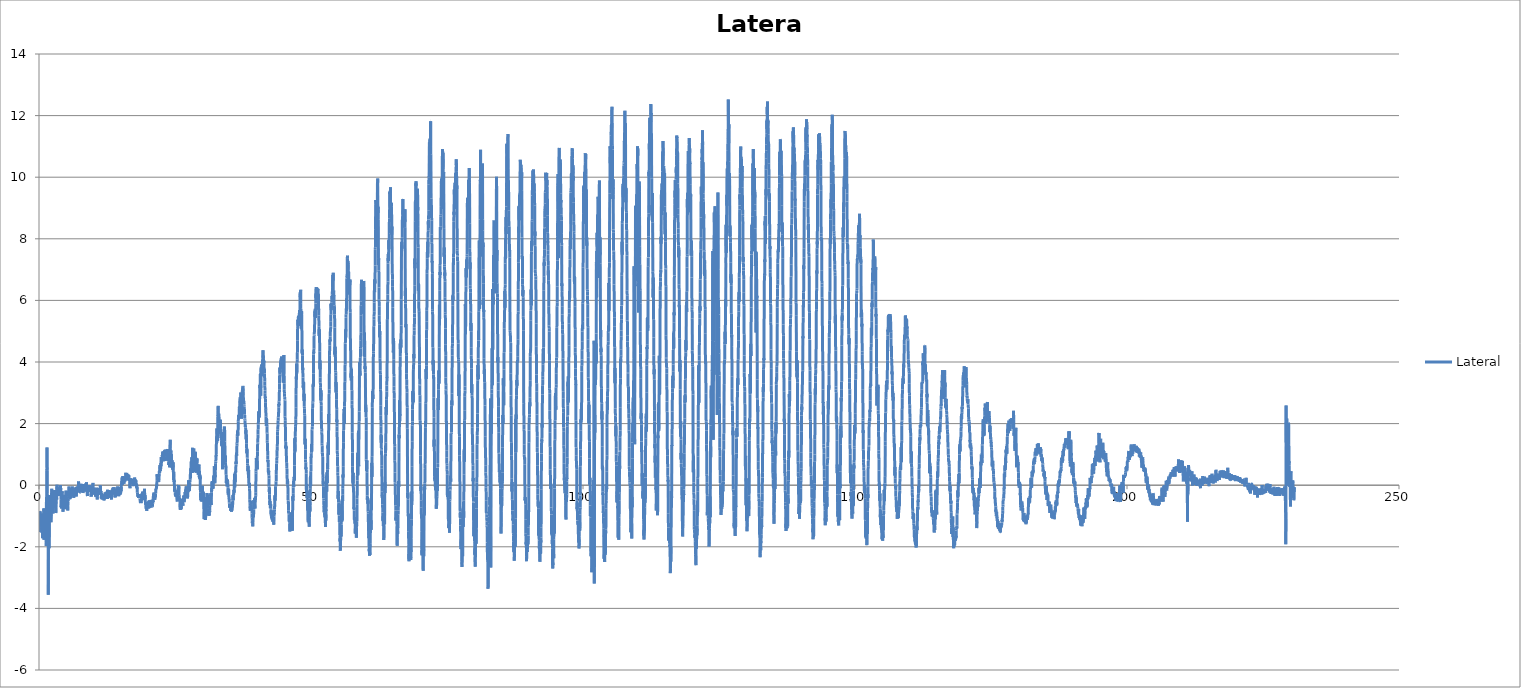
| Category | Lateral |
|---|---|
| 0.014945 | -1.185 |
| 0.035636 | -1.504 |
| 0.055821 | -1.523 |
| 0.076044 | -1.369 |
| 0.098121 | -1.33 |
| 0.115069 | -1.127 |
| 0.135773 | -1.061 |
| 0.155165 | -0.896 |
| 0.176035 | -0.906 |
| 0.197 | -0.848 |
| 0.215319 | -0.848 |
| 0.235327 | -1.128 |
| 0.25648 | -0.983 |
| 0.276005 | -1.012 |
| 0.296604 | -0.954 |
| 0.315138 | -1.194 |
| 0.335667 | -1.32 |
| 0.355463 | -1.069 |
| 0.376 | -1.05 |
| 0.399738 | -1.224 |
| 0.41528 | -0.933 |
| 0.436085 | -0.943 |
| 0.455854 | -1.186 |
| 0.476437 | -1.205 |
| 0.498872 | -1.166 |
| 0.514997 | -1.234 |
| 0.535722 | -1.545 |
| 0.556269 | -1.15 |
| 0.57613 | -0.917 |
| 0.597996 | -1.325 |
| 0.615611 | -1.113 |
| 0.635685 | -1.565 |
| 0.655853 | -1.719 |
| 0.676009 | -1.371 |
| 0.69694 | -1.197 |
| 0.7153 | -1.052 |
| 0.735665 | -1.312 |
| 0.756108 | -1.206 |
| 0.776408 | -1.506 |
| 0.797321 | -1.131 |
| 0.815092 | -1.27 |
| 0.835961 | -1.513 |
| 0.856207 | -0.77 |
| 0.876014 | -0.752 |
| 0.896821 | -0.856 |
| 0.91549 | -1.194 |
| 0.935716 | -1.774 |
| 0.956297 | -1.165 |
| 0.976011 | -1.309 |
| 0.998525 | -1.483 |
| 1.01508 | -1.522 |
| 1.035636 | -1.281 |
| 1.055848 | -1.185 |
| 1.07625 | -1.176 |
| 1.097618 | -1.523 |
| 1.115062 | -1.464 |
| 1.135414 | -1.338 |
| 1.156078 | -1.127 |
| 1.176083 | -1.319 |
| 1.196773 | -0.897 |
| 1.214975 | -0.935 |
| 1.235658 | -1.079 |
| 1.255839 | -1.359 |
| 1.27602 | -1.108 |
| 1.298763 | -1.139 |
| 1.315003 | -1.855 |
| 1.335448 | -1.974 |
| 1.355851 | -0.544 |
| 1.376145 | -0.613 |
| 1.396741 | -0.594 |
| 1.414998 | 0.07 |
| 1.435743 | 0.483 |
| 1.455804 | 0.549 |
| 1.476003 | 1.226 |
| 1.496659 | 0.474 |
| 1.514989 | -0.268 |
| 1.535668 | -0.567 |
| 1.555949 | -0.568 |
| 1.576136 | -1.332 |
| 1.597998 | -1.207 |
| 1.615086 | -1.671 |
| 1.635797 | -1.398 |
| 1.655927 | -1.669 |
| 1.676022 | -1.738 |
| 1.696716 | -2.645 |
| 1.715102 | -3.56 |
| 1.735607 | -1.97 |
| 1.755897 | -1.228 |
| 1.776004 | -0.537 |
| 1.79715 | -0.399 |
| 1.814993 | -1.694 |
| 1.835722 | -0.657 |
| 1.855864 | -2.044 |
| 1.875749 | -0.467 |
| 1.898039 | -0.321 |
| 1.914965 | -0.485 |
| 1.935554 | -0.601 |
| 1.975689 | -0.796 |
| 1.999181 | -0.854 |
| 2.015033 | -0.593 |
| 2.03618 | -0.457 |
| 2.055874 | -0.476 |
| 2.076005 | -0.477 |
| 2.096361 | -0.544 |
| 2.115169 | -0.611 |
| 2.135686 | -1.056 |
| 2.15586 | -1.083 |
| 2.17647 | -0.852 |
| 2.198228 | -0.939 |
| 2.215241 | -1.2 |
| 2.235702 | -0.93 |
| 2.255789 | -0.746 |
| 2.275571 | -0.678 |
| 2.296472 | -0.65 |
| 2.315078 | -0.244 |
| 2.33564 | -0.331 |
| 2.3558 | -0.118 |
| 2.376016 | -0.301 |
| 2.396627 | -0.514 |
| 2.415024 | -0.292 |
| 2.436973 | -0.649 |
| 2.455842 | -0.477 |
| 2.475185 | -0.486 |
| 2.499318 | -0.814 |
| 2.515209 | -0.349 |
| 2.535992 | -0.254 |
| 2.555846 | -0.533 |
| 2.576002 | -0.92 |
| 2.597476 | -0.658 |
| 2.615094 | -0.591 |
| 2.635766 | -0.398 |
| 2.655857 | -0.195 |
| 2.675682 | -0.253 |
| 2.696545 | -0.166 |
| 2.715037 | -0.301 |
| 2.735756 | -0.407 |
| 2.755554 | -0.485 |
| 2.776007 | -0.389 |
| 2.79752 | -0.601 |
| 2.814985 | -0.456 |
| 2.835516 | -0.321 |
| 2.855839 | -0.456 |
| 2.876013 | -0.514 |
| 2.898767 | -0.746 |
| 2.91499 | -0.456 |
| 2.935938 | -0.321 |
| 2.956455 | -0.166 |
| 2.976001 | -0.388 |
| 2.996873 | -0.571 |
| 3.01503 | -0.658 |
| 3.035669 | -0.581 |
| 3.056022 | -0.533 |
| 3.075319 | -0.755 |
| 3.097545 | -0.9 |
| 3.115012 | -0.891 |
| 3.135582 | -0.726 |
| 3.155428 | -0.543 |
| 3.176012 | -0.321 |
| 3.196802 | -0.167 |
| 3.215046 | -0.321 |
| 3.235552 | -0.408 |
| 3.256064 | -0.466 |
| 3.276004 | -0.148 |
| 3.296298 | 0.016 |
| 3.316156 | -0.128 |
| 3.335606 | -0.263 |
| 3.355859 | -0.224 |
| 3.376001 | -0.234 |
| 3.398241 | -0.215 |
| 3.41499 | -0.292 |
| 3.435645 | -0.321 |
| 3.455905 | -0.35 |
| 3.475113 | -0.244 |
| 3.496417 | -0.069 |
| 3.514999 | -0.205 |
| 3.535717 | -0.214 |
| 3.555184 | -0.321 |
| 3.575557 | -0.34 |
| 3.596701 | -0.138 |
| 3.615173 | -0.089 |
| 3.635507 | -0.321 |
| 3.6559 | -0.205 |
| 3.676003 | -0.119 |
| 3.698724 | -0.099 |
| 3.717467 | -0.176 |
| 3.737209 | -0.234 |
| 3.75593 | -0.331 |
| 3.775328 | -0.34 |
| 3.795986 | -0.205 |
| 3.814991 | -0.157 |
| 3.835682 | -0.215 |
| 3.855834 | -0.128 |
| 3.875673 | -0.04 |
| 3.8965 | -0.012 |
| 3.915178 | -0.118 |
| 3.935427 | -0.195 |
| 3.955047 | 0.008 |
| 3.976005 | -0.137 |
| 3.99692 | -0.089 |
| 4.014988 | -0.205 |
| 4.035417 | -0.466 |
| 4.055816 | -0.717 |
| 4.075997 | -0.678 |
| 4.097205 | -0.688 |
| 4.116096 | -0.621 |
| 4.136451 | -0.756 |
| 4.15586 | -0.707 |
| 4.176001 | -0.418 |
| 4.197642 | -0.418 |
| 4.21514 | -0.389 |
| 4.235757 | -0.418 |
| 4.256561 | -0.196 |
| 4.276519 | -0.264 |
| 4.296896 | -0.457 |
| 4.315353 | -0.389 |
| 4.335888 | -0.495 |
| 4.356982 | -0.36 |
| 4.37601 | -0.457 |
| 4.397084 | -0.649 |
| 4.415363 | -0.862 |
| 4.438569 | -0.775 |
| 4.45611 | -0.649 |
| 4.476093 | -0.349 |
| 4.49714 | -0.378 |
| 4.518319 | -0.465 |
| 4.536562 | -0.369 |
| 4.555971 | -0.504 |
| 4.576031 | -0.582 |
| 4.600024 | -0.688 |
| 4.615184 | -0.697 |
| 4.635675 | -0.504 |
| 4.656048 | -0.63 |
| 4.678576 | -0.582 |
| 4.695278 | -0.485 |
| 4.715118 | -0.321 |
| 4.735944 | -0.504 |
| 4.760573 | -0.775 |
| 4.776 | -0.775 |
| 4.795495 | -0.64 |
| 4.815935 | -0.737 |
| 4.838143 | -0.572 |
| 4.85592 | -0.582 |
| 4.875996 | -0.563 |
| 4.894999 | -0.486 |
| 4.920213 | -0.263 |
| 4.935964 | -0.263 |
| 4.956526 | -0.176 |
| 4.97599 | -0.214 |
| 5.027029 | -0.301 |
| 5.036021 | -0.408 |
| 5.05586 | -0.553 |
| 5.07701 | -0.717 |
| 5.095189 | -0.736 |
| 5.115047 | -0.659 |
| 5.13594 | -0.785 |
| 5.157704 | -0.649 |
| 5.176059 | -0.524 |
| 5.195515 | -0.64 |
| 5.21504 | -0.534 |
| 5.235927 | -0.631 |
| 5.256481 | -0.678 |
| 5.275999 | -0.688 |
| 5.295607 | -0.823 |
| 5.315884 | -0.563 |
| 5.335866 | -0.524 |
| 5.355843 | -0.514 |
| 5.375996 | -0.437 |
| 5.400783 | -0.369 |
| 5.415457 | -0.196 |
| 5.435506 | -0.215 |
| 5.455857 | -0.34 |
| 5.481898 | -0.36 |
| 5.49514 | -0.157 |
| 5.515122 | -0.041 |
| 5.535547 | -0.283 |
| 5.56198 | -0.35 |
| 5.576006 | -0.35 |
| 5.595016 | -0.398 |
| 5.615554 | -0.311 |
| 5.638791 | -0.34 |
| 5.655841 | -0.418 |
| 5.675991 | -0.456 |
| 5.695313 | -0.36 |
| 5.721277 | -0.418 |
| 5.735953 | -0.427 |
| 5.755838 | -0.34 |
| 5.776208 | -0.302 |
| 5.803278 | -0.408 |
| 5.814978 | -0.408 |
| 5.835628 | -0.282 |
| 5.855869 | -0.311 |
| 5.883488 | -0.167 |
| 5.89525 | -0.196 |
| 5.914989 | -0.186 |
| 5.935853 | -0.253 |
| 5.96412 | -0.301 |
| 5.975991 | -0.282 |
| 5.996781 | -0.099 |
| 6.015106 | -0.166 |
| 6.042456 | -0.321 |
| 6.055881 | -0.311 |
| 6.075984 | -0.224 |
| 6.096869 | -0.041 |
| 6.143107 | -0.157 |
| 6.155649 | -0.186 |
| 6.176119 | -0.282 |
| 6.197401 | -0.341 |
| 6.215084 | -0.283 |
| 6.23568 | -0.282 |
| 6.276015 | -0.292 |
| 6.300455 | -0.321 |
| 6.314932 | -0.321 |
| 6.335613 | -0.166 |
| 6.35597 | -0.215 |
| 6.381831 | -0.359 |
| 6.395 | -0.408 |
| 6.415118 | -0.32 |
| 6.435851 | -0.311 |
| 6.458169 | -0.35 |
| 6.475996 | -0.36 |
| 6.495289 | -0.36 |
| 6.514994 | -0.273 |
| 6.536813 | -0.157 |
| 6.556187 | -0.128 |
| 6.575841 | -0.089 |
| 6.595039 | -0.254 |
| 6.61962 | -0.321 |
| 6.635961 | -0.302 |
| 6.655824 | -0.263 |
| 6.675995 | -0.147 |
| 6.700858 | -0.321 |
| 6.71522 | -0.34 |
| 6.735588 | -0.311 |
| 6.755835 | -0.263 |
| 6.780711 | -0.166 |
| 6.795036 | -0.118 |
| 6.815107 | -0.06 |
| 6.835809 | -0.176 |
| 6.861759 | -0.369 |
| 6.876216 | -0.311 |
| 6.895435 | -0.234 |
| 6.915559 | -0.215 |
| 6.938976 | -0.254 |
| 6.956005 | -0.157 |
| 6.975985 | -0.166 |
| 6.994994 | -0.079 |
| 7.02156 | -0.041 |
| 7.036023 | -0.205 |
| 7.05542 | -0.234 |
| 7.075228 | -0.099 |
| 7.103108 | -0.205 |
| 7.114925 | -0.215 |
| 7.136072 | -0.089 |
| 7.155737 | -0.06 |
| 7.205596 | -0.07 |
| 7.215168 | -0.06 |
| 7.235767 | -0.051 |
| 7.255853 | 0.036 |
| 7.275831 | 0.123 |
| 7.296729 | 0.056 |
| 7.315149 | 0.026 |
| 7.336681 | -0.08 |
| 7.355998 | -0.07 |
| 7.375992 | -0.089 |
| 7.39737 | -0.109 |
| 7.417131 | -0.012 |
| 7.435812 | 0.017 |
| 7.455825 | -0.05 |
| 7.476106 | -0.147 |
| 7.498347 | -0.224 |
| 7.514932 | -0.185 |
| 7.535712 | -0.176 |
| 7.556595 | -0.176 |
| 7.576059 | -0.205 |
| 7.596739 | -0.186 |
| 7.615045 | -0.195 |
| 7.63561 | -0.234 |
| 7.658169 | -0.234 |
| 7.676005 | -0.157 |
| 7.696774 | -0.09 |
| 7.715228 | -0.119 |
| 7.736889 | -0.176 |
| 7.755975 | -0.089 |
| 7.776079 | -0.069 |
| 7.797991 | 0.008 |
| 7.819197 | 0.037 |
| 7.835346 | 0.046 |
| 7.855923 | -0.118 |
| 7.875992 | -0.108 |
| 7.900284 | 0.037 |
| 7.915139 | -0.012 |
| 7.935832 | -0.138 |
| 7.955858 | -0.186 |
| 7.980392 | -0.186 |
| 7.995262 | -0.195 |
| 8.015492 | -0.07 |
| 8.03594 | -0.157 |
| 8.063771 | -0.08 |
| 8.076046 | -0.147 |
| 8.095533 | -0.253 |
| 8.11498 | -0.234 |
| 8.138236 | -0.06 |
| 8.156006 | -0.031 |
| 8.176057 | -0.041 |
| 8.195081 | -0.079 |
| 8.221293 | -0.098 |
| 8.235969 | -0.089 |
| 8.25585 | 0.008 |
| 8.275983 | 0.037 |
| 8.321285 | -0.176 |
| 8.336107 | -0.157 |
| 8.355831 | -0.128 |
| 8.376379 | -0.041 |
| 8.395788 | -0.166 |
| 8.415083 | -0.196 |
| 8.43604 | -0.205 |
| 8.456459 | -0.119 |
| 8.475994 | -0.109 |
| 8.495517 | -0.176 |
| 8.515155 | -0.099 |
| 8.535468 | -0.118 |
| 8.555935 | -0.137 |
| 8.575408 | -0.079 |
| 8.594962 | -0.011 |
| 8.615193 | 0.056 |
| 8.635921 | -0.002 |
| 8.655837 | -0.118 |
| 8.676087 | -0.04 |
| 8.698775 | 0.008 |
| 8.715132 | 0.095 |
| 8.735904 | 0.007 |
| 8.755831 | -0.138 |
| 8.779523 | -0.166 |
| 8.796395 | -0.166 |
| 8.815002 | -0.205 |
| 8.83582 | -0.225 |
| 8.857956 | -0.186 |
| 8.875452 | -0.34 |
| 8.896539 | -0.35 |
| 8.914971 | -0.263 |
| 8.936963 | -0.195 |
| 8.955942 | -0.224 |
| 8.976062 | -0.186 |
| 8.998762 | -0.166 |
| 9.019269 | -0.195 |
| 9.0367 | -0.157 |
| 9.05587 | -0.089 |
| 9.075535 | -0.002 |
| 9.100358 | -0.06 |
| 9.116081 | -0.05 |
| 9.135895 | -0.05 |
| 9.155972 | -0.175 |
| 9.180509 | -0.195 |
| 9.194984 | -0.069 |
| 9.215408 | -0.147 |
| 9.235829 | -0.117 |
| 9.262106 | -0.031 |
| 9.275991 | -0.002 |
| 9.295539 | -0.176 |
| 9.315187 | -0.214 |
| 9.356111 | -0.185 |
| 9.375972 | -0.089 |
| 9.395723 | -0.079 |
| 9.439475 | -0.089 |
| 9.456304 | -0.156 |
| 9.47594 | -0.118 |
| 9.497963 | -0.021 |
| 9.516114 | -0.05 |
| 9.535679 | -0.127 |
| 9.555835 | -0.321 |
| 9.576794 | -0.369 |
| 9.596761 | -0.311 |
| 9.615391 | -0.282 |
| 9.636083 | -0.359 |
| 9.655542 | -0.292 |
| 9.675997 | -0.282 |
| 9.697193 | -0.166 |
| 9.714924 | -0.108 |
| 9.736665 | -0.205 |
| 9.756093 | -0.04 |
| 9.775958 | -0.137 |
| 9.796814 | -0.05 |
| 9.818585 | -0.119 |
| 9.835982 | -0.07 |
| 9.855888 | -0.176 |
| 9.876186 | -0.127 |
| 9.900393 | 0.056 |
| 9.915664 | 0.075 |
| 9.9357 | -0.002 |
| 9.955933 | -0.147 |
| 9.97888 | -0.244 |
| 9.995255 | -0.166 |
| 10.014971 | -0.176 |
| 10.035883 | -0.166 |
| 10.060653 | -0.224 |
| 10.076022 | -0.224 |
| 10.095228 | -0.291 |
| 10.114956 | -0.185 |
| 10.138725 | -0.127 |
| 10.15604 | -0.117 |
| 10.176581 | -0.137 |
| 10.195048 | -0.127 |
| 10.220328 | -0.137 |
| 10.2359 | -0.253 |
| 10.255952 | -0.311 |
| 10.275977 | -0.244 |
| 10.30287 | -0.176 |
| 10.315221 | -0.205 |
| 10.335643 | -0.282 |
| 10.355837 | -0.176 |
| 10.383272 | -0.311 |
| 10.395069 | -0.369 |
| 10.415078 | -0.282 |
| 10.435916 | -0.311 |
| 10.463281 | -0.282 |
| 10.476035 | -0.292 |
| 10.496413 | -0.369 |
| 10.515154 | -0.378 |
| 10.55943 | -0.224 |
| 10.576216 | -0.253 |
| 10.595309 | -0.195 |
| 10.615072 | -0.079 |
| 10.635942 | -0.253 |
| 10.655861 | -0.311 |
| 10.675984 | -0.32 |
| 10.698027 | -0.369 |
| 10.715144 | -0.466 |
| 10.735486 | -0.369 |
| 10.755821 | -0.205 |
| 10.777175 | -0.137 |
| 10.795355 | -0.224 |
| 10.814969 | -0.263 |
| 10.835847 | -0.234 |
| 10.859119 | -0.157 |
| 10.875995 | -0.224 |
| 10.895635 | -0.312 |
| 10.914967 | -0.214 |
| 10.93785 | -0.089 |
| 10.955923 | -0.186 |
| 10.975994 | -0.224 |
| 10.995388 | -0.176 |
| 11.018885 | -0.176 |
| 11.035913 | -0.205 |
| 11.055899 | -0.147 |
| 11.076127 | -0.176 |
| 11.101242 | -0.156 |
| 11.115202 | -0.176 |
| 11.135731 | -0.224 |
| 11.155382 | -0.234 |
| 11.182446 | -0.157 |
| 11.194986 | -0.176 |
| 11.215012 | -0.233 |
| 11.235829 | -0.243 |
| 11.261896 | -0.157 |
| 11.275999 | -0.002 |
| 11.295564 | -0.089 |
| 11.315595 | -0.253 |
| 11.339503 | -0.253 |
| 11.355946 | -0.302 |
| 11.376231 | -0.234 |
| 11.396577 | -0.186 |
| 11.421722 | -0.321 |
| 11.436072 | -0.389 |
| 11.455839 | -0.427 |
| 11.47532 | -0.369 |
| 11.502925 | -0.263 |
| 11.515203 | -0.311 |
| 11.53564 | -0.417 |
| 11.555833 | -0.446 |
| 11.601091 | -0.359 |
| 11.614926 | -0.379 |
| 11.636183 | -0.465 |
| 11.654936 | -0.407 |
| 11.675498 | -0.311 |
| 11.696875 | -0.35 |
| 11.715009 | -0.301 |
| 11.735351 | -0.331 |
| 11.755905 | -0.34 |
| 11.775982 | -0.418 |
| 11.796771 | -0.437 |
| 11.817321 | -0.37 |
| 11.836011 | -0.389 |
| 11.855827 | -0.34 |
| 11.875983 | -0.35 |
| 11.899984 | -0.35 |
| 11.914899 | -0.369 |
| 11.935666 | -0.427 |
| 11.955774 | -0.495 |
| 11.979581 | -0.456 |
| 11.995889 | -0.465 |
| 12.014968 | -0.369 |
| 12.03583 | -0.446 |
| 12.060139 | -0.388 |
| 12.076116 | -0.35 |
| 12.095061 | -0.369 |
| 12.136009 | -0.311 |
| 12.160277 | -0.234 |
| 12.176042 | -0.341 |
| 12.195902 | -0.35 |
| 12.214935 | -0.379 |
| 12.237173 | -0.35 |
| 12.255724 | -0.312 |
| 12.275976 | -0.331 |
| 12.295366 | -0.292 |
| 12.319652 | -0.379 |
| 12.336257 | -0.292 |
| 12.355872 | -0.292 |
| 12.376228 | -0.215 |
| 12.401898 | -0.282 |
| 12.415457 | -0.302 |
| 12.436177 | -0.302 |
| 12.455943 | -0.292 |
| 12.480653 | -0.282 |
| 12.495681 | -0.215 |
| 12.515052 | -0.225 |
| 12.535818 | -0.447 |
| 12.56289 | -0.331 |
| 12.575986 | -0.148 |
| 12.596968 | -0.292 |
| 12.615122 | -0.312 |
| 12.648064 | -0.427 |
| 12.675926 | -0.321 |
| 12.697096 | -0.224 |
| 12.73904 | -0.311 |
| 12.756112 | -0.33 |
| 12.776265 | -0.35 |
| 12.798212 | -0.176 |
| 12.815968 | -0.157 |
| 12.835554 | -0.225 |
| 12.855886 | -0.331 |
| 12.877781 | -0.253 |
| 12.897252 | -0.225 |
| 12.915095 | -0.234 |
| 12.936606 | -0.322 |
| 12.95532 | -0.36 |
| 12.976028 | -0.331 |
| 12.996974 | -0.176 |
| 13.015046 | -0.215 |
| 13.036022 | -0.195 |
| 13.056156 | -0.263 |
| 13.076008 | -0.408 |
| 13.096863 | -0.273 |
| 13.117249 | -0.244 |
| 13.136122 | -0.225 |
| 13.155682 | -0.244 |
| 13.17581 | -0.283 |
| 13.19887 | -0.36 |
| 13.215988 | -0.312 |
| 13.235991 | -0.196 |
| 13.255816 | -0.244 |
| 13.278184 | -0.341 |
| 13.295426 | -0.341 |
| 13.315001 | -0.447 |
| 13.335864 | -0.466 |
| 13.360099 | -0.263 |
| 13.376225 | -0.321 |
| 13.395691 | -0.35 |
| 13.414966 | -0.389 |
| 13.43891 | -0.176 |
| 13.456547 | -0.147 |
| 13.475473 | -0.196 |
| 13.495712 | -0.302 |
| 13.520494 | -0.206 |
| 13.536208 | -0.254 |
| 13.555953 | -0.148 |
| 13.575972 | -0.1 |
| 13.602575 | -0.177 |
| 13.615326 | -0.177 |
| 13.636399 | -0.158 |
| 13.655891 | -0.07 |
| 13.681889 | -0.109 |
| 13.695027 | -0.1 |
| 13.714978 | -0.119 |
| 13.735967 | -0.138 |
| 13.764713 | -0.177 |
| 13.775983 | -0.177 |
| 13.796421 | -0.128 |
| 13.815096 | -0.07 |
| 13.860967 | -0.215 |
| 13.87619 | -0.186 |
| 13.895249 | -0.148 |
| 13.914989 | -0.129 |
| 13.935689 | -0.206 |
| 13.955825 | -0.283 |
| 13.975982 | -0.341 |
| 13.997118 | -0.331 |
| 14.01518 | -0.37 |
| 14.035524 | -0.399 |
| 14.055885 | -0.293 |
| 14.077676 | -0.302 |
| 14.096543 | -0.341 |
| 14.114962 | -0.322 |
| 14.135637 | -0.273 |
| 14.156582 | -0.225 |
| 14.175995 | -0.293 |
| 14.19663 | -0.322 |
| 14.214958 | -0.351 |
| 14.234944 | -0.196 |
| 14.255854 | -0.128 |
| 14.276064 | -0.177 |
| 14.29889 | -0.128 |
| 14.31813 | -0.215 |
| 14.336083 | -0.196 |
| 14.355867 | -0.128 |
| 14.376056 | -0.09 |
| 14.400449 | -0.08 |
| 14.414892 | -0.128 |
| 14.435687 | -0.177 |
| 14.455823 | -0.157 |
| 14.476939 | -0.07 |
| 14.495522 | -0.041 |
| 14.515005 | -0.099 |
| 14.535855 | -0.292 |
| 14.559199 | -0.186 |
| 14.575986 | -0.06 |
| 14.59557 | -0.061 |
| 14.615047 | -0.206 |
| 14.63669 | -0.273 |
| 14.655895 | -0.283 |
| 14.676023 | -0.36 |
| 14.695536 | -0.273 |
| 14.720365 | -0.234 |
| 14.735602 | -0.147 |
| 14.755837 | -0.292 |
| 14.776116 | -0.215 |
| 14.801762 | -0.109 |
| 14.815475 | -0.157 |
| 14.835602 | -0.089 |
| 14.855947 | -0.205 |
| 14.900441 | -0.312 |
| 14.914888 | -0.292 |
| 14.935837 | -0.263 |
| 14.954971 | -0.206 |
| 14.97603 | -0.157 |
| 14.996653 | -0.273 |
| 15.014926 | -0.253 |
| 15.035691 | -0.128 |
| 15.056056 | -0.109 |
| 15.075979 | -0.06 |
| 15.098067 | -0.196 |
| 15.11628 | -0.147 |
| 15.135854 | 0.007 |
| 15.155967 | 0.037 |
| 15.175968 | -0.002 |
| 15.196812 | 0.084 |
| 15.21513 | 0.045 |
| 15.235768 | 0.133 |
| 15.255118 | 0.094 |
| 15.276448 | 0.248 |
| 15.297479 | 0.2 |
| 15.314963 | 0.142 |
| 15.335685 | 0.017 |
| 15.358126 | 0.249 |
| 15.375904 | 0.287 |
| 15.397488 | 0.239 |
| 15.415059 | 0.181 |
| 15.437751 | 0.152 |
| 15.455732 | 0.258 |
| 15.476166 | 0.23 |
| 15.499091 | 0.297 |
| 15.519741 | 0.229 |
| 15.535858 | 0.22 |
| 15.556007 | 0.21 |
| 15.57607 | 0.22 |
| 15.600395 | 0.142 |
| 15.614995 | 0.065 |
| 15.635597 | 0.045 |
| 15.655732 | 0.191 |
| 15.677303 | 0.171 |
| 15.696018 | 0.123 |
| 15.715203 | 0.123 |
| 15.735746 | 0.161 |
| 15.762442 | 0.21 |
| 15.77598 | 0.152 |
| 15.795291 | 0.152 |
| 15.815395 | 0.123 |
| 15.839537 | 0.239 |
| 15.855953 | 0.23 |
| 15.875988 | 0.201 |
| 15.895276 | 0.181 |
| 15.918373 | 0.22 |
| 15.93652 | 0.278 |
| 15.955912 | 0.403 |
| 15.976086 | 0.287 |
| 16.021826 | 0.258 |
| 16.035875 | 0.23 |
| 16.05587 | 0.258 |
| 16.075422 | 0.239 |
| 16.095746 | 0.316 |
| 16.115098 | 0.394 |
| 16.135849 | 0.374 |
| 16.157434 | 0.22 |
| 16.175792 | 0.162 |
| 16.195765 | 0.249 |
| 16.215029 | 0.355 |
| 16.234915 | 0.326 |
| 16.256034 | 0.259 |
| 16.276045 | 0.23 |
| 16.296418 | 0.21 |
| 16.318155 | 0.277 |
| 16.335876 | 0.258 |
| 16.35591 | 0.162 |
| 16.375384 | 0.22 |
| 16.39811 | 0.307 |
| 16.415325 | 0.346 |
| 16.435893 | 0.259 |
| 16.455843 | 0.278 |
| 16.478918 | 0.307 |
| 16.496545 | 0.288 |
| 16.514918 | 0.317 |
| 16.535482 | 0.24 |
| 16.557025 | 0.211 |
| 16.576276 | 0.221 |
| 16.596206 | 0.182 |
| 16.614958 | 0.133 |
| 16.63743 | 0.133 |
| 16.655831 | 0.172 |
| 16.675886 | 0.114 |
| 16.695985 | -0.011 |
| 16.716536 | -0.098 |
| 16.735816 | -0.021 |
| 16.755918 | 0.066 |
| 16.775984 | 0.124 |
| 16.800631 | 0.085 |
| 16.816096 | 0.22 |
| 16.835726 | 0.201 |
| 16.855384 | 0.153 |
| 16.880297 | 0.211 |
| 16.894916 | 0.192 |
| 16.914955 | 0.192 |
| 16.935832 | 0.192 |
| 16.963323 | 0.134 |
| 16.975894 | 0.124 |
| 16.996524 | 0.143 |
| 17.014898 | 0.173 |
| 17.040025 | 0.154 |
| 17.056123 | 0.115 |
| 17.075034 | 0.104 |
| 17.096642 | 0.095 |
| 17.140175 | 0.086 |
| 17.155523 | 0.105 |
| 17.175981 | 0.201 |
| 17.196772 | 0.211 |
| 17.215495 | 0.182 |
| 17.235624 | 0.027 |
| 17.255758 | 0.056 |
| 17.275554 | 0.115 |
| 17.296628 | -0.011 |
| 17.315335 | -0.031 |
| 17.335299 | 0.046 |
| 17.355115 | 0.182 |
| 17.375997 | 0.144 |
| 17.396522 | 0.056 |
| 17.415493 | 0.144 |
| 17.437874 | 0.066 |
| 17.45583 | 0.008 |
| 17.476551 | 0.037 |
| 17.496418 | 0.124 |
| 17.515621 | 0.153 |
| 17.535788 | 0.105 |
| 17.55597 | 0.163 |
| 17.575407 | 0.25 |
| 17.597461 | 0.212 |
| 17.614944 | 0.153 |
| 17.635866 | 0.105 |
| 17.656039 | 0.202 |
| 17.676122 | 0.115 |
| 17.696952 | 0.066 |
| 17.715224 | 0.018 |
| 17.735689 | -0.011 |
| 17.757916 | 0.086 |
| 17.776244 | 0.144 |
| 17.797245 | 0.163 |
| 17.815895 | 0.163 |
| 17.838821 | 0.018 |
| 17.856142 | 0.008 |
| 17.876029 | 0.057 |
| 17.897229 | 0.047 |
| 17.920527 | -0.079 |
| 17.937356 | -0.079 |
| 17.955823 | 0.008 |
| 17.975967 | 0.018 |
| 18.001573 | -0.068 |
| 18.015176 | -0.107 |
| 18.035491 | -0.069 |
| 18.055832 | -0.088 |
| 18.082209 | -0.243 |
| 18.096252 | -0.242 |
| 18.114988 | -0.291 |
| 18.135834 | -0.32 |
| 18.163029 | -0.358 |
| 18.175222 | -0.368 |
| 18.196246 | -0.3 |
| 18.215078 | -0.34 |
| 18.263605 | -0.359 |
| 18.276571 | -0.417 |
| 18.296269 | -0.368 |
| 18.316051 | -0.301 |
| 18.336622 | -0.31 |
| 18.355839 | -0.359 |
| 18.375966 | -0.349 |
| 18.39767 | -0.378 |
| 18.415174 | -0.301 |
| 18.435848 | -0.291 |
| 18.455877 | -0.349 |
| 18.477702 | -0.407 |
| 18.496444 | -0.358 |
| 18.514953 | -0.32 |
| 18.535329 | -0.407 |
| 18.555943 | -0.426 |
| 18.575915 | -0.455 |
| 18.596796 | -0.474 |
| 18.614891 | -0.465 |
| 18.636249 | -0.562 |
| 18.65605 | -0.581 |
| 18.675979 | -0.513 |
| 18.696618 | -0.456 |
| 18.716516 | -0.552 |
| 18.735891 | -0.485 |
| 18.755825 | -0.552 |
| 18.77493 | -0.581 |
| 18.79739 | -0.532 |
| 18.814878 | -0.513 |
| 18.835045 | -0.445 |
| 18.855835 | -0.407 |
| 18.879441 | -0.426 |
| 18.895065 | -0.436 |
| 18.915172 | -0.33 |
| 18.935844 | -0.271 |
| 18.961504 | -0.368 |
| 18.976009 | -0.388 |
| 18.995646 | -0.32 |
| 19.015033 | -0.214 |
| 19.03718 | -0.311 |
| 19.055814 | -0.263 |
| 19.076014 | -0.214 |
| 19.095428 | -0.214 |
| 19.12166 | -0.282 |
| 19.136137 | -0.272 |
| 19.155825 | -0.262 |
| 19.175736 | -0.253 |
| 19.202938 | -0.263 |
| 19.215219 | -0.243 |
| 19.235566 | -0.3 |
| 19.255918 | -0.281 |
| 19.304056 | -0.243 |
| 19.315819 | -0.271 |
| 19.335572 | -0.311 |
| 19.355434 | -0.484 |
| 19.376042 | -0.339 |
| 19.396769 | -0.118 |
| 19.414896 | -0.234 |
| 19.435957 | -0.379 |
| 19.455827 | -0.418 |
| 19.475965 | -0.447 |
| 19.497999 | -0.369 |
| 19.51705 | -0.331 |
| 19.535399 | -0.36 |
| 19.555842 | -0.543 |
| 19.576078 | -0.63 |
| 19.601576 | -0.552 |
| 19.61491 | -0.562 |
| 19.63563 | -0.543 |
| 19.656193 | -0.707 |
| 19.678453 | -0.716 |
| 19.696924 | -0.765 |
| 19.714985 | -0.717 |
| 19.735649 | -0.65 |
| 19.756793 | -0.63 |
| 19.775397 | -0.727 |
| 19.796418 | -0.833 |
| 19.814916 | -0.746 |
| 19.837753 | -0.63 |
| 19.855825 | -0.601 |
| 19.876084 | -0.659 |
| 19.896333 | -0.669 |
| 19.919422 | -0.63 |
| 19.936138 | -0.689 |
| 19.956066 | -0.679 |
| 19.976017 | -0.611 |
| 19.99911 | -0.553 |
| 20.015913 | -0.582 |
| 20.0358 | -0.737 |
| 20.055988 | -0.746 |
| 20.080968 | -0.746 |
| 20.094964 | -0.746 |
| 20.115305 | -0.524 |
| 20.135778 | -0.534 |
| 20.16286 | -0.737 |
| 20.176157 | -0.756 |
| 20.19756 | -0.708 |
| 20.21503 | -0.708 |
| 20.241722 | -0.67 |
| 20.255905 | -0.669 |
| 20.27614 | -0.486 |
| 20.298886 | -0.612 |
| 20.321834 | -0.737 |
| 20.336751 | -0.669 |
| 20.355821 | -0.64 |
| 20.37597 | -0.573 |
| 20.421054 | -0.709 |
| 20.435355 | -0.728 |
| 20.456555 | -0.66 |
| 20.475186 | -0.602 |
| 20.495665 | -0.718 |
| 20.515348 | -0.564 |
| 20.535823 | -0.515 |
| 20.556378 | -0.574 |
| 20.576069 | -0.699 |
| 20.595843 | -0.641 |
| 20.615489 | -0.477 |
| 20.634968 | -0.525 |
| 20.655783 | -0.525 |
| 20.675963 | -0.574 |
| 20.69551 | -0.535 |
| 20.716187 | -0.515 |
| 20.7359 | -0.516 |
| 20.755094 | -0.516 |
| 20.77597 | -0.526 |
| 20.798455 | -0.67 |
| 20.815333 | -0.651 |
| 20.835682 | -0.68 |
| 20.855872 | -0.68 |
| 20.876993 | -0.641 |
| 20.895122 | -0.593 |
| 20.914982 | -0.593 |
| 20.935974 | -0.545 |
| 20.958983 | -0.516 |
| 20.975988 | -0.536 |
| 20.995921 | -0.545 |
| 21.014958 | -0.429 |
| 21.037536 | -0.274 |
| 21.056813 | -0.342 |
| 21.075966 | -0.333 |
| 21.095285 | -0.41 |
| 21.118436 | -0.448 |
| 21.135985 | -0.303 |
| 21.156033 | -0.236 |
| 21.175972 | -0.323 |
| 21.201298 | -0.381 |
| 21.214967 | -0.4 |
| 21.235942 | -0.362 |
| 21.255825 | -0.333 |
| 21.281938 | -0.477 |
| 21.295581 | -0.477 |
| 21.315876 | -0.342 |
| 21.33569 | -0.362 |
| 21.360637 | -0.342 |
| 21.375416 | -0.391 |
| 21.394974 | -0.362 |
| 21.415048 | -0.275 |
| 21.439562 | -0.265 |
| 21.45593 | -0.159 |
| 21.475968 | -0.12 |
| 21.495296 | -0.13 |
| 21.537277 | -0.11 |
| 21.555815 | -0.101 |
| 21.575967 | -0.101 |
| 21.596021 | -0.091 |
| 21.615169 | -0.053 |
| 21.635656 | 0.015 |
| 21.655879 | -0.024 |
| 21.675402 | 0.141 |
| 21.696665 | 0.305 |
| 21.715007 | 0.353 |
| 21.735555 | 0.286 |
| 21.754939 | 0.353 |
| 21.776079 | 0.343 |
| 21.796698 | 0.286 |
| 21.815423 | 0.286 |
| 21.83581 | 0.276 |
| 21.856038 | 0.237 |
| 21.87604 | 0.237 |
| 21.89715 | 0.189 |
| 21.915041 | 0.102 |
| 21.935677 | 0.141 |
| 21.955875 | 0.208 |
| 21.975961 | 0.179 |
| 21.997475 | 0.111 |
| 22.015663 | 0.111 |
| 22.035605 | 0.17 |
| 22.056018 | 0.16 |
| 22.075558 | 0.237 |
| 22.095375 | 0.392 |
| 22.115044 | 0.44 |
| 22.136001 | 0.469 |
| 22.156349 | 0.45 |
| 22.175962 | 0.402 |
| 22.196939 | 0.527 |
| 22.214941 | 0.595 |
| 22.236594 | 0.653 |
| 22.255859 | 0.518 |
| 22.276267 | 0.488 |
| 22.296871 | 0.46 |
| 22.316665 | 0.498 |
| 22.335776 | 0.479 |
| 22.355806 | 0.508 |
| 22.376253 | 0.672 |
| 22.399438 | 0.711 |
| 22.414973 | 0.614 |
| 22.435855 | 0.614 |
| 22.455796 | 0.817 |
| 22.476538 | 0.914 |
| 22.497309 | 0.74 |
| 22.515538 | 0.711 |
| 22.535755 | 0.798 |
| 22.556619 | 0.866 |
| 22.575542 | 0.875 |
| 22.597422 | 0.779 |
| 22.614984 | 0.779 |
| 22.654892 | 0.923 |
| 22.676089 | 0.981 |
| 22.695578 | 0.807 |
| 22.715029 | 0.972 |
| 22.73595 | 1.068 |
| 22.755797 | 0.943 |
| 22.775988 | 1.04 |
| 22.795369 | 1.098 |
| 22.814945 | 0.895 |
| 22.835857 | 0.866 |
| 22.856025 | 0.895 |
| 22.875039 | 0.982 |
| 22.8952 | 1.011 |
| 22.915006 | 0.857 |
| 22.935831 | 0.78 |
| 22.955237 | 0.934 |
| 22.976018 | 0.934 |
| 22.994974 | 1.049 |
| 23.01494 | 1.04 |
| 23.035143 | 1.049 |
| 23.056258 | 1.108 |
| 23.075949 | 1.079 |
| 23.095258 | 1.118 |
| 23.114964 | 1.06 |
| 23.135976 | 1.137 |
| 23.156178 | 1.147 |
| 23.175984 | 1.118 |
| 23.196151 | 1.118 |
| 23.214942 | 1.147 |
| 23.235687 | 1.108 |
| 23.255807 | 1.109 |
| 23.276911 | 1.147 |
| 23.296885 | 1.022 |
| 23.315218 | 1.147 |
| 23.335443 | 1.138 |
| 23.355275 | 1.128 |
| 23.376075 | 0.934 |
| 23.396439 | 0.79 |
| 23.415121 | 0.8 |
| 23.436228 | 0.925 |
| 23.455765 | 1.08 |
| 23.475972 | 1.002 |
| 23.497144 | 1.07 |
| 23.516136 | 0.963 |
| 23.535998 | 0.934 |
| 23.555792 | 1.041 |
| 23.575597 | 1.128 |
| 23.5978 | 1.08 |
| 23.614895 | 1.119 |
| 23.635575 | 1.176 |
| 23.655785 | 1.071 |
| 23.676333 | 0.945 |
| 23.697231 | 0.916 |
| 23.715212 | 0.954 |
| 23.735626 | 0.925 |
| 23.77783 | 0.781 |
| 23.798174 | 0.771 |
| 23.815243 | 0.762 |
| 23.835349 | 0.723 |
| 23.855968 | 0.714 |
| 23.876067 | 0.655 |
| 23.89762 | 0.714 |
| 23.915055 | 0.655 |
| 23.935875 | 0.723 |
| 23.955823 | 0.723 |
| 23.976277 | 0.762 |
| 23.996506 | 0.752 |
| 24.015108 | 0.579 |
| 24.03558 | 0.647 |
| 24.055798 | 0.82 |
| 24.075136 | 1.09 |
| 24.096623 | 1.177 |
| 24.11527 | 1.477 |
| 24.13569 | 1.187 |
| 24.155112 | 1.158 |
| 24.175839 | 1.129 |
| 24.198019 | 0.907 |
| 24.214941 | 0.994 |
| 24.235007 | 1.072 |
| 24.255821 | 1.129 |
| 24.276068 | 1.004 |
| 24.296959 | 0.762 |
| 24.315251 | 0.647 |
| 24.335786 | 0.839 |
| 24.355931 | 1.004 |
| 24.375959 | 0.801 |
| 24.39853 | 0.579 |
| 24.414896 | 0.627 |
| 24.435625 | 0.753 |
| 24.455953 | 0.811 |
| 24.476642 | 0.782 |
| 24.498002 | 0.695 |
| 24.515156 | 0.675 |
| 24.535452 | 0.618 |
| 24.555747 | 0.521 |
| 24.576168 | 0.502 |
| 24.596891 | 0.647 |
| 24.615293 | 0.579 |
| 24.635056 | 0.589 |
| 24.655976 | 0.723 |
| 24.675538 | 0.743 |
| 24.695805 | 0.424 |
| 24.715886 | 0.405 |
| 24.735712 | 0.173 |
| 24.755796 | 0.434 |
| 24.775955 | 0.434 |
| 24.817119 | 0.241 |
| 24.836034 | 0.105 |
| 24.855816 | 0.163 |
| 24.87543 | 0.154 |
| 24.895471 | -0.116 |
| 24.915459 | -0.194 |
| 24.935838 | -0.136 |
| 24.955226 | -0.097 |
| 24.975292 | -0.116 |
| 24.995655 | -0.223 |
| 25.015472 | -0.184 |
| 25.035203 | -0.165 |
| 25.055827 | -0.242 |
| 25.075956 | -0.368 |
| 25.0965 | -0.29 |
| 25.114935 | -0.329 |
| 25.13586 | -0.281 |
| 25.155827 | -0.271 |
| 25.176003 | -0.31 |
| 25.195291 | -0.271 |
| 25.214934 | -0.339 |
| 25.23583 | -0.281 |
| 25.255698 | -0.232 |
| 25.275207 | -0.387 |
| 25.295304 | -0.387 |
| 25.31497 | -0.378 |
| 25.335806 | -0.329 |
| 25.355828 | -0.32 |
| 25.375995 | -0.378 |
| 25.39539 | -0.484 |
| 25.414871 | -0.532 |
| 25.435169 | -0.397 |
| 25.456101 | -0.397 |
| 25.475432 | -0.32 |
| 25.496422 | -0.271 |
| 25.514876 | -0.165 |
| 25.535867 | -0.262 |
| 25.555829 | -0.272 |
| 25.575955 | -0.223 |
| 25.595523 | -0.001 |
| 25.615127 | 0.008 |
| 25.635801 | -0.069 |
| 25.656625 | -0.098 |
| 25.675144 | -0.117 |
| 25.695924 | -0.021 |
| 25.715124 | -0.06 |
| 25.735939 | -0.127 |
| 25.756083 | -0.321 |
| 25.776074 | -0.34 |
| 25.794982 | -0.331 |
| 25.815128 | -0.505 |
| 25.835049 | -0.437 |
| 25.855798 | -0.476 |
| 25.87603 | -0.486 |
| 25.895009 | -0.447 |
| 25.937128 | -0.678 |
| 25.955715 | -0.794 |
| 25.975991 | -0.678 |
| 25.998369 | -0.543 |
| 26.015386 | -0.494 |
| 26.035596 | -0.6 |
| 26.05583 | -0.794 |
| 26.075305 | -0.717 |
| 26.096708 | -0.504 |
| 26.115151 | -0.63 |
| 26.13563 | -0.766 |
| 26.155183 | -0.486 |
| 26.175955 | -0.573 |
| 26.197183 | -0.621 |
| 26.215317 | -0.505 |
| 26.235272 | -0.438 |
| 26.255794 | -0.496 |
| 26.276066 | -0.64 |
| 26.297415 | -0.602 |
| 26.315075 | -0.621 |
| 26.335645 | -0.573 |
| 26.355832 | -0.631 |
| 26.375951 | -0.631 |
| 26.397005 | -0.602 |
| 26.415005 | -0.631 |
| 26.435835 | -0.631 |
| 26.455995 | -0.67 |
| 26.475126 | -0.525 |
| 26.49716 | -0.486 |
| 26.515185 | -0.477 |
| 26.535467 | -0.438 |
| 26.555129 | -0.505 |
| 26.575955 | -0.409 |
| 26.59719 | -0.371 |
| 26.61494 | -0.351 |
| 26.635175 | -0.4 |
| 26.656342 | -0.332 |
| 26.676079 | -0.371 |
| 26.695805 | -0.544 |
| 26.715065 | -0.535 |
| 26.736094 | -0.38 |
| 26.755804 | -0.4 |
| 26.775955 | -0.409 |
| 26.797296 | -0.332 |
| 26.81513 | -0.351 |
| 26.835588 | -0.226 |
| 26.855787 | -0.245 |
| 26.896353 | -0.274 |
| 26.914948 | -0.371 |
| 26.93563 | -0.274 |
| 26.955662 | -0.197 |
| 26.975572 | -0.139 |
| 26.996378 | -0.361 |
| 27.014929 | -0.294 |
| 27.052654 | -0.033 |
| 27.07606 | -0.091 |
| 27.094986 | -0.265 |
| 27.115045 | -0.371 |
| 27.135594 | -0.352 |
| 27.15584 | -0.265 |
| 27.175974 | -0.226 |
| 27.195247 | -0.284 |
| 27.214885 | -0.39 |
| 27.235794 | -0.352 |
| 27.255605 | -0.284 |
| 27.275201 | -0.197 |
| 27.294974 | -0.293 |
| 27.315054 | -0.429 |
| 27.335799 | -0.293 |
| 27.354914 | -0.091 |
| 27.375957 | -0.149 |
| 27.39586 | -0.129 |
| 27.415616 | -0.226 |
| 27.435265 | -0.207 |
| 27.455365 | -0.091 |
| 27.475985 | 0.102 |
| 27.49569 | 0.16 |
| 27.514878 | -0.043 |
| 27.535848 | -0.197 |
| 27.555083 | -0.043 |
| 27.576041 | -0.12 |
| 27.595181 | -0.091 |
| 27.61493 | -0.178 |
| 27.635815 | -0.1 |
| 27.656033 | -0.177 |
| 27.675245 | -0.119 |
| 27.695596 | -0.042 |
| 27.715147 | 0.006 |
| 27.735814 | 0.093 |
| 27.75622 | 0.103 |
| 27.775963 | 0.18 |
| 27.795575 | 0.18 |
| 27.815087 | 0.354 |
| 27.83508 | 0.344 |
| 27.85592 | 0.238 |
| 27.876108 | 0.45 |
| 27.896282 | 0.547 |
| 27.916579 | 0.47 |
| 27.936738 | 0.422 |
| 27.955909 | 0.595 |
| 27.975946 | 0.711 |
| 27.998168 | 0.769 |
| 28.014995 | 0.625 |
| 28.035497 | 0.49 |
| 28.055017 | 0.779 |
| 28.077884 | 0.905 |
| 28.097617 | 0.635 |
| 28.114929 | 0.49 |
| 28.135316 | 0.423 |
| 28.177733 | 0.394 |
| 28.19861 | 0.848 |
| 28.214949 | 1.166 |
| 28.235335 | 1.214 |
| 28.255832 | 0.818 |
| 28.275955 | 0.664 |
| 28.2998 | 0.51 |
| 28.31519 | 0.568 |
| 28.336094 | 0.789 |
| 28.355816 | 0.992 |
| 28.376124 | 1.089 |
| 28.396829 | 0.857 |
| 28.414937 | 0.79 |
| 28.435914 | 1.195 |
| 28.455872 | 0.857 |
| 28.475546 | 0.558 |
| 28.496487 | 0.423 |
| 28.514925 | 0.471 |
| 28.535638 | 0.77 |
| 28.555135 | 0.954 |
| 28.575953 | 1.05 |
| 28.597242 | 1.022 |
| 28.614878 | 0.993 |
| 28.635185 | 0.925 |
| 28.655818 | 1.089 |
| 28.675831 | 0.964 |
| 28.696445 | 0.8 |
| 28.715019 | 0.849 |
| 28.735609 | 0.859 |
| 28.755789 | 0.945 |
| 28.775952 | 1.07 |
| 28.797291 | 0.858 |
| 28.814879 | 0.598 |
| 28.835847 | 0.569 |
| 28.855791 | 0.733 |
| 28.875173 | 0.878 |
| 28.897158 | 0.82 |
| 28.91512 | 0.425 |
| 28.935541 | 0.406 |
| 28.955925 | 0.753 |
| 28.976088 | 0.859 |
| 28.99684 | 0.723 |
| 29.015007 | 0.723 |
| 29.035919 | 0.868 |
| 29.056013 | 0.674 |
| 29.075947 | 0.52 |
| 29.098761 | 0.491 |
| 29.119867 | 0.674 |
| 29.135549 | 0.607 |
| 29.15584 | 0.617 |
| 29.176022 | 0.453 |
| 29.218593 | 0.512 |
| 29.235672 | 0.58 |
| 29.25582 | 0.541 |
| 29.275447 | 0.338 |
| 29.294909 | 0.473 |
| 29.315471 | 0.609 |
| 29.335822 | 0.637 |
| 29.354967 | 0.521 |
| 29.375957 | 0.492 |
| 29.395529 | 0.675 |
| 29.414968 | 0.666 |
| 29.435433 | 0.491 |
| 29.455918 | 0.259 |
| 29.47595 | 0.26 |
| 29.496995 | 0.462 |
| 29.515163 | 0.308 |
| 29.535789 | 0.241 |
| 29.555794 | 0.22 |
| 29.575949 | 0.337 |
| 29.595863 | 0.192 |
| 29.614923 | 0.288 |
| 29.635808 | 0.28 |
| 29.655728 | -0.146 |
| 29.675128 | -0.097 |
| 29.695096 | -0.232 |
| 29.714926 | -0.435 |
| 29.735818 | -0.474 |
| 29.756875 | -0.445 |
| 29.776023 | -0.291 |
| 29.795615 | -0.436 |
| 29.814953 | -0.523 |
| 29.836184 | -0.3 |
| 29.855983 | -0.349 |
| 29.876024 | -0.368 |
| 29.895085 | -0.319 |
| 29.916779 | -0.339 |
| 29.936092 | -0.474 |
| 29.955805 | -0.532 |
| 29.975311 | -0.212 |
| 29.99762 | -0.136 |
| 30.015155 | -0.155 |
| 30.035573 | -0.069 |
| 30.055755 | -0.02 |
| 30.079677 | -0.31 |
| 30.098179 | -0.359 |
| 30.11493 | -0.349 |
| 30.135336 | -0.204 |
| 30.157243 | -0.291 |
| 30.175886 | -0.484 |
| 30.196992 | -0.349 |
| 30.21504 | -0.233 |
| 30.23649 | -0.339 |
| 30.255761 | -0.456 |
| 30.276035 | -0.542 |
| 30.299309 | -0.677 |
| 30.338788 | -1.093 |
| 30.355745 | -1.102 |
| 30.376076 | -0.957 |
| 30.396767 | -0.861 |
| 30.4155 | -0.842 |
| 30.436323 | -0.996 |
| 30.45584 | -0.967 |
| 30.47678 | -0.639 |
| 30.496748 | -0.823 |
| 30.515322 | -0.823 |
| 30.535861 | -1.007 |
| 30.555001 | -0.813 |
| 30.57593 | -0.91 |
| 30.597008 | -1.036 |
| 30.615581 | -1.132 |
| 30.635258 | -1.016 |
| 30.65601 | -0.862 |
| 30.675939 | -0.988 |
| 30.696386 | -0.959 |
| 30.715018 | -0.959 |
| 30.735768 | -0.901 |
| 30.756026 | -0.389 |
| 30.776009 | -0.515 |
| 30.798302 | -0.447 |
| 30.814923 | -0.553 |
| 30.835599 | -0.525 |
| 30.855357 | -0.418 |
| 30.877325 | -0.254 |
| 30.896469 | -0.38 |
| 30.915284 | -0.379 |
| 30.935592 | -0.457 |
| 30.956685 | -0.409 |
| 30.976432 | -0.323 |
| 30.997592 | -0.303 |
| 31.014852 | -0.612 |
| 31.036449 | -0.747 |
| 31.056321 | -0.709 |
| 31.075966 | -0.651 |
| 31.098942 | -0.748 |
| 31.11884 | -0.902 |
| 31.136339 | -0.883 |
| 31.155813 | -0.98 |
| 31.176026 | -0.902 |
| 31.199776 | -0.961 |
| 31.215028 | -0.864 |
| 31.235619 | -0.864 |
| 31.255785 | -0.912 |
| 31.280172 | -0.961 |
| 31.294967 | -0.99 |
| 31.315024 | -0.903 |
| 31.335782 | -0.826 |
| 31.359687 | -0.835 |
| 31.375948 | -0.874 |
| 31.395181 | -0.826 |
| 31.415555 | -0.671 |
| 31.455944 | -0.526 |
| 31.475975 | -0.468 |
| 31.495519 | -0.555 |
| 31.514883 | -0.574 |
| 31.535931 | -0.565 |
| 31.555845 | -0.304 |
| 31.575946 | -0.362 |
| 31.595818 | -0.256 |
| 31.614951 | -0.42 |
| 31.635804 | -0.546 |
| 31.656148 | -0.643 |
| 31.675179 | -0.469 |
| 31.695471 | -0.247 |
| 31.714923 | -0.102 |
| 31.735911 | -0.179 |
| 31.755699 | -0.141 |
| 31.775744 | -0.092 |
| 31.795101 | 0.12 |
| 31.814972 | -0.006 |
| 31.835238 | -0.064 |
| 31.855894 | 0.023 |
| 31.876197 | 0.081 |
| 31.895275 | 0.129 |
| 31.915722 | 0.033 |
| 31.935937 | -0.122 |
| 31.955924 | -0.064 |
| 31.975497 | -0.083 |
| 31.997374 | -0.102 |
| 32.014964 | -0.073 |
| 32.035599 | -0.005 |
| 32.055784 | 0.072 |
| 32.077779 | 0.091 |
| 32.09752 | 0.226 |
| 32.115331 | 0.313 |
| 32.135471 | 0.207 |
| 32.156841 | 0.082 |
| 32.175906 | 0.13 |
| 32.196441 | 0.295 |
| 32.215156 | 0.526 |
| 32.236109 | 0.613 |
| 32.255796 | 0.478 |
| 32.276307 | 0.526 |
| 32.298905 | 0.333 |
| 32.319119 | 0.063 |
| 32.336587 | 0.092 |
| 32.355797 | 0.333 |
| 32.375939 | 0.256 |
| 32.400201 | 0.43 |
| 32.414947 | 0.449 |
| 32.435612 | 0.468 |
| 32.455841 | 0.71 |
| 32.499728 | 0.768 |
| 32.514876 | 0.817 |
| 32.53558 | 0.962 |
| 32.555368 | 0.943 |
| 32.576052 | 1.01 |
| 32.596857 | 1.271 |
| 32.615039 | 1.377 |
| 32.635444 | 1.542 |
| 32.655571 | 1.581 |
| 32.675337 | 1.378 |
| 32.695668 | 1.841 |
| 32.715114 | 1.696 |
| 32.735577 | 1.686 |
| 32.755836 | 1.628 |
| 32.776171 | 1.502 |
| 32.796819 | 1.619 |
| 32.81494 | 1.522 |
| 32.835571 | 1.434 |
| 32.855936 | 1.801 |
| 32.876454 | 2.218 |
| 32.896774 | 2.422 |
| 32.914977 | 2.547 |
| 32.935654 | 2.576 |
| 32.955868 | 2.411 |
| 32.975945 | 2.246 |
| 32.997347 | 2.159 |
| 33.015005 | 2.12 |
| 33.035291 | 2.082 |
| 33.055508 | 2.324 |
| 33.076212 | 2.101 |
| 33.099052 | 2.111 |
| 33.118939 | 2.034 |
| 33.136662 | 2.063 |
| 33.155846 | 1.86 |
| 33.17594 | 1.667 |
| 33.198442 | 1.764 |
| 33.21549 | 1.987 |
| 33.235975 | 2.016 |
| 33.255797 | 2.036 |
| 33.276925 | 1.784 |
| 33.295134 | 1.862 |
| 33.314963 | 2.113 |
| 33.335734 | 2.132 |
| 33.358031 | 2.074 |
| 33.376158 | 2.007 |
| 33.395702 | 1.833 |
| 33.4156 | 1.601 |
| 33.435637 | 1.591 |
| 33.455897 | 1.533 |
| 33.475934 | 1.544 |
| 33.496231 | 1.727 |
| 33.517237 | 1.65 |
| 33.535982 | 1.65 |
| 33.555801 | 1.447 |
| 33.575942 | 1.264 |
| 33.617754 | 1.321 |
| 33.635751 | 1.409 |
| 33.656362 | 1.371 |
| 33.675323 | 1.554 |
| 33.695724 | 1.69 |
| 33.714972 | 1.323 |
| 33.735801 | 0.85 |
| 33.755019 | 0.521 |
| 33.775946 | 0.685 |
| 33.795018 | 1.061 |
| 33.81519 | 1.458 |
| 33.835167 | 1.246 |
| 33.855788 | 1.092 |
| 33.876038 | 1.159 |
| 33.896394 | 1.381 |
| 33.91555 | 1.391 |
| 33.936053 | 1.41 |
| 33.955848 | 1.556 |
| 33.976037 | 1.652 |
| 33.996592 | 1.594 |
| 34.015025 | 1.72 |
| 34.035507 | 1.671 |
| 34.055762 | 1.816 |
| 34.076525 | 1.672 |
| 34.096464 | 1.826 |
| 34.114919 | 1.903 |
| 34.136098 | 1.594 |
| 34.155886 | 1.42 |
| 34.175878 | 1.208 |
| 34.197249 | 1.044 |
| 34.215084 | 0.918 |
| 34.236933 | 0.744 |
| 34.255757 | 0.967 |
| 34.275939 | 0.889 |
| 34.298799 | 0.725 |
| 34.316613 | 0.58 |
| 34.335644 | 0.609 |
| 34.355909 | 0.609 |
| 34.375935 | 0.397 |
| 34.398132 | 0.339 |
| 34.415088 | 0.194 |
| 34.435524 | 0.078 |
| 34.455784 | 0.165 |
| 34.476117 | 0.223 |
| 34.497768 | 0.135 |
| 34.515101 | 0.058 |
| 34.53558 | 0.087 |
| 34.556335 | -0.039 |
| 34.576066 | -0.02 |
| 34.597182 | 0.096 |
| 34.615124 | 0.126 |
| 34.636176 | 0.184 |
| 34.655747 | 0.184 |
| 34.675926 | 0.126 |
| 34.697393 | 0.097 |
| 34.735793 | -0.067 |
| 34.755955 | -0.184 |
| 34.775937 | -0.31 |
| 34.798223 | -0.213 |
| 34.81523 | -0.117 |
| 34.835582 | -0.242 |
| 34.855779 | -0.126 |
| 34.875318 | -0.184 |
| 34.896888 | -0.319 |
| 34.915183 | -0.454 |
| 34.935799 | -0.445 |
| 34.955104 | -0.445 |
| 34.976141 | -0.571 |
| 34.996797 | -0.59 |
| 35.015314 | -0.639 |
| 35.035174 | -0.687 |
| 35.056081 | -0.736 |
| 35.075935 | -0.629 |
| 35.099109 | -0.629 |
| 35.115509 | -0.62 |
| 35.1361 | -0.697 |
| 35.155941 | -0.63 |
| 35.175149 | -0.649 |
| 35.195692 | -0.756 |
| 35.21486 | -0.814 |
| 35.235827 | -0.765 |
| 35.255814 | -0.823 |
| 35.27543 | -0.775 |
| 35.295369 | -0.823 |
| 35.314986 | -0.766 |
| 35.335208 | -0.727 |
| 35.355479 | -0.65 |
| 35.375936 | -0.659 |
| 35.397052 | -0.862 |
| 35.415076 | -0.785 |
| 35.4361 | -0.737 |
| 35.455756 | -0.815 |
| 35.475935 | -0.824 |
| 35.49684 | -0.776 |
| 35.515613 | -0.573 |
| 35.535629 | -0.545 |
| 35.555807 | -0.719 |
| 35.57605 | -0.68 |
| 35.597042 | -0.622 |
| 35.615316 | -0.497 |
| 35.6356 | -0.438 |
| 35.655947 | -0.323 |
| 35.675448 | -0.361 |
| 35.697185 | -0.487 |
| 35.714911 | -0.39 |
| 35.735579 | -0.294 |
| 35.755089 | -0.275 |
| 35.775946 | -0.314 |
| 35.796957 | -0.217 |
| 35.815096 | -0.15 |
| 35.854142 | -0.227 |
| 35.87612 | -0.247 |
| 35.895397 | 0.005 |
| 35.915072 | 0.169 |
| 35.935822 | 0.372 |
| 35.955778 | 0.208 |
| 35.975933 | -0.034 |
| 35.995471 | -0.072 |
| 36.015527 | 0.188 |
| 36.035942 | 0.352 |
| 36.055972 | 0.111 |
| 36.075115 | 0.429 |
| 36.11491 | 0.429 |
| 36.135816 | 0.448 |
| 36.155082 | 0.42 |
| 36.175936 | 0.41 |
| 36.19548 | 0.671 |
| 36.215046 | 0.767 |
| 36.235367 | 0.69 |
| 36.255056 | 0.816 |
| 36.275938 | 0.941 |
| 36.294945 | 1.057 |
| 36.315111 | 1.056 |
| 36.335842 | 0.96 |
| 36.355823 | 1.018 |
| 36.375926 | 1.279 |
| 36.396164 | 1.356 |
| 36.415286 | 1.356 |
| 36.435589 | 1.502 |
| 36.455815 | 1.569 |
| 36.478308 | 1.743 |
| 36.496363 | 1.772 |
| 36.515119 | 1.694 |
| 36.535542 | 1.675 |
| 36.554909 | 1.608 |
| 36.575998 | 1.607 |
| 36.596657 | 1.743 |
| 36.615158 | 1.888 |
| 36.635246 | 2.061 |
| 36.656168 | 2.148 |
| 36.675936 | 2.187 |
| 36.696078 | 2.275 |
| 36.71503 | 2.284 |
| 36.735956 | 2.158 |
| 36.755769 | 2.206 |
| 36.775933 | 2.235 |
| 36.797323 | 2.255 |
| 36.81521 | 2.477 |
| 36.835531 | 2.554 |
| 36.855809 | 2.554 |
| 36.876991 | 2.429 |
| 36.895626 | 2.506 |
| 36.915134 | 2.661 |
| 36.935782 | 2.806 |
| 36.978971 | 2.845 |
| 36.996141 | 2.71 |
| 37.01578 | 2.632 |
| 37.037481 | 2.622 |
| 37.055914 | 2.777 |
| 37.075932 | 2.932 |
| 37.098314 | 3.01 |
| 37.115183 | 2.904 |
| 37.135403 | 2.807 |
| 37.155766 | 2.614 |
| 37.176033 | 2.788 |
| 37.195369 | 2.778 |
| 37.214843 | 2.469 |
| 37.235971 | 2.16 |
| 37.256099 | 2.2 |
| 37.275168 | 2.48 |
| 37.296508 | 2.837 |
| 37.31504 | 2.789 |
| 37.335231 | 2.847 |
| 37.355078 | 2.895 |
| 37.375936 | 3.05 |
| 37.396876 | 3.098 |
| 37.415097 | 3.137 |
| 37.435084 | 2.934 |
| 37.455618 | 2.993 |
| 37.476019 | 3.195 |
| 37.496801 | 3.224 |
| 37.515069 | 3.205 |
| 37.535866 | 3.05 |
| 37.55588 | 2.934 |
| 37.575938 | 2.809 |
| 37.595659 | 2.674 |
| 37.614949 | 2.645 |
| 37.63558 | 2.741 |
| 37.655972 | 2.694 |
| 37.674936 | 2.617 |
| 37.696713 | 2.578 |
| 37.715121 | 2.568 |
| 37.735564 | 2.55 |
| 37.755341 | 2.443 |
| 37.776089 | 2.462 |
| 37.79691 | 2.298 |
| 37.815207 | 2.163 |
| 37.835577 | 2.125 |
| 37.855881 | 2.115 |
| 37.876016 | 2.096 |
| 37.89685 | 1.99 |
| 37.916046 | 1.893 |
| 37.935826 | 1.903 |
| 37.955794 | 1.932 |
| 37.975926 | 1.874 |
| 38.018036 | 1.672 |
| 38.035858 | 1.787 |
| 38.055771 | 1.604 |
| 38.075469 | 1.488 |
| 38.095635 | 1.604 |
| 38.115138 | 1.652 |
| 38.135852 | 1.546 |
| 38.155041 | 1.343 |
| 38.175934 | 1.111 |
| 38.195816 | 1.044 |
| 38.215077 | 1.034 |
| 38.235484 | 1.169 |
| 38.255879 | 1.063 |
| 38.27604 | 0.889 |
| 38.295931 | 0.889 |
| 38.315156 | 0.87 |
| 38.335761 | 0.705 |
| 38.355886 | 0.647 |
| 38.375936 | 0.57 |
| 38.395002 | 0.455 |
| 38.414959 | 0.512 |
| 38.435787 | 0.628 |
| 38.4558 | 0.532 |
| 38.475073 | 0.445 |
| 38.495007 | 0.3 |
| 38.514903 | 0.232 |
| 38.535881 | 0.483 |
| 38.554963 | 0.376 |
| 38.575928 | 0.106 |
| 38.595453 | -0.029 |
| 38.614843 | 0.038 |
| 38.63508 | 0.029 |
| 38.655438 | 0.038 |
| 38.676052 | 0.077 |
| 38.694853 | 0.028 |
| 38.714938 | -0.117 |
| 38.736149 | -0.475 |
| 38.755853 | -0.571 |
| 38.775929 | -0.6 |
| 38.797298 | -0.649 |
| 38.815087 | -0.775 |
| 38.835559 | -0.823 |
| 38.855743 | -0.697 |
| 38.876226 | -0.717 |
| 38.897047 | -0.803 |
| 38.915284 | -0.832 |
| 38.935555 | -0.756 |
| 38.954926 | -0.727 |
| 38.976123 | -0.62 |
| 38.996528 | -0.505 |
| 39.014888 | -0.621 |
| 39.035211 | -0.718 |
| 39.055867 | -0.718 |
| 39.075925 | -0.776 |
| 39.09872 | -0.737 |
| 39.136455 | -0.747 |
| 39.155813 | -0.921 |
| 39.175258 | -1.057 |
| 39.197893 | -1.143 |
| 39.215002 | -1.23 |
| 39.235545 | -1.182 |
| 39.255772 | -1.163 |
| 39.275017 | -1.241 |
| 39.296496 | -1.337 |
| 39.314981 | -1.212 |
| 39.335482 | -1.077 |
| 39.35521 | -1.077 |
| 39.37593 | -1.077 |
| 39.396595 | -1.02 |
| 39.415259 | -0.914 |
| 39.435253 | -1.03 |
| 39.455663 | -0.933 |
| 39.475934 | -0.789 |
| 39.497104 | -0.566 |
| 39.515078 | -0.576 |
| 39.535297 | -0.48 |
| 39.555784 | -0.576 |
| 39.575934 | -0.479 |
| 39.595643 | -0.508 |
| 39.614907 | -0.411 |
| 39.635658 | -0.528 |
| 39.655754 | -0.46 |
| 39.675092 | -0.605 |
| 39.696647 | -0.759 |
| 39.714956 | -0.586 |
| 39.73557 | -0.548 |
| 39.75515 | -0.5 |
| 39.775952 | -0.5 |
| 39.797755 | -0.5 |
| 39.814928 | -0.384 |
| 39.835323 | -0.326 |
| 39.856058 | -0.229 |
| 39.875994 | 0.37 |
| 39.89689 | 0.447 |
| 39.915509 | 0.544 |
| 39.935797 | 0.805 |
| 39.955774 | 0.882 |
| 39.975926 | 0.795 |
| 39.996991 | 0.823 |
| 40.015768 | 0.736 |
| 40.035523 | 0.639 |
| 40.055759 | 0.523 |
| 40.076014 | 0.794 |
| 40.097016 | 0.582 |
| 40.114906 | 0.514 |
| 40.135285 | 0.852 |
| 40.155576 | 1.084 |
| 40.175927 | 1.239 |
| 40.196719 | 1.365 |
| 40.214935 | 1.393 |
| 40.255278 | 1.644 |
| 40.276026 | 1.799 |
| 40.294964 | 1.857 |
| 40.315049 | 1.972 |
| 40.335812 | 2.098 |
| 40.355884 | 2.195 |
| 40.375913 | 2.33 |
| 40.39532 | 2.398 |
| 40.414946 | 2.281 |
| 40.435782 | 2.368 |
| 40.455523 | 2.379 |
| 40.475068 | 2.273 |
| 40.495079 | 2.196 |
| 40.514905 | 2.322 |
| 40.535778 | 2.505 |
| 40.554885 | 2.766 |
| 40.575924 | 3.152 |
| 40.595294 | 3.259 |
| 40.614867 | 3.153 |
| 40.635378 | 3.182 |
| 40.655523 | 3.25 |
| 40.67601 | 3.297 |
| 40.695792 | 3.626 |
| 40.714934 | 3.538 |
| 40.73618 | 3.268 |
| 40.75596 | 3.143 |
| 40.775915 | 2.902 |
| 40.796753 | 3.404 |
| 40.815108 | 3.598 |
| 40.835977 | 3.82 |
| 40.855761 | 3.657 |
| 40.876672 | 3.859 |
| 40.89534 | 3.917 |
| 40.9153 | 3.86 |
| 40.935764 | 3.898 |
| 40.956576 | 3.879 |
| 40.975929 | 3.878 |
| 40.995715 | 3.86 |
| 41.014897 | 3.541 |
| 41.035373 | 3.802 |
| 41.055938 | 3.831 |
| 41.075957 | 3.879 |
| 41.095546 | 4.082 |
| 41.117274 | 3.88 |
| 41.135794 | 3.86 |
| 41.155759 | 4.073 |
| 41.175912 | 4.382 |
| 41.19871 | 4.112 |
| 41.214988 | 4.16 |
| 41.235774 | 4.209 |
| 41.255821 | 4.113 |
| 41.276778 | 3.842 |
| 41.295036 | 4.045 |
| 41.315286 | 3.987 |
| 41.335871 | 4.045 |
| 41.377962 | 3.843 |
| 41.397643 | 3.737 |
| 41.415339 | 3.766 |
| 41.435179 | 3.737 |
| 41.455734 | 3.622 |
| 41.475918 | 3.487 |
| 41.496886 | 3.371 |
| 41.514896 | 3.226 |
| 41.535476 | 3.072 |
| 41.555877 | 2.966 |
| 41.575959 | 2.841 |
| 41.596151 | 2.87 |
| 41.615031 | 2.802 |
| 41.635554 | 2.677 |
| 41.655778 | 2.551 |
| 41.67506 | 2.455 |
| 41.696521 | 2.465 |
| 41.714953 | 2.242 |
| 41.735529 | 2.039 |
| 41.75518 | 2.049 |
| 41.775933 | 1.972 |
| 41.797095 | 1.924 |
| 41.814829 | 2.069 |
| 41.835215 | 2.175 |
| 41.855857 | 2.107 |
| 41.87528 | 2.059 |
| 41.896551 | 1.914 |
| 41.914995 | 1.721 |
| 41.935926 | 1.682 |
| 41.95594 | 1.46 |
| 41.975916 | 1.392 |
| 41.997096 | 1.305 |
| 42.015486 | 1.325 |
| 42.035837 | 0.958 |
| 42.055757 | 0.832 |
| 42.076592 | 0.765 |
| 42.096824 | 0.813 |
| 42.115242 | 0.774 |
| 42.135117 | 0.571 |
| 42.155864 | 0.426 |
| 42.176086 | 0.397 |
| 42.196961 | 0.387 |
| 42.21512 | 0.455 |
| 42.236153 | 0.474 |
| 42.255786 | 0.319 |
| 42.27593 | 0.213 |
| 42.298586 | -0.038 |
| 42.317339 | -0.135 |
| 42.335609 | -0.221 |
| 42.3558 | -0.086 |
| 42.375964 | -0.309 |
| 42.417096 | -0.599 |
| 42.435966 | -0.638 |
| 42.45588 | -0.57 |
| 42.475218 | -0.513 |
| 42.495458 | -0.59 |
| 42.515067 | -0.745 |
| 42.535766 | -0.744 |
| 42.555305 | -0.735 |
| 42.575921 | -0.668 |
| 42.595514 | -0.62 |
| 42.614968 | -0.755 |
| 42.635307 | -0.784 |
| 42.656129 | -0.909 |
| 42.675681 | -0.948 |
| 42.695136 | -0.813 |
| 42.715109 | -1.007 |
| 42.73589 | -1.007 |
| 42.755812 | -1.046 |
| 42.776015 | -1.056 |
| 42.795407 | -0.998 |
| 42.815034 | -0.93 |
| 42.835771 | -1.085 |
| 42.855766 | -1.018 |
| 42.875058 | -1.134 |
| 42.8952 | -1.076 |
| 42.915203 | -0.883 |
| 42.935694 | -0.845 |
| 42.955741 | -0.951 |
| 42.975001 | -1.058 |
| 42.995043 | -1.193 |
| 43.015034 | -1.135 |
| 43.035645 | -1.049 |
| 43.055982 | -1.165 |
| 43.075914 | -1.097 |
| 43.095266 | -1.04 |
| 43.1151 | -1.117 |
| 43.135814 | -1.233 |
| 43.15576 | -1.282 |
| 43.17557 | -1.195 |
| 43.196952 | -1.06 |
| 43.214923 | -1.011 |
| 43.235508 | -0.905 |
| 43.255754 | -0.934 |
| 43.276786 | -0.789 |
| 43.2974 | -0.789 |
| 43.315227 | -0.674 |
| 43.335855 | -0.693 |
| 43.355895 | -0.394 |
| 43.375903 | -0.326 |
| 43.396518 | -0.49 |
| 43.415124 | -0.5 |
| 43.43566 | -0.405 |
| 43.455414 | -0.318 |
| 43.475913 | -0.221 |
| 43.496923 | -0.038 |
| 43.535839 | 0.001 |
| 43.555665 | -0.009 |
| 43.576004 | 0.107 |
| 43.596346 | 0.126 |
| 43.615128 | 0.358 |
| 43.635885 | 0.493 |
| 43.655757 | 0.484 |
| 43.675067 | 0.696 |
| 43.696968 | 0.706 |
| 43.715296 | 0.793 |
| 43.735686 | 0.938 |
| 43.75522 | 1.131 |
| 43.775929 | 1.121 |
| 43.796834 | 1.141 |
| 43.815181 | 1.246 |
| 43.835008 | 1.604 |
| 43.855981 | 1.739 |
| 43.875964 | 1.816 |
| 43.897061 | 1.874 |
| 43.914918 | 1.913 |
| 43.93563 | 1.962 |
| 43.955822 | 2.097 |
| 43.97581 | 2.097 |
| 43.996598 | 2.194 |
| 44.014917 | 2.291 |
| 44.035537 | 2.378 |
| 44.05575 | 2.349 |
| 44.076461 | 2.533 |
| 44.097006 | 2.639 |
| 44.115003 | 2.59 |
| 44.135558 | 2.716 |
| 44.156392 | 2.822 |
| 44.175986 | 2.929 |
| 44.197022 | 3.112 |
| 44.214988 | 3.296 |
| 44.236231 | 3.586 |
| 44.255846 | 3.643 |
| 44.276038 | 3.818 |
| 44.299083 | 3.674 |
| 44.317757 | 3.654 |
| 44.33537 | 3.675 |
| 44.355775 | 3.79 |
| 44.375906 | 3.82 |
| 44.399191 | 4.003 |
| 44.414977 | 3.868 |
| 44.435618 | 3.781 |
| 44.455737 | 3.82 |
| 44.479263 | 4.052 |
| 44.497154 | 3.984 |
| 44.514904 | 4.129 |
| 44.535626 | 4.111 |
| 44.5561 | 4.053 |
| 44.575922 | 4.179 |
| 44.596888 | 4.149 |
| 44.615257 | 4.034 |
| 44.653292 | 4.131 |
| 44.676092 | 4.101 |
| 44.69523 | 4.054 |
| 44.715256 | 4.015 |
| 44.736142 | 3.91 |
| 44.755852 | 3.977 |
| 44.775937 | 4.142 |
| 44.795726 | 3.872 |
| 44.814899 | 3.911 |
| 44.835816 | 3.94 |
| 44.855763 | 3.784 |
| 44.875145 | 3.524 |
| 44.895447 | 3.33 |
| 44.915108 | 3.582 |
| 44.935763 | 3.872 |
| 44.955844 | 3.477 |
| 44.975922 | 3.69 |
| 44.994989 | 4.018 |
| 45.015138 | 4.23 |
| 45.035361 | 3.999 |
| 45.056007 | 3.622 |
| 45.075909 | 3.303 |
| 45.095422 | 3.101 |
| 45.116182 | 2.966 |
| 45.135959 | 2.869 |
| 45.155766 | 2.86 |
| 45.175985 | 2.783 |
| 45.196649 | 2.774 |
| 45.214907 | 2.745 |
| 45.23554 | 2.233 |
| 45.255754 | 2.107 |
| 45.276525 | 2.011 |
| 45.296845 | 1.827 |
| 45.315841 | 1.469 |
| 45.335259 | 1.411 |
| 45.355468 | 1.199 |
| 45.375911 | 1.286 |
| 45.396884 | 1.19 |
| 45.415208 | 1.257 |
| 45.43681 | 1.257 |
| 45.455874 | 1.016 |
| 45.475825 | 0.948 |
| 45.497476 | 0.88 |
| 45.516801 | 0.746 |
| 45.53587 | 0.62 |
| 45.555756 | 0.542 |
| 45.576006 | 0.532 |
| 45.59803 | 0.339 |
| 45.615218 | 0.194 |
| 45.635556 | 0.155 |
| 45.65587 | 0.039 |
| 45.675818 | 0.097 |
| 45.697373 | 0.185 |
| 45.714897 | 0.059 |
| 45.735683 | 0.03 |
| 45.777948 | -0.29 |
| 45.797776 | -0.493 |
| 45.815117 | -0.503 |
| 45.835555 | -0.599 |
| 45.855967 | -0.551 |
| 45.875971 | -0.831 |
| 45.897199 | -0.909 |
| 45.914966 | -0.88 |
| 45.936336 | -0.919 |
| 45.955414 | -0.958 |
| 45.97568 | -1.18 |
| 46.015232 | -1.19 |
| 46.035518 | -1.171 |
| 46.055745 | -1.132 |
| 46.075826 | -1.201 |
| 46.097076 | -1.355 |
| 46.115023 | -1.501 |
| 46.13578 | -1.423 |
| 46.15502 | -1.259 |
| 46.176009 | -1.269 |
| 46.196515 | -1.346 |
| 46.214987 | -1.443 |
| 46.235241 | -1.337 |
| 46.255849 | -1.376 |
| 46.276197 | -1.482 |
| 46.298196 | -1.212 |
| 46.316092 | -0.933 |
| 46.335861 | -0.952 |
| 46.355839 | -0.885 |
| 46.375912 | -1.126 |
| 46.399082 | -1.02 |
| 46.414879 | -1.087 |
| 46.435671 | -0.952 |
| 46.455751 | -1.079 |
| 46.476733 | -1.243 |
| 46.496563 | -1.223 |
| 46.515068 | -1.031 |
| 46.535174 | -0.944 |
| 46.55567 | -1.254 |
| 46.575925 | -1.475 |
| 46.596377 | -1.389 |
| 46.615006 | -1.051 |
| 46.635267 | -0.462 |
| 46.655957 | -0.357 |
| 46.675912 | -0.501 |
| 46.695432 | -0.395 |
| 46.715448 | -0.395 |
| 46.735732 | -0.26 |
| 46.755767 | -0.077 |
| 46.775885 | 0.136 |
| 46.818226 | -0.057 |
| 46.836111 | 0.029 |
| 46.855749 | 0.183 |
| 46.875061 | 0.213 |
| 46.895618 | 0.27 |
| 46.914977 | 0.154 |
| 46.935792 | 0.183 |
| 46.955401 | 0.165 |
| 46.975945 | 0.639 |
| 46.995122 | 1.179 |
| 47.015142 | 1.527 |
| 47.035105 | 1.353 |
| 47.056478 | 1.092 |
| 47.075905 | 1.315 |
| 47.095534 | 1.565 |
| 47.115139 | 1.594 |
| 47.135778 | 1.826 |
| 47.155788 | 1.894 |
| 47.175922 | 1.952 |
| 47.196481 | 2.03 |
| 47.214845 | 2.127 |
| 47.235568 | 2.513 |
| 47.255748 | 2.938 |
| 47.276139 | 3.354 |
| 47.296548 | 3.528 |
| 47.315102 | 3.431 |
| 47.335196 | 3.654 |
| 47.354872 | 3.944 |
| 47.375919 | 3.847 |
| 47.397038 | 3.624 |
| 47.414896 | 3.751 |
| 47.436969 | 3.963 |
| 47.455747 | 3.992 |
| 47.475942 | 4.069 |
| 47.49708 | 4.32 |
| 47.516229 | 4.707 |
| 47.53587 | 5.075 |
| 47.555761 | 5.191 |
| 47.576029 | 5.375 |
| 47.620241 | 5.24 |
| 47.635994 | 5.172 |
| 47.656091 | 5.423 |
| 47.695646 | 5.501 |
| 47.71514 | 5.366 |
| 47.735555 | 5.377 |
| 47.779205 | 5.396 |
| 47.795768 | 5.319 |
| 47.815304 | 5.261 |
| 47.836573 | 5.532 |
| 47.85582 | 5.58 |
| 47.875976 | 5.561 |
| 47.895092 | 5.687 |
| 47.937411 | 5.174 |
| 47.955926 | 5.532 |
| 47.975907 | 6.219 |
| 48.016888 | 6.258 |
| 48.035813 | 6.104 |
| 48.055744 | 6.153 |
| 48.098566 | 6.345 |
| 48.115355 | 5.901 |
| 48.135538 | 5.737 |
| 48.177546 | 5.601 |
| 48.196399 | 5.245 |
| 48.214894 | 5.081 |
| 48.235137 | 5.188 |
| 48.255915 | 5.342 |
| 48.275903 | 5.653 |
| 48.299814 | 5.537 |
| 48.317319 | 5.208 |
| 48.335991 | 4.619 |
| 48.355357 | 4.32 |
| 48.375903 | 4.272 |
| 48.397004 | 4.408 |
| 48.415098 | 4.301 |
| 48.435652 | 4.205 |
| 48.455746 | 3.799 |
| 48.4768 | 3.742 |
| 48.496945 | 3.819 |
| 48.514888 | 3.5 |
| 48.535351 | 3.258 |
| 48.555826 | 3.162 |
| 48.57611 | 3.21 |
| 48.597926 | 3.201 |
| 48.615108 | 3.104 |
| 48.635269 | 3.355 |
| 48.655923 | 3.317 |
| 48.675908 | 3.142 |
| 48.696988 | 2.737 |
| 48.71575 | 2.747 |
| 48.735717 | 2.969 |
| 48.75569 | 2.825 |
| 48.775394 | 2.544 |
| 48.796186 | 2.486 |
| 48.814959 | 2.332 |
| 48.835558 | 2.273 |
| 48.855945 | 2.021 |
| 48.877213 | 1.365 |
| 48.895608 | 1.326 |
| 48.915138 | 1.423 |
| 48.955851 | 1.509 |
| 48.976428 | 1.162 |
| 48.99521 | 0.833 |
| 49.014983 | 0.746 |
| 49.03585 | 0.524 |
| 49.077738 | 0.572 |
| 49.09639 | 0.581 |
| 49.115228 | 0.378 |
| 49.135157 | -0.008 |
| 49.15584 | -0.192 |
| 49.175901 | -0.221 |
| 49.196889 | 0.04 |
| 49.214939 | 0.011 |
| 49.235842 | -0.106 |
| 49.255544 | -0.318 |
| 49.275907 | -0.424 |
| 49.296889 | -0.299 |
| 49.315045 | -0.174 |
| 49.335581 | -0.204 |
| 49.355731 | -0.426 |
| 49.377281 | -0.706 |
| 49.396608 | -0.823 |
| 49.414972 | -0.775 |
| 49.435462 | -0.514 |
| 49.454964 | -0.93 |
| 49.476016 | -1.2 |
| 49.496979 | -0.959 |
| 49.514965 | -0.678 |
| 49.53569 | -0.757 |
| 49.555729 | -0.853 |
| 49.575847 | -0.931 |
| 49.597245 | -0.776 |
| 49.61547 | -0.641 |
| 49.637361 | -0.96 |
| 49.655861 | -1.25 |
| 49.675953 | -1.346 |
| 49.699915 | -1.048 |
| 49.715068 | -0.912 |
| 49.735808 | -0.517 |
| 49.755809 | -0.642 |
| 49.777343 | -0.536 |
| 49.796971 | -0.72 |
| 49.814901 | -0.855 |
| 49.835233 | -0.42 |
| 49.855789 | -0.112 |
| 49.875914 | 0.235 |
| 49.896523 | 0.303 |
| 49.91494 | 0.1 |
| 49.935396 | -0.026 |
| 49.955757 | 0.244 |
| 49.975904 | 0.437 |
| 49.996119 | 0.679 |
| 50.016854 | 0.92 |
| 50.036175 | 0.902 |
| 50.055749 | 1.017 |
| 50.075904 | 1.056 |
| 50.118307 | 1.335 |
| 50.13584 | 1.094 |
| 50.155771 | 1.277 |
| 50.175101 | 1.499 |
| 50.195015 | 1.788 |
| 50.215015 | 1.808 |
| 50.23581 | 1.865 |
| 50.25514 | 1.905 |
| 50.275919 | 2.281 |
| 50.295155 | 2.485 |
| 50.315407 | 2.659 |
| 50.334989 | 2.686 |
| 50.355982 | 2.726 |
| 50.375893 | 3.121 |
| 50.394958 | 3.296 |
| 50.41494 | 3.238 |
| 50.435973 | 3.199 |
| 50.455768 | 3.625 |
| 50.475899 | 4.243 |
| 50.496777 | 4.329 |
| 50.51485 | 4.302 |
| 50.53559 | 4.446 |
| 50.555816 | 4.619 |
| 50.576604 | 4.861 |
| 50.596338 | 4.889 |
| 50.615179 | 4.89 |
| 50.635544 | 5.141 |
| 50.656265 | 5.112 |
| 50.675404 | 5.296 |
| 50.697065 | 5.576 |
| 50.714894 | 5.645 |
| 50.737699 | 5.47 |
| 50.755681 | 5.704 |
| 50.776014 | 5.713 |
| 50.799517 | 5.723 |
| 50.818373 | 5.472 |
| 50.835975 | 5.434 |
| 50.855791 | 5.472 |
| 50.876123 | 5.898 |
| 50.899211 | 6.227 |
| 50.915385 | 6.082 |
| 50.935495 | 6.334 |
| 50.95586 | 6.43 |
| 51.001251 | 6.112 |
| 51.014843 | 6.122 |
| 51.035745 | 6.249 |
| 51.057013 | 6.394 |
| 51.076249 | 6.414 |
| 51.09739 | 6.307 |
| 51.115651 | 6.365 |
| 51.136403 | 5.968 |
| 51.155975 | 6.065 |
| 51.175949 | 6.018 |
| 51.197147 | 6.375 |
| 51.236176 | 6.133 |
| 51.255901 | 6.298 |
| 51.275905 | 6.375 |
| 51.297075 | 6.221 |
| 51.31503 | 6.212 |
| 51.335558 | 6.125 |
| 51.35554 | 6.203 |
| 51.378743 | 5.788 |
| 51.397379 | 5.701 |
| 51.415106 | 5.73 |
| 51.435561 | 5.509 |
| 51.454927 | 5.267 |
| 51.475802 | 5.16 |
| 51.496877 | 4.851 |
| 51.515098 | 5.064 |
| 51.535055 | 4.843 |
| 51.556063 | 4.94 |
| 51.575928 | 4.843 |
| 51.598932 | 4.35 |
| 51.617634 | 3.906 |
| 51.63649 | 3.761 |
| 51.65694 | 4.051 |
| 51.675964 | 3.984 |
| 51.698197 | 3.501 |
| 51.716105 | 3.336 |
| 51.735631 | 3.25 |
| 51.755771 | 3.182 |
| 51.777508 | 2.883 |
| 51.79664 | 2.989 |
| 51.815355 | 2.757 |
| 51.835377 | 3.086 |
| 51.856374 | 2.71 |
| 51.876004 | 2.584 |
| 51.895516 | 2.381 |
| 51.915103 | 1.926 |
| 51.937215 | 1.974 |
| 51.955984 | 1.82 |
| 51.975947 | 1.733 |
| 51.996632 | 1.703 |
| 52.017053 | 1.346 |
| 52.035753 | 1.288 |
| 52.055755 | 1.269 |
| 52.075882 | 1.065 |
| 52.098069 | 0.988 |
| 52.114885 | 1.037 |
| 52.135804 | 0.94 |
| 52.155745 | 0.755 |
| 52.178454 | 0.399 |
| 52.195024 | 0.254 |
| 52.214983 | 0.262 |
| 52.235744 | 0.04 |
| 52.2595 | 0.117 |
| 52.275918 | -0.038 |
| 52.295298 | -0.318 |
| 52.314933 | -0.434 |
| 52.358841 | -0.502 |
| 52.375714 | -0.773 |
| 52.39497 | -0.802 |
| 52.41496 | -0.881 |
| 52.435986 | -0.746 |
| 52.455813 | -0.678 |
| 52.476231 | -0.89 |
| 52.497244 | -0.89 |
| 52.5149 | -0.957 |
| 52.535533 | -0.91 |
| 52.555732 | -1.045 |
| 52.578184 | -0.891 |
| 52.59696 | -0.959 |
| 52.615075 | -1.017 |
| 52.635304 | -1.153 |
| 52.656132 | -1.357 |
| 52.675901 | -1.058 |
| 52.697251 | -1.068 |
| 52.714892 | -0.952 |
| 52.737297 | -1.145 |
| 52.755696 | -0.788 |
| 52.775891 | -0.836 |
| 52.798756 | -0.354 |
| 52.818394 | 0.12 |
| 52.835613 | 0.198 |
| 52.855844 | 0.304 |
| 52.875899 | -0.054 |
| 52.899416 | -0.21 |
| 52.914875 | 0.117 |
| 52.935488 | 0.195 |
| 52.955841 | 0.417 |
| 52.980879 | 0.068 |
| 52.99511 | 0.108 |
| 53.015126 | 0.504 |
| 53.035715 | 0.716 |
| 53.058402 | 0.524 |
| 53.0759 | 0.572 |
| 53.095572 | 0.881 |
| 53.114965 | 1.286 |
| 53.136508 | 1.19 |
| 53.155926 | 1.392 |
| 53.175894 | 1.152 |
| 53.194865 | 0.987 |
| 53.217396 | 1.065 |
| 53.235904 | 1.596 |
| 53.255747 | 2.309 |
| 53.275892 | 2.03 |
| 53.301639 | 2.638 |
| 53.315184 | 2.86 |
| 53.335535 | 2.967 |
| 53.355726 | 3.111 |
| 53.398405 | 4.068 |
| 53.415117 | 4.223 |
| 53.435739 | 4.532 |
| 53.456057 | 4.696 |
| 53.476186 | 4.735 |
| 53.495975 | 4.725 |
| 53.51494 | 4.667 |
| 53.53763 | 4.83 |
| 53.555685 | 4.947 |
| 53.575883 | 5.083 |
| 53.5977 | 4.996 |
| 53.618021 | 5.152 |
| 53.635734 | 5.324 |
| 53.655221 | 5.538 |
| 53.675378 | 5.896 |
| 53.714136 | 5.684 |
| 53.735909 | 5.876 |
| 53.755812 | 5.77 |
| 53.793584 | 5.925 |
| 53.81517 | 6.033 |
| 53.835485 | 6.042 |
| 53.872471 | 6.141 |
| 53.895836 | 6.025 |
| 53.914826 | 6.198 |
| 53.952776 | 6.43 |
| 53.954893 | 6.662 |
| 53.975818 | 6.614 |
| 53.994872 | 6.78 |
| 54.032638 | 6.828 |
| 54.03498 | 6.645 |
| 54.05576 | 6.703 |
| 54.075903 | 6.896 |
| 54.113653 | 6.288 |
| 54.135744 | 6.056 |
| 54.155626 | 6.299 |
| 54.174971 | 6.318 |
| 54.195137 | 6.145 |
| 54.214901 | 6.164 |
| 54.235764 | 5.883 |
| 54.259598 | 5.846 |
| 54.275965 | 5.749 |
| 54.295504 | 5.799 |
| 54.314892 | 5.558 |
| 54.337555 | 5.539 |
| 54.35591 | 5.124 |
| 54.375888 | 4.244 |
| 54.395205 | 4.361 |
| 54.418774 | 4.244 |
| 54.435949 | 4.496 |
| 54.455732 | 4.178 |
| 54.475893 | 4.217 |
| 54.520966 | 3.714 |
| 54.536065 | 3.656 |
| 54.555897 | 3.55 |
| 54.575146 | 3.155 |
| 54.594875 | 3.01 |
| 54.615307 | 3.348 |
| 54.635749 | 3.107 |
| 54.656471 | 3.087 |
| 54.675895 | 3.009 |
| 54.695623 | 2.787 |
| 54.715451 | 2.449 |
| 54.735026 | 2.054 |
| 54.755834 | 2.13 |
| 54.776081 | 1.909 |
| 54.796593 | 1.744 |
| 54.815109 | 1.242 |
| 54.835784 | 1.126 |
| 54.855828 | 0.99 |
| 54.875366 | 0.933 |
| 54.896787 | 0.604 |
| 54.915239 | 0.411 |
| 54.935906 | 0.305 |
| 54.955769 | 0.266 |
| 54.976366 | -0.44 |
| 54.997204 | -0.208 |
| 55.01582 | -0.228 |
| 55.035408 | -0.19 |
| 55.056632 | -0.365 |
| 55.07549 | -0.558 |
| 55.096878 | -0.741 |
| 55.114828 | -0.954 |
| 55.135494 | -0.906 |
| 55.155891 | -0.616 |
| 55.175902 | -0.771 |
| 55.196599 | -0.984 |
| 55.21699 | -1.197 |
| 55.236025 | -1.178 |
| 55.255817 | -1.197 |
| 55.275888 | -1.217 |
| 55.2997 | -1.585 |
| 55.315964 | -1.634 |
| 55.335509 | -1.827 |
| 55.355731 | -1.721 |
| 55.380746 | -1.924 |
| 55.395749 | -2.128 |
| 55.414898 | -2.012 |
| 55.435801 | -1.868 |
| 55.459812 | -1.704 |
| 55.475912 | -1.375 |
| 55.494966 | -1.298 |
| 55.514893 | -1.289 |
| 55.538436 | -1.666 |
| 55.556269 | -1.608 |
| 55.575884 | -1.28 |
| 55.595339 | -0.983 |
| 55.6384 | -1.186 |
| 55.655503 | -0.945 |
| 55.676013 | -0.606 |
| 55.696813 | -0.501 |
| 55.715232 | -0.656 |
| 55.735467 | -1.149 |
| 55.755727 | -0.589 |
| 55.776575 | -0.356 |
| 55.796515 | -0.424 |
| 55.81491 | -0.511 |
| 55.83539 | -0.31 |
| 55.855963 | -0.117 |
| 55.875898 | 0.347 |
| 55.895347 | 0.25 |
| 55.915085 | 0.365 |
| 55.935121 | 0.618 |
| 55.955837 | 1.304 |
| 55.97603 | 1.382 |
| 55.997148 | 1.777 |
| 56.015739 | 2.058 |
| 56.036053 | 2.319 |
| 56.055837 | 2.396 |
| 56.07582 | 2.473 |
| 56.096354 | 2.405 |
| 56.114982 | 2.076 |
| 56.135553 | 1.988 |
| 56.154838 | 2.152 |
| 56.175687 | 2.559 |
| 56.197484 | 3.081 |
| 56.214961 | 3.284 |
| 56.235455 | 3.371 |
| 56.257345 | 3.68 |
| 56.276109 | 3.923 |
| 56.297329 | 4.55 |
| 56.314938 | 4.597 |
| 56.335825 | 4.782 |
| 56.35631 | 5.053 |
| 56.375903 | 5.062 |
| 56.398281 | 4.792 |
| 56.441279 | 5.44 |
| 56.4558 | 5.536 |
| 56.475089 | 5.635 |
| 56.499543 | 5.731 |
| 56.51552 | 5.665 |
| 56.535322 | 5.819 |
| 56.555718 | 6.176 |
| 56.580368 | 6.534 |
| 56.595156 | 6.708 |
| 56.615159 | 6.784 |
| 56.63542 | 6.766 |
| 56.681102 | 7.366 |
| 56.694918 | 7.453 |
| 56.715192 | 7.357 |
| 56.759004 | 6.981 |
| 56.775901 | 6.991 |
| 56.795305 | 7.282 |
| 56.815094 | 7.253 |
| 56.835727 | 7.167 |
| 56.856557 | 6.811 |
| 56.875884 | 6.647 |
| 56.896776 | 6.714 |
| 56.915233 | 6.937 |
| 56.935492 | 6.85 |
| 56.955718 | 6.657 |
| 56.976455 | 6.222 |
| 56.996699 | 6.251 |
| 57.014898 | 6.435 |
| 57.035244 | 6.193 |
| 57.05491 | 6.319 |
| 57.075894 | 6.483 |
| 57.096567 | 6.58 |
| 57.11489 | 6.64 |
| 57.136921 | 6.495 |
| 57.15583 | 6.679 |
| 57.175894 | 6.342 |
| 57.195532 | 5.608 |
| 57.215019 | 5.106 |
| 57.235455 | 4.778 |
| 57.255724 | 4.652 |
| 57.275882 | 4.362 |
| 57.298682 | 4.383 |
| 57.31504 | 4.161 |
| 57.33554 | 3.725 |
| 57.355724 | 3.493 |
| 57.379746 | 3.639 |
| 57.397408 | 3.396 |
| 57.415155 | 3.687 |
| 57.435543 | 3.783 |
| 57.457211 | 3.463 |
| 57.475583 | 3.533 |
| 57.496471 | 3.349 |
| 57.515094 | 3.079 |
| 57.536796 | 2.752 |
| 57.555819 | 2.624 |
| 57.575885 | 2.082 |
| 57.598828 | 1.708 |
| 57.619642 | 1.058 |
| 57.63678 | 0.614 |
| 57.655722 | 0.354 |
| 57.67555 | 0.082 |
| 57.700285 | 0.063 |
| 57.715366 | 0.18 |
| 57.735499 | 0.313 |
| 57.755765 | 0.4 |
| 57.801532 | -0.227 |
| 57.814914 | -0.161 |
| 57.835795 | -0.199 |
| 57.85567 | -0.199 |
| 57.875934 | -0.751 |
| 57.897752 | -0.771 |
| 57.915006 | -0.723 |
| 57.936132 | -0.819 |
| 57.955943 | -1.032 |
| 57.975884 | -1.129 |
| 57.997357 | -1.072 |
| 58.016348 | -1.093 |
| 58.035633 | -1.053 |
| 58.055732 | -1.034 |
| 58.075981 | -1.248 |
| 58.09713 | -1.045 |
| 58.115019 | -1.162 |
| 58.135818 | -1.568 |
| 58.155736 | -1.423 |
| 58.175613 | -1.25 |
| 58.19653 | -1.52 |
| 58.214899 | -1.375 |
| 58.235574 | -1.56 |
| 58.255279 | -1.387 |
| 58.2759 | -1.406 |
| 58.297409 | -1.415 |
| 58.314823 | -1.618 |
| 58.335934 | -1.706 |
| 58.355799 | -1.678 |
| 58.375898 | -1.369 |
| 58.396821 | -1.31 |
| 58.419306 | -1.321 |
| 58.43557 | -1.166 |
| 58.45584 | -0.636 |
| 58.475882 | -0.434 |
| 58.500277 | 0.155 |
| 58.515493 | 0.3 |
| 58.535529 | 0.338 |
| 58.555705 | 0.638 |
| 58.580022 | 1.051 |
| 58.596113 | 0.945 |
| 58.614902 | 0.326 |
| 58.635718 | 0.356 |
| 58.660076 | 0.588 |
| 58.676025 | 0.936 |
| 58.695306 | 1.564 |
| 58.715098 | 1.767 |
| 58.739116 | 1.102 |
| 58.756043 | 0.619 |
| 58.775873 | 0.695 |
| 58.795061 | 1.293 |
| 58.818522 | 1.998 |
| 58.835774 | 2.076 |
| 58.8559 | 2.086 |
| 58.875887 | 2.395 |
| 58.921149 | 3.931 |
| 58.935756 | 3.989 |
| 58.955741 | 3.554 |
| 58.975264 | 3.7 |
| 58.995496 | 3.564 |
| 59.015387 | 3.661 |
| 59.035816 | 3.961 |
| 59.081341 | 4.154 |
| 59.094978 | 4.193 |
| 59.11574 | 4.445 |
| 59.157327 | 4.686 |
| 59.175931 | 4.967 |
| 59.195541 | 5.499 |
| 59.215662 | 5.846 |
| 59.23591 | 5.972 |
| 59.255714 | 6.495 |
| 59.276041 | 6.67 |
| 59.295824 | 6.552 |
| 59.315202 | 6.591 |
| 59.335558 | 6.429 |
| 59.355742 | 6.565 |
| 59.39984 | 6.374 |
| 59.415279 | 6.334 |
| 59.435489 | 6.442 |
| 59.480199 | 6.277 |
| 59.495961 | 6.173 |
| 59.515206 | 6.298 |
| 59.535722 | 6.597 |
| 59.55597 | 6.416 |
| 59.575882 | 6.309 |
| 59.595528 | 6.426 |
| 59.617349 | 6.445 |
| 59.636399 | 6.512 |
| 59.655711 | 5.567 |
| 59.67588 | 5.995 |
| 59.699962 | 6.631 |
| 59.715184 | 6.593 |
| 59.735478 | 5.985 |
| 59.755783 | 4.748 |
| 59.778188 | 4.188 |
| 59.795388 | 4.536 |
| 59.81511 | 4.942 |
| 59.835765 | 4.96 |
| 59.859681 | 4.681 |
| 59.875898 | 4.528 |
| 59.895165 | 4.14 |
| 59.914878 | 3.774 |
| 59.936904 | 3.863 |
| 59.955814 | 3.804 |
| 59.976489 | 3.728 |
| 59.995292 | 3.661 |
| 60.039831 | 2.46 |
| 60.055955 | 2.374 |
| 60.075681 | 2.615 |
| 60.097882 | 2.442 |
| 60.115521 | 2.374 |
| 60.135576 | 2.2 |
| 60.155723 | 1.765 |
| 60.176977 | 0.836 |
| 60.197362 | 0.47 |
| 60.215159 | 0.595 |
| 60.23615 | 0.538 |
| 60.256267 | 0.539 |
| 60.275453 | 0.799 |
| 60.297037 | 0.402 |
| 60.315867 | -0.013 |
| 60.336819 | -0.332 |
| 60.356053 | -0.469 |
| 60.376073 | -0.382 |
| 60.396695 | -0.487 |
| 60.417168 | -0.448 |
| 60.43566 | -0.479 |
| 60.45571 | -0.604 |
| 60.47588 | -0.488 |
| 60.499622 | -0.854 |
| 60.514962 | -0.913 |
| 60.535934 | -1 |
| 60.555602 | -1.331 |
| 60.577817 | -1.293 |
| 60.595256 | -1.516 |
| 60.615088 | -1.631 |
| 60.6358 | -1.719 |
| 60.659277 | -1.468 |
| 60.675443 | -1.844 |
| 60.69571 | -2.135 |
| 60.715011 | -2.068 |
| 60.738441 | -2.225 |
| 60.756362 | -2.292 |
| 60.775872 | -1.936 |
| 60.795598 | -2.139 |
| 60.81762 | -2.177 |
| 60.835806 | -2.207 |
| 60.855764 | -2.265 |
| 60.875995 | -1.888 |
| 60.901055 | -1.523 |
| 60.91507 | -1.551 |
| 60.935524 | -1.127 |
| 60.955855 | -0.818 |
| 60.981771 | -1.293 |
| 60.995532 | -1.428 |
| 61.015375 | -1.138 |
| 61.035708 | -1.458 |
| 61.061693 | -0.424 |
| 61.075883 | -0.54 |
| 61.095273 | -0.81 |
| 61.115118 | -0.579 |
| 61.15845 | 0.541 |
| 61.176065 | 0.725 |
| 61.195386 | 0.598 |
| 61.219523 | 0.27 |
| 61.236048 | 0.938 |
| 61.255713 | 1.72 |
| 61.275907 | 2.531 |
| 61.298746 | 3.062 |
| 61.314986 | 3.022 |
| 61.335508 | 2.936 |
| 61.375881 | 2.926 |
| 61.399351 | 2.801 |
| 61.414938 | 2.879 |
| 61.43559 | 3.642 |
| 61.455765 | 4.065 |
| 61.478822 | 4.278 |
| 61.497225 | 4.346 |
| 61.514864 | 4.616 |
| 61.535526 | 4.616 |
| 61.557094 | 5.147 |
| 61.576097 | 5.37 |
| 61.597101 | 5.477 |
| 61.614797 | 5.631 |
| 61.636976 | 5.932 |
| 61.656042 | 6.464 |
| 61.675894 | 6.665 |
| 61.696819 | 6.27 |
| 61.719097 | 6.328 |
| 61.735884 | 6.686 |
| 61.755798 | 6.549 |
| 61.775521 | 6.686 |
| 61.801542 | 7.131 |
| 61.816329 | 7.662 |
| 61.835526 | 7.721 |
| 61.855708 | 8.292 |
| 61.903015 | 9.112 |
| 61.915017 | 9.259 |
| 61.935467 | 9.153 |
| 61.98404 | 8.332 |
| 61.995039 | 8.189 |
| 62.014982 | 8.527 |
| 62.039315 | 8.71 |
| 62.05576 | 8.954 |
| 62.076042 | 9.215 |
| 62.095199 | 9.118 |
| 62.122017 | 8.694 |
| 62.135813 | 8.578 |
| 62.155837 | 8.587 |
| 62.176224 | 8.732 |
| 62.220865 | 9.836 |
| 62.236654 | 9.593 |
| 62.255094 | 9.961 |
| 62.299011 | 8.842 |
| 62.316139 | 9.007 |
| 62.335657 | 9.044 |
| 62.356483 | 8.949 |
| 62.375947 | 8.631 |
| 62.39749 | 7.366 |
| 62.414891 | 7.152 |
| 62.435517 | 7.365 |
| 62.455802 | 7.231 |
| 62.475994 | 6.961 |
| 62.497085 | 6.421 |
| 62.516527 | 6.036 |
| 62.535704 | 5.813 |
| 62.55567 | 5.514 |
| 62.574964 | 5.225 |
| 62.598391 | 4.8 |
| 62.614842 | 5.012 |
| 62.635497 | 4.878 |
| 62.655738 | 5.003 |
| 62.680998 | 4.393 |
| 62.697433 | 4.105 |
| 62.715122 | 3.968 |
| 62.735438 | 3.726 |
| 62.757912 | 3.612 |
| 62.77589 | 3.603 |
| 62.796905 | 3.118 |
| 62.814975 | 2.597 |
| 62.837176 | 2.269 |
| 62.85548 | 1.91 |
| 62.875875 | 1.668 |
| 62.898667 | 1.378 |
| 62.920596 | 1.62 |
| 62.935554 | 1.205 |
| 62.955705 | 1.165 |
| 62.975944 | 1.136 |
| 63.000975 | 0.634 |
| 63.015183 | 0.536 |
| 63.035421 | 0.168 |
| 63.055704 | -0.199 |
| 63.081288 | -0.412 |
| 63.095248 | -0.383 |
| 63.115 | -0.315 |
| 63.135712 | -0.364 |
| 63.16185 | -0.626 |
| 63.175882 | -0.886 |
| 63.194932 | -1.138 |
| 63.215406 | -1.167 |
| 63.238565 | -1.013 |
| 63.255751 | -1.043 |
| 63.275875 | -1.121 |
| 63.295969 | -1.314 |
| 63.341001 | -1.209 |
| 63.355865 | -1.383 |
| 63.376031 | -1.781 |
| 63.398488 | -1.705 |
| 63.415276 | -1.511 |
| 63.435422 | -1.27 |
| 63.455797 | -1.047 |
| 63.476198 | -1.019 |
| 63.496644 | -1.116 |
| 63.515415 | -1.117 |
| 63.53512 | -1.272 |
| 63.555504 | -0.074 |
| 63.57527 | 0.079 |
| 63.596808 | 0.098 |
| 63.615369 | -0.25 |
| 63.636311 | 0.059 |
| 63.655838 | 0.522 |
| 63.67587 | 1.033 |
| 63.696641 | 1.284 |
| 63.717297 | 1.12 |
| 63.735796 | 1.235 |
| 63.755609 | 1.39 |
| 63.775875 | 2.009 |
| 63.800465 | 2.54 |
| 63.81496 | 2.442 |
| 63.835544 | 2.288 |
| 63.855824 | 2.365 |
| 63.881334 | 2.636 |
| 63.895675 | 2.771 |
| 63.914789 | 3.041 |
| 63.935718 | 3.234 |
| 63.959997 | 3.514 |
| 63.975892 | 3.493 |
| 63.994984 | 3.968 |
| 64.015554 | 4.808 |
| 64.036932 | 5.387 |
| 64.055885 | 5.378 |
| 64.076049 | 5.883 |
| 64.095198 | 5.959 |
| 64.119713 | 6.189 |
| 64.135798 | 6.616 |
| 64.155721 | 7.197 |
| 64.175863 | 7.388 |
| 64.20171 | 7.283 |
| 64.214987 | 7.506 |
| 64.235566 | 7.283 |
| 64.255783 | 7.409 |
| 64.281564 | 7.691 |
| 64.295099 | 7.951 |
| 64.314925 | 7.66 |
| 64.33577 | 7.759 |
| 64.362984 | 7.992 |
| 64.375873 | 8.184 |
| 64.394994 | 8.32 |
| 64.415027 | 8.659 |
| 64.459499 | 8.988 |
| 64.476228 | 9.511 |
| 64.495146 | 9.462 |
| 64.515608 | 9.539 |
| 64.535788 | 9.134 |
| 64.555718 | 8.962 |
| 64.57587 | 9.271 |
| 64.597945 | 9.676 |
| 64.614959 | 9.474 |
| 64.635501 | 9.196 |
| 64.655711 | 9.081 |
| 64.679074 | 8.955 |
| 64.696796 | 8.656 |
| 64.715029 | 8.763 |
| 64.735513 | 9.168 |
| 64.757468 | 9.13 |
| 64.775886 | 9.123 |
| 64.797517 | 9.16 |
| 64.814849 | 9.046 |
| 64.836489 | 8.197 |
| 64.855766 | 8.138 |
| 64.875869 | 8.401 |
| 64.898608 | 8.17 |
| 64.919526 | 7.184 |
| 64.936381 | 6.885 |
| 64.95571 | 6.885 |
| 64.975865 | 6.674 |
| 65.000479 | 6.46 |
| 65.015413 | 5.986 |
| 65.035468 | 5.765 |
| 65.055364 | 5.167 |
| 65.080315 | 4.615 |
| 65.094929 | 4.567 |
| 65.115187 | 4.538 |
| 65.135767 | 4.308 |
| 65.160665 | 4.5 |
| 65.175874 | 4.769 |
| 65.195397 | 4.644 |
| 65.215025 | 4.075 |
| 65.23819 | 3.532 |
| 65.255824 | 3.204 |
| 65.275884 | 3.071 |
| 65.295074 | 2.808 |
| 65.32082 | 2.508 |
| 65.33594 | 2.181 |
| 65.35571 | 1.793 |
| 65.376211 | 1.252 |
| 65.403142 | 0.885 |
| 65.415029 | 0.808 |
| 65.43548 | 0.41 |
| 65.455829 | 0.091 |
| 65.500534 | 0.052 |
| 65.514876 | -0.461 |
| 65.535537 | -0.414 |
| 65.554825 | -0.655 |
| 65.576059 | -0.82 |
| 65.597003 | -1.147 |
| 65.635563 | -1.051 |
| 65.656998 | -1.11 |
| 65.675928 | -0.927 |
| 65.696714 | -0.878 |
| 65.714968 | -0.965 |
| 65.735436 | -0.976 |
| 65.755879 | -1.121 |
| 65.775573 | -1.181 |
| 65.795553 | -1.307 |
| 65.815094 | -1.781 |
| 65.835979 | -1.965 |
| 65.855699 | -1.705 |
| 65.875871 | -1.349 |
| 65.899366 | -1.262 |
| 65.915004 | -1.426 |
| 65.93541 | -1.581 |
| 65.955708 | -1.379 |
| 65.9798 | -1.389 |
| 65.995262 | -1.225 |
| 66.015346 | -0.944 |
| 66.035677 | -0.82 |
| 66.059172 | -0.772 |
| 66.076036 | -0.386 |
| 66.095049 | 0.134 |
| 66.115904 | 0.133 |
| 66.137182 | -0.022 |
| 66.155804 | -0.061 |
| 66.175861 | 1.071 |
| 66.195264 | 1.639 |
| 66.218472 | 1.523 |
| 66.235809 | 1.657 |
| 66.255697 | 2.112 |
| 66.275903 | 2.759 |
| 66.301181 | 2.719 |
| 66.315848 | 2.073 |
| 66.335547 | 2.304 |
| 66.355815 | 2.256 |
| 66.380445 | 3.744 |
| 66.39558 | 4.178 |
| 66.414899 | 4.604 |
| 66.435706 | 4.353 |
| 66.4609 | 4.296 |
| 66.475637 | 4.47 |
| 66.495055 | 4.73 |
| 66.515899 | 4.461 |
| 66.538586 | 4.549 |
| 66.555834 | 4.559 |
| 66.576185 | 5.187 |
| 66.595197 | 6.027 |
| 66.639677 | 7.787 |
| 66.655932 | 7.544 |
| 66.675878 | 7.806 |
| 66.6977 | 7.892 |
| 66.715001 | 7.679 |
| 66.735463 | 7.932 |
| 66.75576 | 8.038 |
| 66.775715 | 8.222 |
| 66.796885 | 8.62 |
| 66.815136 | 8.726 |
| 66.835359 | 8.57 |
| 66.879365 | 9.288 |
| 66.896246 | 9.288 |
| 66.915059 | 8.786 |
| 66.938194 | 8.932 |
| 66.955812 | 8.72 |
| 66.975961 | 8.634 |
| 66.996577 | 8.915 |
| 67.017084 | 8.935 |
| 67.035503 | 8.664 |
| 67.055701 | 8.54 |
| 67.075864 | 8.368 |
| 67.100716 | 8.618 |
| 67.115947 | 8.436 |
| 67.135442 | 8.456 |
| 67.155697 | 8.813 |
| 67.19949 | 8.456 |
| 67.214848 | 8.562 |
| 67.235344 | 8.622 |
| 67.257604 | 8.555 |
| 67.275913 | 8.961 |
| 67.298027 | 8.372 |
| 67.314998 | 7.282 |
| 67.33821 | 6.143 |
| 67.355478 | 6.401 |
| 67.375917 | 5.901 |
| 67.398285 | 5.717 |
| 67.419007 | 5.129 |
| 67.435363 | 5.178 |
| 67.455629 | 5.226 |
| 67.475969 | 5.178 |
| 67.501079 | 5.071 |
| 67.514845 | 4.878 |
| 67.53557 | 4.202 |
| 67.555855 | 3.633 |
| 67.58005 | 3.421 |
| 67.595215 | 3.237 |
| 67.61492 | 3.236 |
| 67.635718 | 3.013 |
| 67.660076 | 2.723 |
| 67.675879 | 2.521 |
| 67.695122 | 1.99 |
| 67.714836 | 1.835 |
| 67.758729 | -0.233 |
| 67.775871 | -0.408 |
| 67.795118 | -0.292 |
| 67.815622 | -0.234 |
| 67.835937 | -0.458 |
| 67.855699 | -0.941 |
| 67.87586 | -1.009 |
| 67.89761 | -0.931 |
| 67.915011 | -0.971 |
| 67.935597 | -1.494 |
| 67.95565 | -1.929 |
| 67.97907 | -2.229 |
| 67.997765 | -2.471 |
| 68.015123 | -2.385 |
| 68.035481 | -2.229 |
| 68.056498 | -2.414 |
| 68.075931 | -2.163 |
| 68.097278 | -1.971 |
| 68.115064 | -1.807 |
| 68.135898 | -1.875 |
| 68.156231 | -1.972 |
| 68.175864 | -1.981 |
| 68.199094 | -1.956 |
| 68.219427 | -2.032 |
| 68.235453 | -1.558 |
| 68.255744 | -1.395 |
| 68.275867 | -1.84 |
| 68.300061 | -2.14 |
| 68.315117 | -2.364 |
| 68.335605 | -2.383 |
| 68.355719 | -2.431 |
| 68.380929 | -2.085 |
| 68.395743 | -2.171 |
| 68.414847 | -2.008 |
| 68.435743 | -1.738 |
| 68.459358 | -1.12 |
| 68.475594 | -0.638 |
| 68.494818 | -0.281 |
| 68.514906 | -0.205 |
| 68.538022 | -0.64 |
| 68.555978 | -0.301 |
| 68.575938 | 0.598 |
| 68.595998 | 1.427 |
| 68.619908 | 1.929 |
| 68.635917 | 1.948 |
| 68.655798 | 2.065 |
| 68.67587 | 2.461 |
| 68.699443 | 3.059 |
| 68.715442 | 2.971 |
| 68.735578 | 2.701 |
| 68.755707 | 3.001 |
| 68.779949 | 2.69 |
| 68.795281 | 2.767 |
| 68.814893 | 3.763 |
| 68.835704 | 3.753 |
| 68.880534 | 3.988 |
| 68.895291 | 4.257 |
| 68.914942 | 4.122 |
| 68.935318 | 4.259 |
| 68.955727 | 4.868 |
| 68.975865 | 5.021 |
| 68.99494 | 5.109 |
| 69.017209 | 5.446 |
| 69.036258 | 5.573 |
| 69.055699 | 6.49 |
| 69.075931 | 7.36 |
| 69.098317 | 7.177 |
| 69.115626 | 7.226 |
| 69.135538 | 7.042 |
| 69.155759 | 8.569 |
| 69.179147 | 9.167 |
| 69.196773 | 9.255 |
| 69.214892 | 8.947 |
| 69.23542 | 8.64 |
| 69.257237 | 9.035 |
| 69.275867 | 9.8 |
| 69.297438 | 9.723 |
| 69.315075 | 9.868 |
| 69.338693 | 8.642 |
| 69.355614 | 8.382 |
| 69.375912 | 8.335 |
| 69.396909 | 8.567 |
| 69.418124 | 8.605 |
| 69.435604 | 8.587 |
| 69.455719 | 8.618 |
| 69.475953 | 8.763 |
| 69.500323 | 8.232 |
| 69.514992 | 8.744 |
| 69.53552 | 9.112 |
| 69.555185 | 9.506 |
| 69.578271 | 9.625 |
| 69.595197 | 9.616 |
| 69.615014 | 8.919 |
| 69.635878 | 9.035 |
| 69.658983 | 8.583 |
| 69.675932 | 8.391 |
| 69.695185 | 7.715 |
| 69.715663 | 6.954 |
| 69.738189 | 6.316 |
| 69.755793 | 6.355 |
| 69.776065 | 6.548 |
| 69.794779 | 6.509 |
| 69.818932 | 5.958 |
| 69.835774 | 5.64 |
| 69.855717 | 5.63 |
| 69.875862 | 5.64 |
| 69.922154 | 4.49 |
| 69.936061 | 3.93 |
| 69.955773 | 3.737 |
| 69.976246 | 3.274 |
| 69.995114 | 3.235 |
| 70.015044 | 2.916 |
| 70.035722 | 2.676 |
| 70.057627 | 2.105 |
| 70.076416 | 2.085 |
| 70.095887 | 2.094 |
| 70.115085 | 1.825 |
| 70.136048 | 0.955 |
| 70.156041 | 0.625 |
| 70.175855 | -0.148 |
| 70.195445 | -0.177 |
| 70.215655 | -0.042 |
| 70.235622 | -0.111 |
| 70.255689 | -0.507 |
| 70.275851 | -0.729 |
| 70.299985 | -1.077 |
| 70.314958 | -1.068 |
| 70.335471 | -1.039 |
| 70.355892 | -1.514 |
| 70.377056 | -2.085 |
| 70.395832 | -2.278 |
| 70.415011 | -2.124 |
| 70.435799 | -2.252 |
| 70.459118 | -1.817 |
| 70.475866 | -1.758 |
| 70.495703 | -1.856 |
| 70.514845 | -1.741 |
| 70.536249 | -1.926 |
| 70.555816 | -1.491 |
| 70.575867 | -1.762 |
| 70.596007 | -2.653 |
| 70.619341 | -2.779 |
| 70.635969 | -1.997 |
| 70.655707 | -1.369 |
| 70.675911 | -1.562 |
| 70.70025 | -2.047 |
| 70.715019 | -2.23 |
| 70.735436 | -2.307 |
| 70.756019 | -2.047 |
| 70.777851 | -0.858 |
| 70.795124 | -0.484 |
| 70.814916 | -0.977 |
| 70.83572 | -0.958 |
| 70.860589 | -0.696 |
| 70.875884 | -0.04 |
| 70.895132 | -0.136 |
| 70.91501 | 0.056 |
| 70.940636 | 0.103 |
| 70.955868 | 0.53 |
| 70.975946 | 0.684 |
| 70.99518 | 0.819 |
| 71.037629 | 1.882 |
| 71.056135 | 2.084 |
| 71.075157 | 2.006 |
| 71.096728 | 2.063 |
| 71.116161 | 2.662 |
| 71.135509 | 3.416 |
| 71.155688 | 3.775 |
| 71.178475 | 3.466 |
| 71.196865 | 3.446 |
| 71.215116 | 3.881 |
| 71.23519 | 4.768 |
| 71.256344 | 5.048 |
| 71.275898 | 5.319 |
| 71.297132 | 5.667 |
| 71.315149 | 6.112 |
| 71.336656 | 6.885 |
| 71.355738 | 7.088 |
| 71.375454 | 7.349 |
| 71.397885 | 7.629 |
| 71.418667 | 7.678 |
| 71.437246 | 7.727 |
| 71.455736 | 7.9 |
| 71.476018 | 7.398 |
| 71.499871 | 7.737 |
| 71.514823 | 8.047 |
| 71.535549 | 8.259 |
| 71.55556 | 8.57 |
| 71.579732 | 8.454 |
| 71.596439 | 8.36 |
| 71.614901 | 8.63 |
| 71.635167 | 8.929 |
| 71.658027 | 9.77 |
| 71.675912 | 9.992 |
| 71.696738 | 10.021 |
| 71.714882 | 10.003 |
| 71.760592 | 11.135 |
| 71.776 | 11.126 |
| 71.795052 | 11.087 |
| 71.839052 | 10.972 |
| 71.855753 | 11.252 |
| 71.876074 | 11.117 |
| 71.921564 | 10.915 |
| 71.93595 | 11.08 |
| 71.955747 | 11.147 |
| 71.979081 | 11.817 |
| 71.996221 | 11.818 |
| 72.014899 | 10.986 |
| 72.0358 | 10.746 |
| 72.082596 | 9.306 |
| 72.095791 | 8.824 |
| 72.115086 | 8.814 |
| 72.161848 | 9.087 |
| 72.175962 | 8.604 |
| 72.195468 | 8.151 |
| 72.216811 | 7.89 |
| 72.235811 | 7.522 |
| 72.255719 | 7.233 |
| 72.275942 | 7.272 |
| 72.298231 | 7.282 |
| 72.314774 | 6.866 |
| 72.335454 | 5.716 |
| 72.355682 | 5.641 |
| 72.376777 | 4.847 |
| 72.396106 | 4.48 |
| 72.414929 | 4.462 |
| 72.435698 | 3.92 |
| 72.458226 | 4.046 |
| 72.475859 | 3.717 |
| 72.494953 | 4.046 |
| 72.515434 | 3.591 |
| 72.535447 | 3.465 |
| 72.555731 | 3.504 |
| 72.57595 | 2.837 |
| 72.595293 | 2.198 |
| 72.619179 | 1.25 |
| 72.635826 | 1.483 |
| 72.655736 | 1.376 |
| 72.675909 | 1.26 |
| 72.699496 | 0.294 |
| 72.715162 | 0.535 |
| 72.735432 | 0.516 |
| 72.755759 | 0.188 |
| 72.77745 | 0.244 |
| 72.795198 | 0.128 |
| 72.815094 | 0.272 |
| 72.835789 | 0.194 |
| 72.859775 | -0.019 |
| 72.875897 | -0.165 |
| 72.895055 | -0.107 |
| 72.91491 | 0.271 |
| 72.939689 | 0.549 |
| 72.955845 | 0.163 |
| 72.975852 | 0.171 |
| 73.015296 | -0.768 |
| 73.038349 | -0.72 |
| 73.055731 | -0.556 |
| 73.075734 | -0.738 |
| 73.094771 | -0.662 |
| 73.118541 | -0.411 |
| 73.136201 | -0.42 |
| 73.155735 | -0.363 |
| 73.175852 | -0.075 |
| 73.21975 | -0.145 |
| 73.235677 | -0.183 |
| 73.25566 | -0.096 |
| 73.275482 | 0.578 |
| 73.295741 | 0.693 |
| 73.315308 | 1.043 |
| 73.335706 | 2.51 |
| 73.357315 | 2.827 |
| 73.375969 | 2.442 |
| 73.395276 | 2.539 |
| 73.414878 | 2.597 |
| 73.435542 | 2.809 |
| 73.455883 | 3.118 |
| 73.475849 | 3.725 |
| 73.494932 | 3.666 |
| 73.517015 | 3.55 |
| 73.535666 | 3.299 |
| 73.555722 | 3.512 |
| 73.575848 | 4.479 |
| 73.599403 | 5.86 |
| 73.615654 | 5.251 |
| 73.635606 | 5.193 |
| 73.655681 | 5.608 |
| 73.680217 | 6.313 |
| 73.696577 | 6.922 |
| 73.714954 | 6.825 |
| 73.735247 | 7.145 |
| 73.758372 | 7.57 |
| 73.776007 | 8.382 |
| 73.795483 | 8.381 |
| 73.814858 | 8.303 |
| 73.840217 | 8.391 |
| 73.855485 | 8.721 |
| 73.875875 | 8.78 |
| 73.89737 | 9.051 |
| 73.91987 | 9.312 |
| 73.935748 | 9.524 |
| 73.955683 | 9.766 |
| 73.975164 | 9.959 |
| 73.999773 | 9.594 |
| 74.015179 | 9.073 |
| 74.035882 | 9.305 |
| 74.055709 | 9.78 |
| 74.079289 | 9.208 |
| 74.095049 | 8.997 |
| 74.114942 | 9.703 |
| 74.135706 | 10.371 |
| 74.161509 | 10.912 |
| 74.175874 | 10.884 |
| 74.195447 | 10.865 |
| 74.21499 | 10.411 |
| 74.237455 | 10.267 |
| 74.255336 | 10.538 |
| 74.275054 | 10.79 |
| 74.294928 | 10.463 |
| 74.338933 | 8.966 |
| 74.355593 | 9.508 |
| 74.375171 | 10.118 |
| 74.396863 | 10.166 |
| 74.415951 | 9.462 |
| 74.43548 | 8.322 |
| 74.455136 | 7.415 |
| 74.476688 | 7.58 |
| 74.495845 | 7.715 |
| 74.515102 | 7.533 |
| 74.53548 | 7.156 |
| 74.557421 | 7.099 |
| 74.575856 | 6.799 |
| 74.597453 | 6.904 |
| 74.615112 | 6.615 |
| 74.637859 | 6.104 |
| 74.655657 | 5.968 |
| 74.676454 | 5.61 |
| 74.696699 | 5.553 |
| 74.71766 | 5.089 |
| 74.735713 | 4.578 |
| 74.755692 | 4.201 |
| 74.775482 | 3.495 |
| 74.799369 | 3.244 |
| 74.814836 | 3.109 |
| 74.835431 | 3.08 |
| 74.855613 | 2.472 |
| 74.87781 | 2.046 |
| 74.895083 | 2.085 |
| 74.914905 | 1.919 |
| 74.936373 | 1.136 |
| 74.958534 | 0.896 |
| 74.975292 | 0.712 |
| 74.995146 | 0.636 |
| 75.014944 | 0.518 |
| 75.037005 | 0.353 |
| 75.055841 | -0.207 |
| 75.075846 | -0.381 |
| 75.095064 | -0.131 |
| 75.118613 | -0.094 |
| 75.13581 | -0.094 |
| 75.155676 | -0.384 |
| 75.175852 | -0.414 |
| 75.201132 | -0.405 |
| 75.215108 | -0.522 |
| 75.2356 | -0.774 |
| 75.255676 | -1.159 |
| 75.2814 | -0.61 |
| 75.295116 | -0.503 |
| 75.315431 | -1.026 |
| 75.335689 | -1.394 |
| 75.363506 | -1.278 |
| 75.375857 | -1.376 |
| 75.395556 | -1.213 |
| 75.415 | -1.155 |
| 75.459261 | -1.543 |
| 75.475954 | -1.349 |
| 75.495747 | -1.128 |
| 75.516794 | -0.53 |
| 75.535746 | -0.462 |
| 75.555723 | -0.171 |
| 75.575889 | -0.143 |
| 75.599169 | -0.038 |
| 75.61492 | 0.115 |
| 75.635453 | 0.182 |
| 75.655726 | 0.307 |
| 75.67935 | 0.114 |
| 75.69707 | 0.258 |
| 75.715815 | 0.848 |
| 75.735145 | 1.321 |
| 75.757381 | 1.679 |
| 75.775863 | 1.678 |
| 75.797162 | 1.669 |
| 75.814844 | 1.707 |
| 75.836815 | 2.47 |
| 75.855843 | 2.596 |
| 75.875922 | 2.749 |
| 75.897794 | 2.595 |
| 75.918508 | 2.981 |
| 75.935407 | 3.58 |
| 75.955732 | 4.208 |
| 75.976769 | 4.431 |
| 75.999393 | 4.605 |
| 76.014941 | 4.817 |
| 76.035544 | 5.232 |
| 76.055786 | 5.842 |
| 76.078716 | 6.16 |
| 76.095153 | 6.112 |
| 76.114897 | 5.986 |
| 76.135701 | 6.335 |
| 76.159956 | 6.914 |
| 76.175918 | 7.3 |
| 76.194946 | 7.146 |
| 76.214921 | 7.389 |
| 76.239031 | 8.123 |
| 76.255862 | 8.557 |
| 76.27539 | 8.877 |
| 76.295051 | 8.782 |
| 76.320329 | 9.334 |
| 76.335793 | 9.604 |
| 76.355769 | 9.44 |
| 76.375132 | 8.967 |
| 76.400401 | 9.074 |
| 76.414916 | 9.316 |
| 76.435422 | 9.58 |
| 76.455667 | 9.822 |
| 76.500784 | 9.273 |
| 76.515033 | 9.36 |
| 76.535377 | 9.36 |
| 76.556015 | 9.804 |
| 76.576225 | 10.047 |
| 76.597397 | 10.144 |
| 76.615302 | 10.135 |
| 76.636973 | 10 |
| 76.656096 | 10.194 |
| 76.675852 | 10.301 |
| 76.699873 | 10.582 |
| 76.719331 | 10.399 |
| 76.735619 | 10.455 |
| 76.755881 | 10.188 |
| 76.77589 | 9.974 |
| 76.799549 | 9.617 |
| 76.814857 | 9.743 |
| 76.835455 | 9.029 |
| 76.855827 | 8.546 |
| 76.879214 | 7.689 |
| 76.897164 | 7.611 |
| 76.915067 | 7.457 |
| 76.93535 | 7.427 |
| 76.957297 | 7.254 |
| 76.975892 | 6.954 |
| 76.996743 | 6.25 |
| 77.014802 | 5.139 |
| 77.055721 | 4.597 |
| 77.075849 | 4.23 |
| 77.095853 | 4.133 |
| 77.119512 | 4.075 |
| 77.13598 | 4.027 |
| 77.155705 | 3.516 |
| 77.175983 | 2.897 |
| 77.199557 | 3.591 |
| 77.214979 | 3.514 |
| 77.235473 | 2.896 |
| 77.255684 | 2.085 |
| 77.27902 | 1.592 |
| 77.295274 | 1.37 |
| 77.315065 | 0.973 |
| 77.335679 | 0.268 |
| 77.375686 | 0.074 |
| 77.395117 | -0.477 |
| 77.4149 | -0.855 |
| 77.43883 | -1.048 |
| 77.456328 | -0.914 |
| 77.475824 | -1.079 |
| 77.495367 | -1.311 |
| 77.518438 | -1.785 |
| 77.535769 | -2.026 |
| 77.555692 | -2.075 |
| 77.575453 | -1.825 |
| 77.623132 | -1.759 |
| 77.636804 | -1.885 |
| 77.655748 | -1.807 |
| 77.675681 | -1.682 |
| 77.695753 | -1.963 |
| 77.715239 | -2.487 |
| 77.735661 | -2.575 |
| 77.757606 | -2.653 |
| 77.775849 | -2.547 |
| 77.795556 | -2.499 |
| 77.816069 | -2.151 |
| 77.835452 | -1.948 |
| 77.855962 | -2.287 |
| 77.875889 | -2.307 |
| 77.895563 | -2.144 |
| 77.918894 | -1.177 |
| 77.935995 | -1.053 |
| 77.955719 | -0.754 |
| 77.975961 | -1.353 |
| 77.998191 | -0.88 |
| 78.01514 | -0.621 |
| 78.035408 | -0.544 |
| 78.055686 | -0.843 |
| 78.075597 | -1.056 |
| 78.096953 | -0.505 |
| 78.114948 | 0.356 |
| 78.1353 | 1.052 |
| 78.157612 | 1.166 |
| 78.175858 | 0.846 |
| 78.196071 | 0.759 |
| 78.215115 | 1.726 |
| 78.238714 | 2.093 |
| 78.255775 | 2.431 |
| 78.275932 | 2.885 |
| 78.297307 | 3.078 |
| 78.319132 | 3.204 |
| 78.335522 | 3.803 |
| 78.35567 | 5.474 |
| 78.375839 | 5.878 |
| 78.400579 | 5.299 |
| 78.41555 | 4.904 |
| 78.435389 | 5.463 |
| 78.455673 | 6.043 |
| 78.480589 | 6.451 |
| 78.494981 | 7.05 |
| 78.515006 | 6.981 |
| 78.535779 | 6.749 |
| 78.561142 | 6.964 |
| 78.575848 | 7.291 |
| 78.595836 | 6.75 |
| 78.615608 | 7.138 |
| 78.638027 | 7.333 |
| 78.655734 | 7.199 |
| 78.67587 | 7.42 |
| 78.695556 | 7.489 |
| 78.738737 | 9.026 |
| 78.755614 | 9.335 |
| 78.775848 | 9.25 |
| 78.797447 | 8.748 |
| 78.816097 | 8.487 |
| 78.835735 | 8.738 |
| 78.855666 | 8.856 |
| 78.877618 | 8.528 |
| 78.897113 | 8.567 |
| 78.914899 | 8.704 |
| 78.935072 | 8.992 |
| 78.955774 | 9.465 |
| 78.975851 | 9.92 |
| 78.996405 | 9.863 |
| 79.014841 | 9.198 |
| 79.035588 | 9.063 |
| 79.055754 | 9.488 |
| 79.075846 | 10.068 |
| 79.09649 | 10.301 |
| 79.116764 | 9.819 |
| 79.135645 | 9.326 |
| 79.155666 | 9.473 |
| 79.175817 | 8.487 |
| 79.198512 | 7.695 |
| 79.214873 | 7.425 |
| 79.235772 | 7.029 |
| 79.255377 | 7.233 |
| 79.279447 | 6.489 |
| 79.295938 | 6.384 |
| 79.31497 | 6.249 |
| 79.335762 | 5.987 |
| 79.359635 | 5.651 |
| 79.375919 | 5.612 |
| 79.395404 | 5.014 |
| 79.415238 | 5.265 |
| 79.438026 | 4.983 |
| 79.456488 | 4.481 |
| 79.475861 | 4.211 |
| 79.495408 | 3.786 |
| 79.516919 | 2.995 |
| 79.535766 | 3.023 |
| 79.555806 | 3.159 |
| 79.575836 | 3.274 |
| 79.601792 | 3.197 |
| 79.614815 | 2.916 |
| 79.635875 | 2.539 |
| 79.655674 | 1.882 |
| 79.679245 | 1.311 |
| 79.695139 | 1.369 |
| 79.71522 | 1.301 |
| 79.735663 | 1.07 |
| 79.761077 | 0.644 |
| 79.775939 | 0.48 |
| 79.795495 | 0.131 |
| 79.814823 | 0.237 |
| 79.856686 | -0.527 |
| 79.87595 | -0.558 |
| 79.895986 | -1.167 |
| 79.91659 | -1.66 |
| 79.935826 | -1.487 |
| 79.955747 | -1.09 |
| 79.975934 | -0.974 |
| 79.99697 | -0.877 |
| 80.01545 | -1.255 |
| 80.035347 | -1.45 |
| 80.056025 | -1.644 |
| 80.075811 | -1.828 |
| 80.096719 | -1.973 |
| 80.114834 | -2.256 |
| 80.135393 | -2.052 |
| 80.15693 | -2.305 |
| 80.17586 | -2.566 |
| 80.196547 | -2.644 |
| 80.214886 | -2.392 |
| 80.237784 | -1.754 |
| 80.255794 | -1.658 |
| 80.275912 | -1.341 |
| 80.296626 | -1.505 |
| 80.318629 | -1.447 |
| 80.335432 | -1.757 |
| 80.355668 | -1.903 |
| 80.375862 | -1.749 |
| 80.39993 | -1.401 |
| 80.41571 | -0.745 |
| 80.435441 | -0.359 |
| 80.455719 | -0.059 |
| 80.481845 | 0.094 |
| 80.495151 | 0.297 |
| 80.514927 | 0.837 |
| 80.535773 | 1.319 |
| 80.559643 | 1.61 |
| 80.575846 | 1.629 |
| 80.594947 | 1.88 |
| 80.615289 | 2.326 |
| 80.637495 | 3.409 |
| 80.655785 | 3.899 |
| 80.675966 | 3.85 |
| 80.695306 | 3.523 |
| 80.71948 | 3.597 |
| 80.735723 | 3.444 |
| 80.756146 | 4.111 |
| 80.77583 | 4.7 |
| 80.801708 | 5.012 |
| 80.815073 | 4.711 |
| 80.835608 | 4.906 |
| 80.855666 | 5.648 |
| 80.900628 | 7.03 |
| 80.915227 | 7.947 |
| 80.934941 | 7.714 |
| 80.955428 | 6.255 |
| 80.975892 | 5.718 |
| 80.99692 | 5.72 |
| 81.014907 | 5.885 |
| 81.035314 | 5.981 |
| 81.055846 | 5.855 |
| 81.075853 | 8.626 |
| 81.095618 | 9.804 |
| 81.114963 | 9.92 |
| 81.135508 | 9.893 |
| 81.155665 | 10.561 |
| 81.17584 | 10.89 |
| 81.199652 | 9.856 |
| 81.214828 | 8.736 |
| 81.235378 | 8.98 |
| 81.255722 | 9.58 |
| 81.29946 | 8.198 |
| 81.314892 | 7.426 |
| 81.335562 | 7.948 |
| 81.375929 | 8.926 |
| 81.3981 | 9.448 |
| 81.414936 | 9.247 |
| 81.435553 | 9.149 |
| 81.455972 | 8.985 |
| 81.475938 | 9.943 |
| 81.498301 | 10.146 |
| 81.519239 | 10.446 |
| 81.535817 | 10.069 |
| 81.555873 | 8.62 |
| 81.575683 | 8.262 |
| 81.600633 | 7.732 |
| 81.616294 | 7.879 |
| 81.635943 | 7.812 |
| 81.655694 | 7.735 |
| 81.679903 | 7.01 |
| 81.695116 | 6.556 |
| 81.715321 | 6.083 |
| 81.735734 | 5.63 |
| 81.760822 | 5.687 |
| 81.77496 | 5.457 |
| 81.795063 | 5.07 |
| 81.814791 | 4.123 |
| 81.837073 | 3.707 |
| 81.855957 | 3.611 |
| 81.87584 | 3.765 |
| 81.895319 | 3.621 |
| 81.919186 | 3.341 |
| 81.935798 | 3.119 |
| 81.955675 | 2.926 |
| 81.975838 | 2.588 |
| 82.021215 | 1.92 |
| 82.035797 | 1.592 |
| 82.055762 | 1.205 |
| 82.075862 | 0.885 |
| 82.095195 | 0.992 |
| 82.115322 | 0.635 |
| 82.135643 | 0.412 |
| 82.158243 | 0.209 |
| 82.175961 | -0.081 |
| 82.195496 | -0.217 |
| 82.215068 | -0.488 |
| 82.236203 | -0.895 |
| 82.255671 | -0.865 |
| 82.275838 | -0.914 |
| 82.29542 | -0.954 |
| 82.31818 | -1.052 |
| 82.335964 | -1.177 |
| 82.355738 | -1.303 |
| 82.375834 | -1.352 |
| 82.400335 | -1.864 |
| 82.414803 | -2.029 |
| 82.435288 | -2.417 |
| 82.455662 | -2.02 |
| 82.479822 | -2.118 |
| 82.495074 | -2.428 |
| 82.515125 | -2.506 |
| 82.535783 | -3.213 |
| 82.559733 | -3.359 |
| 82.576554 | -2.684 |
| 82.595191 | -1.939 |
| 82.615514 | -1.842 |
| 82.638667 | -2.413 |
| 82.655689 | -2.636 |
| 82.675476 | -1.574 |
| 82.69511 | -1.816 |
| 82.71932 | -1.768 |
| 82.735641 | -1.247 |
| 82.75578 | -1.035 |
| 82.775829 | -1.199 |
| 82.801041 | -1.025 |
| 82.815041 | -0.707 |
| 82.835536 | -0.784 |
| 82.85574 | -0.658 |
| 82.880592 | -0.39 |
| 82.895056 | -0.634 |
| 82.914898 | 0.05 |
| 82.935905 | 0.978 |
| 82.962768 | 1.984 |
| 82.975595 | 2.343 |
| 82.995629 | 2.813 |
| 83.015086 | 1.094 |
| 83.040348 | -1.859 |
| 83.055842 | -2.67 |
| 83.075834 | -0.207 |
| 83.094948 | 0.385 |
| 83.138793 | 2.104 |
| 83.155632 | 1.671 |
| 83.175837 | 1.737 |
| 83.198231 | 2.25 |
| 83.214826 | 2.986 |
| 83.235563 | 3.11 |
| 83.255639 | 3.323 |
| 83.277639 | 4.445 |
| 83.295286 | 4.417 |
| 83.315204 | 3.711 |
| 83.33576 | 3.247 |
| 83.3591 | 5.033 |
| 83.375855 | 6.368 |
| 83.39544 | 4.946 |
| 83.415135 | 4.396 |
| 83.460232 | 5.876 |
| 83.475917 | 6.116 |
| 83.495368 | 5.866 |
| 83.540697 | 6.584 |
| 83.555731 | 7.475 |
| 83.575834 | 7.212 |
| 83.621817 | 7.098 |
| 83.63579 | 8.547 |
| 83.655654 | 8.595 |
| 83.680657 | 8.48 |
| 83.695601 | 8.086 |
| 83.715143 | 6.87 |
| 83.735235 | 7.091 |
| 83.759708 | 7.515 |
| 83.775837 | 7.726 |
| 83.79591 | 7.953 |
| 83.814935 | 8.225 |
| 83.837485 | 7.888 |
| 83.855746 | 7.877 |
| 83.876043 | 7.16 |
| 83.895514 | 6.458 |
| 83.918221 | 6.23 |
| 83.935691 | 7.012 |
| 83.956445 | 8.293 |
| 83.975827 | 8.456 |
| 84.002066 | 8.38 |
| 84.015029 | 8.157 |
| 84.035429 | 7.888 |
| 84.055707 | 8.245 |
| 84.081984 | 9.626 |
| 84.095281 | 9.954 |
| 84.114914 | 10.014 |
| 84.13568 | 9.231 |
| 84.162379 | 7.281 |
| 84.175913 | 7.639 |
| 84.1954 | 7.513 |
| 84.214799 | 6.557 |
| 84.259357 | 6.23 |
| 84.275886 | 6.085 |
| 84.295148 | 5.33 |
| 84.31705 | 4.518 |
| 84.335774 | 3.987 |
| 84.35566 | 4.152 |
| 84.374902 | 3.871 |
| 84.39802 | 3.639 |
| 84.415686 | 3.331 |
| 84.435511 | 3.079 |
| 84.455652 | 2.549 |
| 84.480482 | 2.21 |
| 84.496523 | 1.716 |
| 84.514909 | 1.369 |
| 84.535675 | 1.049 |
| 84.55986 | 1.03 |
| 84.575846 | 0.788 |
| 84.595086 | 0.557 |
| 84.614929 | 0.42 |
| 84.637569 | 0.44 |
| 84.655927 | 0.468 |
| 84.675824 | 0.496 |
| 84.695448 | 0.264 |
| 84.719093 | 0.253 |
| 84.735815 | 0.089 |
| 84.755667 | 0.253 |
| 84.77583 | 0.339 |
| 84.801211 | 0.397 |
| 84.815111 | -0.105 |
| 84.835469 | -0.357 |
| 84.855663 | -0.192 |
| 84.882221 | -0.619 |
| 84.895276 | -0.368 |
| 84.914858 | -0.484 |
| 84.935933 | -1.569 |
| 84.960146 | -1.202 |
| 84.975381 | -0.844 |
| 84.994808 | -0.737 |
| 85.014864 | -0.476 |
| 85.037994 | -0.487 |
| 85.055699 | -0.671 |
| 85.075876 | -0.527 |
| 85.095218 | -0.508 |
| 85.118031 | -0.364 |
| 85.135792 | -0.114 |
| 85.155656 | 0.116 |
| 85.175726 | 0.079 |
| 85.201371 | 0.406 |
| 85.21514 | 1.218 |
| 85.235774 | 1.991 |
| 85.255671 | 2.28 |
| 85.30162 | 1.996 |
| 85.314896 | 2.045 |
| 85.335286 | 3.06 |
| 85.356628 | 3.476 |
| 85.376332 | 2.799 |
| 85.39718 | 3.234 |
| 85.415219 | 2.915 |
| 85.437932 | 2.596 |
| 85.456018 | 3.213 |
| 85.475826 | 3.754 |
| 85.499198 | 4.304 |
| 85.519651 | 4.489 |
| 85.536265 | 5.097 |
| 85.555694 | 5.445 |
| 85.575832 | 5.377 |
| 85.599891 | 5.784 |
| 85.615934 | 6.082 |
| 85.635425 | 6.304 |
| 85.655752 | 5.765 |
| 85.679829 | 6.375 |
| 85.695294 | 6.517 |
| 85.714928 | 7.194 |
| 85.735668 | 7.476 |
| 85.759442 | 8.027 |
| 85.775832 | 7.348 |
| 85.795382 | 7.686 |
| 85.8156 | 8.19 |
| 85.837298 | 8.703 |
| 85.855733 | 8.441 |
| 85.875875 | 8.152 |
| 85.895325 | 8.53 |
| 85.92082 | 9.045 |
| 85.935609 | 9.669 |
| 85.955708 | 9.663 |
| 85.975816 | 10.214 |
| 86.00175 | 11.082 |
| 86.015086 | 10.235 |
| 86.035348 | 9.877 |
| 86.055214 | 9.617 |
| 86.081211 | 10.67 |
| 86.095164 | 9.966 |
| 86.114897 | 10.228 |
| 86.135681 | 10.257 |
| 86.160233 | 10.316 |
| 86.17592 | 11.146 |
| 86.195047 | 11.34 |
| 86.214754 | 11.399 |
| 86.238652 | 10.27 |
| 86.25577 | 9.768 |
| 86.275872 | 9.799 |
| 86.295259 | 9.895 |
| 86.318716 | 9.501 |
| 86.33584 | 9.52 |
| 86.355654 | 8.912 |
| 86.375829 | 8.545 |
| 86.421809 | 8.401 |
| 86.435783 | 8.024 |
| 86.455628 | 7.929 |
| 86.47757 | 7.735 |
| 86.495643 | 7.609 |
| 86.515138 | 7.639 |
| 86.53588 | 7.398 |
| 86.558873 | 5.62 |
| 86.576111 | 5.33 |
| 86.595646 | 5.012 |
| 86.615279 | 4.946 |
| 86.638356 | 4.887 |
| 86.656187 | 4.838 |
| 86.675818 | 4.752 |
| 86.695635 | 4.637 |
| 86.71893 | 4.298 |
| 86.73571 | 3.631 |
| 86.755691 | 2.917 |
| 86.775821 | 2.801 |
| 86.80059 | 2.269 |
| 86.815038 | 1.892 |
| 86.835374 | 1.379 |
| 86.855651 | 0.973 |
| 86.880075 | 0.817 |
| 86.895081 | 0.208 |
| 86.914998 | -0.208 |
| 86.935583 | -0.208 |
| 86.960195 | -0.005 |
| 86.975827 | 0.1 |
| 86.995366 | -0.083 |
| 87.014919 | -0.469 |
| 87.038817 | -0.643 |
| 87.05588 | -0.818 |
| 87.075826 | -1.148 |
| 87.095273 | -1.081 |
| 87.118749 | -1.092 |
| 87.136023 | -1.091 |
| 87.155657 | -1.102 |
| 87.176416 | -1.285 |
| 87.200693 | -1.557 |
| 87.214985 | -1.624 |
| 87.235441 | -1.838 |
| 87.255658 | -2.15 |
| 87.282303 | -2.17 |
| 87.295051 | -1.928 |
| 87.314863 | -2.004 |
| 87.335709 | -1.975 |
| 87.362736 | -2.237 |
| 87.375841 | -2.451 |
| 87.395565 | -2.209 |
| 87.41478 | -1.794 |
| 87.43962 | -1.571 |
| 87.455906 | -1.688 |
| 87.475836 | -1.891 |
| 87.494947 | -1.544 |
| 87.540293 | -1.913 |
| 87.555788 | -2.01 |
| 87.575824 | -1.566 |
| 87.598618 | -1.073 |
| 87.615044 | 1.072 |
| 87.635444 | 2.154 |
| 87.655645 | 1.072 |
| 87.676137 | 2.297 |
| 87.698025 | 2.277 |
| 87.715402 | 2.276 |
| 87.735326 | 2.149 |
| 87.756761 | 2.904 |
| 87.815129 | 3.231 |
| 87.836572 | 3.416 |
| 87.855615 | 3.232 |
| 87.875922 | 3.32 |
| 87.898848 | 3.705 |
| 87.919507 | 4.005 |
| 87.935666 | 3.977 |
| 87.95569 | 4.065 |
| 87.975304 | 4.045 |
| 87.999901 | 4.024 |
| 88.014773 | 4.172 |
| 88.035689 | 4.742 |
| 88.055658 | 5.426 |
| 88.07937 | 5.59 |
| 88.094942 | 5.641 |
| 88.11492 | 6.355 |
| 88.136013 | 7.222 |
| 88.158805 | 8.392 |
| 88.175523 | 8.2 |
| 88.195168 | 8.743 |
| 88.214994 | 9.063 |
| 88.236833 | 9.013 |
| 88.255632 | 8.637 |
| 88.275823 | 8.601 |
| 88.295776 | 8.911 |
| 88.318569 | 9.335 |
| 88.335761 | 9.432 |
| 88.355647 | 9.364 |
| 88.375284 | 9.086 |
| 88.400859 | 9.569 |
| 88.415008 | 9.956 |
| 88.435588 | 10.081 |
| 88.455619 | 10.344 |
| 88.481849 | 10.566 |
| 88.49566 | 10.46 |
| 88.515304 | 9.892 |
| 88.535637 | 9.912 |
| 88.561988 | 9.525 |
| 88.575968 | 9.495 |
| 88.595808 | 9.834 |
| 88.61526 | 10.405 |
| 88.658076 | 9.991 |
| 88.675784 | 9.905 |
| 88.695046 | 9.953 |
| 88.717258 | 10.021 |
| 88.735733 | 10.158 |
| 88.755139 | 9.558 |
| 88.775801 | 8.043 |
| 88.798968 | 7.503 |
| 88.815688 | 7.387 |
| 88.835492 | 7.339 |
| 88.85565 | 7.436 |
| 88.880389 | 6.712 |
| 88.89778 | 6.51 |
| 88.914958 | 6.335 |
| 88.935096 | 6.152 |
| 88.958386 | 6.279 |
| 88.97591 | 6.337 |
| 88.997126 | 6.086 |
| 89.014831 | 5.912 |
| 89.037227 | 5.467 |
| 89.055664 | 5.012 |
| 89.075824 | 4.393 |
| 89.096944 | 2.665 |
| 89.118738 | 2.54 |
| 89.135859 | 2.183 |
| 89.155671 | 1.97 |
| 89.175819 | 1.805 |
| 89.20133 | 1.312 |
| 89.214798 | 0.993 |
| 89.235456 | 0.839 |
| 89.255717 | 0.887 |
| 89.279924 | 0.897 |
| 89.294928 | 0.664 |
| 89.314896 | 0.007 |
| 89.335789 | -0.497 |
| 89.361286 | -0.44 |
| 89.375871 | -0.469 |
| 89.395593 | -0.382 |
| 89.415157 | -0.44 |
| 89.437991 | -0.422 |
| 89.45573 | -0.615 |
| 89.475852 | -1.109 |
| 89.495166 | -1.573 |
| 89.518403 | -1.921 |
| 89.535791 | -1.884 |
| 89.555756 | -1.865 |
| 89.575869 | -1.846 |
| 89.602238 | -2.165 |
| 89.614931 | -2.311 |
| 89.635465 | -2.466 |
| 89.655313 | -1.877 |
| 89.715019 | -1.936 |
| 89.735397 | -2.169 |
| 89.756373 | -2.17 |
| 89.775871 | -2.083 |
| 89.795455 | -1.833 |
| 89.814867 | -1.842 |
| 89.836391 | -1.814 |
| 89.85595 | -1.65 |
| 89.87601 | -1.796 |
| 89.897061 | -1.922 |
| 89.917316 | -1.719 |
| 89.935626 | -1.633 |
| 89.95566 | -1.363 |
| 89.975367 | -1.035 |
| 89.998651 | -0.812 |
| 90.014976 | -0.861 |
| 90.035359 | -0.079 |
| 90.055658 | 1.388 |
| 90.080976 | 1.774 |
| 90.094939 | 1.996 |
| 90.114863 | 2.179 |
| 90.136465 | 2.19 |
| 90.159306 | 2.296 |
| 90.175654 | 2.342 |
| 90.195198 | 2.689 |
| 90.214802 | 2.661 |
| 90.236631 | 2.565 |
| 90.255847 | 2.854 |
| 90.274962 | 3.114 |
| 90.295074 | 3.405 |
| 90.320468 | 4.188 |
| 90.335609 | 4.419 |
| 90.355704 | 4.342 |
| 90.375984 | 4.363 |
| 90.40099 | 5.339 |
| 90.415141 | 5.675 |
| 90.435496 | 5.822 |
| 90.455714 | 6.354 |
| 90.480641 | 5.891 |
| 90.495507 | 5.834 |
| 90.514877 | 7.504 |
| 90.535662 | 7.592 |
| 90.560577 | 7.93 |
| 90.575914 | 7.911 |
| 90.59536 | 7.93 |
| 90.614861 | 7.785 |
| 90.640231 | 8.569 |
| 90.655907 | 8.617 |
| 90.675965 | 9.41 |
| 90.695219 | 9.585 |
| 90.719117 | 9.827 |
| 90.735721 | 9.886 |
| 90.75556 | 10.012 |
| 90.77581 | 10.216 |
| 90.821257 | 10.216 |
| 90.836029 | 9.618 |
| 90.855642 | 9.917 |
| 90.876935 | 9.908 |
| 90.895101 | 10.247 |
| 90.914903 | 10.094 |
| 90.935677 | 10.084 |
| 90.95815 | 9.302 |
| 90.975823 | 9.593 |
| 90.994835 | 9.554 |
| 91.016582 | 9.797 |
| 91.036673 | 9.342 |
| 91.055884 | 9.179 |
| 91.075816 | 9.48 |
| 91.095413 | 9.296 |
| 91.116174 | 9.076 |
| 91.135973 | 8.776 |
| 91.155637 | 8.101 |
| 91.175995 | 8.236 |
| 91.198793 | 7.793 |
| 91.215206 | 7.01 |
| 91.235551 | 6.952 |
| 91.255655 | 6.865 |
| 91.28107 | 6.866 |
| 91.295488 | 6.78 |
| 91.314916 | 6.674 |
| 91.33514 | 6.403 |
| 91.359335 | 5.997 |
| 91.375826 | 5.95 |
| 91.395156 | 5.253 |
| 91.415048 | 4.51 |
| 91.438041 | 4.095 |
| 91.45545 | 3.592 |
| 91.475816 | 3.311 |
| 91.494946 | 3.032 |
| 91.520083 | 2.732 |
| 91.536042 | 2.298 |
| 91.55569 | 1.95 |
| 91.575893 | 1.592 |
| 91.601164 | 1.233 |
| 91.615219 | 1.061 |
| 91.635477 | 0.635 |
| 91.655744 | 0.393 |
| 91.681099 | -0.1 |
| 91.695349 | -0.294 |
| 91.714864 | -0.623 |
| 91.735624 | -0.661 |
| 91.761716 | -0.692 |
| 91.77582 | -0.537 |
| 91.795729 | -0.528 |
| 91.815768 | -0.751 |
| 91.83934 | -1.63 |
| 91.855717 | -1.447 |
| 91.875873 | -1.428 |
| 91.895087 | -1.381 |
| 91.941125 | -1.787 |
| 91.955648 | -1.934 |
| 91.975808 | -2.05 |
| 91.999041 | -1.868 |
| 92.015308 | -1.975 |
| 92.035445 | -2.167 |
| 92.055325 | -2.392 |
| 92.078245 | -2.487 |
| 92.097359 | -2.072 |
| 92.11518 | -2.131 |
| 92.135143 | -2.092 |
| 92.15586 | -2.228 |
| 92.175893 | -2.132 |
| 92.196877 | -2.183 |
| 92.215027 | -2.211 |
| 92.235433 | -1.787 |
| 92.255547 | -1.864 |
| 92.275818 | -1.699 |
| 92.295578 | -1.381 |
| 92.316493 | -1.034 |
| 92.335475 | -0.135 |
| 92.355671 | 0.761 |
| 92.375812 | 1.032 |
| 92.400887 | 1.475 |
| 92.414949 | 1.426 |
| 92.435436 | 1.522 |
| 92.455396 | 1.599 |
| 92.480102 | 1.995 |
| 92.495299 | 1.87 |
| 92.515152 | 2.15 |
| 92.535657 | 2.73 |
| 92.560939 | 2.942 |
| 92.575474 | 3.232 |
| 92.595363 | 3.425 |
| 92.614898 | 3.52 |
| 92.640174 | 3.926 |
| 92.655674 | 4.129 |
| 92.675817 | 4.343 |
| 92.695035 | 4.42 |
| 92.719646 | 4.293 |
| 92.735601 | 3.985 |
| 92.755635 | 4.47 |
| 92.77582 | 5.464 |
| 92.801671 | 6.314 |
| 92.814779 | 6.788 |
| 92.835488 | 7.233 |
| 92.855644 | 7.242 |
| 92.881679 | 7.126 |
| 92.895093 | 7.348 |
| 92.914882 | 7.657 |
| 92.935691 | 8.325 |
| 92.963826 | 8.374 |
| 92.975886 | 8.702 |
| 92.995992 | 8.954 |
| 93.01495 | 8.936 |
| 93.057858 | 9.149 |
| 93.075914 | 9.506 |
| 93.096046 | 9.574 |
| 93.118127 | 9.516 |
| 93.135797 | 9.586 |
| 93.155633 | 10.148 |
| 93.1764 | 10.091 |
| 93.198674 | 9.929 |
| 93.215385 | 10.121 |
| 93.235561 | 9.88 |
| 93.255686 | 9.9 |
| 93.278212 | 10.133 |
| 93.295741 | 10.133 |
| 93.314996 | 10.104 |
| 93.335656 | 10.133 |
| 93.359877 | 9.74 |
| 93.375825 | 9.807 |
| 93.395201 | 9.914 |
| 93.415182 | 9.489 |
| 93.438188 | 9.452 |
| 93.455801 | 9.258 |
| 93.475805 | 8.766 |
| 93.494874 | 8.216 |
| 93.519062 | 7.878 |
| 93.535157 | 7.917 |
| 93.555637 | 7.609 |
| 93.57545 | 7.484 |
| 93.601214 | 7.127 |
| 93.614782 | 6.819 |
| 93.635409 | 6.973 |
| 93.674916 | 6.635 |
| 93.700712 | 6.21 |
| 93.714855 | 5.794 |
| 93.735482 | 5.427 |
| 93.755637 | 5.186 |
| 93.781199 | 5.099 |
| 93.795358 | 4.993 |
| 93.814906 | 4.327 |
| 93.835666 | 4.057 |
| 93.860489 | 3.149 |
| 93.875918 | 2.985 |
| 93.895673 | 2.413 |
| 93.915024 | 2.085 |
| 93.938917 | 1.718 |
| 93.955769 | 1.264 |
| 93.975803 | 0.955 |
| 93.995139 | 0.51 |
| 94.020777 | -0.051 |
| 94.035704 | -0.052 |
| 94.055717 | -0.118 |
| 94.075863 | 0.055 |
| 94.122837 | 0.036 |
| 94.135872 | 0.036 |
| 94.155622 | -0.187 |
| 94.179711 | -0.72 |
| 94.19503 | -0.953 |
| 94.214856 | -1.292 |
| 94.234809 | -1.601 |
| 94.258929 | -1.524 |
| 94.275814 | -1.322 |
| 94.295282 | -1.284 |
| 94.315065 | -1.448 |
| 94.338122 | -1.912 |
| 94.355306 | -1.787 |
| 94.375857 | -1.817 |
| 94.39498 | -2.059 |
| 94.419096 | -2.592 |
| 94.435508 | -2.507 |
| 94.45553 | -2.701 |
| 94.475807 | -2.392 |
| 94.50076 | -2.189 |
| 94.514978 | -2.189 |
| 94.535424 | -2.102 |
| 94.555699 | -2.074 |
| 94.580272 | -2.083 |
| 94.594918 | -2.181 |
| 94.61486 | -2.375 |
| 94.635365 | -1.758 |
| 94.660091 | -1.555 |
| 94.675822 | -1.227 |
| 94.695263 | -1.479 |
| 94.71543 | -1.508 |
| 94.738815 | -1.47 |
| 94.755618 | -1.566 |
| 94.77584 | -0.108 |
| 94.795231 | 0.567 |
| 94.819696 | 1.369 |
| 94.836074 | 1.494 |
| 94.855818 | 1.831 |
| 94.875807 | 2.091 |
| 94.901521 | 2.555 |
| 94.914817 | 2.854 |
| 94.935694 | 2.989 |
| 94.955377 | 2.641 |
| 94.981197 | 2.496 |
| 94.994725 | 2.447 |
| 95.015145 | 2.449 |
| 95.035662 | 2.884 |
| 95.062255 | 3.184 |
| 95.075863 | 3.279 |
| 95.095819 | 3.619 |
| 95.114934 | 3.976 |
| 95.138461 | 4.053 |
| 95.155959 | 4.149 |
| 95.176256 | 4.613 |
| 95.195432 | 5.116 |
| 95.241353 | 5.792 |
| 95.255763 | 5.926 |
| 95.275809 | 6.448 |
| 95.298738 | 7.298 |
| 95.315592 | 8.081 |
| 95.335333 | 8.535 |
| 95.355492 | 8.961 |
| 95.379394 | 9.734 |
| 95.396644 | 10.102 |
| 95.415058 | 9.619 |
| 95.435066 | 8.992 |
| 95.455349 | 8.146 |
| 95.475897 | 7.604 |
| 95.49657 | 7.373 |
| 95.515238 | 7.974 |
| 95.535725 | 8.698 |
| 95.555805 | 9.404 |
| 95.575804 | 9.628 |
| 95.596664 | 10.208 |
| 95.618819 | 10.866 |
| 95.635674 | 10.952 |
| 95.655642 | 10.17 |
| 95.675808 | 9.745 |
| 95.700599 | 10.026 |
| 95.714794 | 10.345 |
| 95.735444 | 10.404 |
| 95.755622 | 10.346 |
| 95.779986 | 9.757 |
| 95.795828 | 10.133 |
| 95.814861 | 10.415 |
| 95.835689 | 10.578 |
| 95.860286 | 10.137 |
| 95.875932 | 10.242 |
| 95.895364 | 9.48 |
| 95.914991 | 9.229 |
| 95.939419 | 9.181 |
| 95.956229 | 9.259 |
| 95.975793 | 8.999 |
| 95.995081 | 9.008 |
| 96.019696 | 8.778 |
| 96.035733 | 8.593 |
| 96.055857 | 8.16 |
| 96.0758 | 7.782 |
| 96.10171 | 6.47 |
| 96.114928 | 6.557 |
| 96.135402 | 6.305 |
| 96.155637 | 6.277 |
| 96.179721 | 5.793 |
| 96.194929 | 5.542 |
| 96.214883 | 5.224 |
| 96.235646 | 5.061 |
| 96.262185 | 4.886 |
| 96.274907 | 4.712 |
| 96.295125 | 4.451 |
| 96.314904 | 4.123 |
| 96.356735 | 3.03 |
| 96.375832 | 2.808 |
| 96.395587 | 2.49 |
| 96.415387 | 2.372 |
| 96.435724 | 1.87 |
| 96.455636 | 1.754 |
| 96.47642 | 1.299 |
| 96.498556 | 1.067 |
| 96.515248 | 0.71 |
| 96.535407 | 0.255 |
| 96.555639 | 0.158 |
| 96.577648 | 0.255 |
| 96.595102 | 0.158 |
| 96.61486 | 0.032 |
| 96.635656 | 0.147 |
| 96.659177 | -0.037 |
| 96.675819 | -0.26 |
| 96.695214 | -0.096 |
| 96.714892 | 0.116 |
| 96.737452 | -0.048 |
| 96.755939 | -0.001 |
| 96.775797 | -0.28 |
| 96.795017 | -0.399 |
| 96.818362 | -0.552 |
| 96.835805 | -0.669 |
| 96.855813 | -1.116 |
| 96.876181 | -0.517 |
| 96.900839 | -0.324 |
| 96.915106 | -0.44 |
| 96.935682 | -0.353 |
| 96.9557 | -0.519 |
| 96.982999 | -0.538 |
| 96.994992 | -0.306 |
| 97.014976 | 0.117 |
| 97.035707 | 0.233 |
| 97.060687 | 0.204 |
| 97.075806 | 0.571 |
| 97.096149 | 0.899 |
| 97.115068 | 1.902 |
| 97.139612 | 2.074 |
| 97.155736 | 2.229 |
| 97.175907 | 2.268 |
| 97.19523 | 2.596 |
| 97.219946 | 3.281 |
| 97.235937 | 3.34 |
| 97.255639 | 3.214 |
| 97.275801 | 3.533 |
| 97.30212 | 2.683 |
| 97.315015 | 2.905 |
| 97.335367 | 2.741 |
| 97.355637 | 3.453 |
| 97.399889 | 3.986 |
| 97.414985 | 4.547 |
| 97.435304 | 5.261 |
| 97.456233 | 5.57 |
| 97.475959 | 5.744 |
| 97.496874 | 6.005 |
| 97.51513 | 6.304 |
| 97.535101 | 5.968 |
| 97.555713 | 6.257 |
| 97.575805 | 6.711 |
| 97.596995 | 7.329 |
| 97.618524 | 7.339 |
| 97.635551 | 7.803 |
| 97.655626 | 7.976 |
| 97.675808 | 7.811 |
| 97.700676 | 7.668 |
| 97.714761 | 7.948 |
| 97.735507 | 8.48 |
| 97.755713 | 9.505 |
| 97.779927 | 9.554 |
| 97.795471 | 9.573 |
| 97.815072 | 9.631 |
| 97.835622 | 9.719 |
| 97.859946 | 10.107 |
| 97.875814 | 10.136 |
| 97.895035 | 9.933 |
| 97.914936 | 9.721 |
| 97.939763 | 10.302 |
| 97.956254 | 10.708 |
| 97.975805 | 10.824 |
| 97.995669 | 10.883 |
| 98.021332 | 10.932 |
| 98.035704 | 10.941 |
| 98.055836 | 10.846 |
| 98.075798 | 10.605 |
| 98.101422 | 10.238 |
| 98.115035 | 10.287 |
| 98.135448 | 10.123 |
| 98.15563 | 10.385 |
| 98.179592 | 10.34 |
| 98.194863 | 9.894 |
| 98.21483 | 10.04 |
| 98.235684 | 9.169 |
| 98.260927 | 8.805 |
| 98.275808 | 8.795 |
| 98.295485 | 8.805 |
| 98.31501 | 8.554 |
| 98.340514 | 8.246 |
| 98.355866 | 8.16 |
| 98.375803 | 7.347 |
| 98.395195 | 6.671 |
| 98.436063 | 6.537 |
| 98.455621 | 6.78 |
| 98.475802 | 6.693 |
| 98.522213 | 5.795 |
| 98.535655 | 5.525 |
| 98.555642 | 5.061 |
| 98.578888 | 4.471 |
| 98.595871 | 4.297 |
| 98.615139 | 3.786 |
| 98.63566 | 3.524 |
| 98.659745 | 3.254 |
| 98.675817 | 3.273 |
| 98.695644 | 2.095 |
| 98.714859 | 1.525 |
| 98.737632 | 1.225 |
| 98.755741 | 0.973 |
| 98.775793 | 0.847 |
| 98.795469 | 0.664 |
| 98.819946 | 0.683 |
| 98.835845 | 0.499 |
| 98.855696 | 0.266 |
| 98.875799 | -0.488 |
| 98.901803 | -0.662 |
| 98.914929 | -0.778 |
| 98.935427 | -0.566 |
| 98.955284 | -0.712 |
| 98.980635 | -1.011 |
| 98.995378 | -0.924 |
| 99.014861 | -1.157 |
| 99.036174 | -1.197 |
| 99.061148 | -1.178 |
| 99.075812 | -1.284 |
| 99.094858 | -1.188 |
| 99.115673 | -1.208 |
| 99.139405 | -1.237 |
| 99.155797 | -1.778 |
| 99.175919 | -1.662 |
| 99.195691 | -1.77 |
| 99.219366 | -1.86 |
| 99.235908 | -1.753 |
| 99.255685 | -2.053 |
| 99.275859 | -2.025 |
| 99.302492 | -1.861 |
| 99.31508 | -1.658 |
| 99.335389 | -1.494 |
| 99.355742 | -1.302 |
| 99.381587 | -1.205 |
| 99.395141 | -1.457 |
| 99.414938 | -1.477 |
| 99.435648 | -1.332 |
| 99.463379 | -0.946 |
| 99.475317 | -0.724 |
| 99.496938 | -0.338 |
| 99.514859 | 0.597 |
| 99.53979 | 0.944 |
| 99.555759 | 1.157 |
| 99.575801 | 1.784 |
| 99.596928 | 2.132 |
| 99.64146 | 2.034 |
| 99.655877 | 2.091 |
| 99.675804 | 2.477 |
| 99.700174 | 2.12 |
| 99.716671 | 2.332 |
| 99.735411 | 2.323 |
| 99.755627 | 2.893 |
| 99.783103 | 3.695 |
| 99.795273 | 3.898 |
| 99.815157 | 4.081 |
| 99.83563 | 4.362 |
| 99.859301 | 4.672 |
| 99.875899 | 4.991 |
| 99.895159 | 5.212 |
| 99.915759 | 5.115 |
| 99.937401 | 5.067 |
| 99.955704 | 5.327 |
| 99.97583 | 5.888 |
| 99.995827 | 6.535 |
| 100.019696 | 7.077 |
| 100.035667 | 7.646 |
| 100.055804 | 7.898 |
| 100.075843 | 8.826 |
| 100.100859 | 9.514 |
| 100.115398 | 9.687 |
| 100.135472 | 9.726 |
| 100.155653 | 9.031 |
| 100.180917 | 8.674 |
| 100.19502 | 8.49 |
| 100.214859 | 8.587 |
| 100.235649 | 8.743 |
| 100.260761 | 9.034 |
| 100.2758 | 9.537 |
| 100.295002 | 10.176 |
| 100.314781 | 10.166 |
| 100.338391 | 9.827 |
| 100.355882 | 9.751 |
| 100.375871 | 10.002 |
| 100.395135 | 10.476 |
| 100.417789 | 10.593 |
| 100.4358 | 10.777 |
| 100.455732 | 10.517 |
| 100.475798 | 10.517 |
| 100.502471 | 10.75 |
| 100.515086 | 10.674 |
| 100.535409 | 10.094 |
| 100.555619 | 9.466 |
| 100.583074 | 9.313 |
| 100.59493 | 9.603 |
| 100.615093 | 9.481 |
| 100.635631 | 8.901 |
| 100.663393 | 8.013 |
| 100.675865 | 7.772 |
| 100.697249 | 8.053 |
| 100.71511 | 7.86 |
| 100.758171 | 7.03 |
| 100.776055 | 6.759 |
| 100.79576 | 6.362 |
| 100.818828 | 6.295 |
| 100.835724 | 6.161 |
| 100.855618 | 5.861 |
| 100.875793 | 5.437 |
| 100.900167 | 5.128 |
| 100.914708 | 4.723 |
| 100.935379 | 4.433 |
| 100.955698 | 4.153 |
| 100.979615 | 3.496 |
| 100.99493 | 3.379 |
| 101.014884 | 3.148 |
| 101.035671 | 2.712 |
| 101.059548 | 2.075 |
| 101.07585 | 2.016 |
| 101.095209 | 2.614 |
| 101.11542 | 2.256 |
| 101.137383 | 1.968 |
| 101.155708 | 1.763 |
| 101.175793 | 1.426 |
| 101.195091 | 0.864 |
| 101.218411 | 0.207 |
| 101.236136 | 0.042 |
| 101.255647 | 0.023 |
| 101.275886 | 0.197 |
| 101.301316 | 0.245 |
| 101.315306 | -0.121 |
| 101.335536 | -0.663 |
| 101.356155 | -1.001 |
| 101.378445 | -0.693 |
| 101.395452 | -0.904 |
| 101.414876 | -1.041 |
| 101.435639 | -1.978 |
| 101.461454 | -2.308 |
| 101.475808 | -2.184 |
| 101.495353 | -2.156 |
| 101.51485 | -2.08 |
| 101.5405 | -1.984 |
| 101.555835 | -1.889 |
| 101.576221 | -2.122 |
| 101.594936 | -2.372 |
| 101.620448 | -2.826 |
| 101.635901 | -2.652 |
| 101.655623 | -1.948 |
| 101.675796 | -2.074 |
| 101.703054 | -1.669 |
| 101.715201 | -1.959 |
| 101.735434 | -2.258 |
| 101.755612 | -2.306 |
| 101.802991 | -0.666 |
| 101.814948 | -0.346 |
| 101.835188 | -0.192 |
| 101.857198 | -0.821 |
| 101.876137 | -0.967 |
| 101.897217 | -0.774 |
| 101.915113 | -0.928 |
| 101.936548 | -0.426 |
| 101.955549 | 0.172 |
| 101.975808 | -0.275 |
| 101.999427 | -0.237 |
| 102.020168 | 1.403 |
| 102.035488 | 4.691 |
| 102.055705 | 4.465 |
| 102.075798 | -3.195 |
| 102.101009 | -2.361 |
| 102.114932 | 0.497 |
| 102.135797 | 1.387 |
| 102.155833 | 2.277 |
| 102.180316 | 1.695 |
| 102.195668 | 1.859 |
| 102.215024 | 3.096 |
| 102.235645 | 3.581 |
| 102.260365 | 3.39 |
| 102.275744 | 4.212 |
| 102.295501 | 4.183 |
| 102.314807 | 3.254 |
| 102.338991 | 3.842 |
| 102.355638 | 4.24 |
| 102.375925 | 3.942 |
| 102.396253 | 4.599 |
| 102.420607 | 4 |
| 102.435894 | 4.926 |
| 102.455613 | 7.248 |
| 102.475798 | 7.178 |
| 102.501049 | 6.096 |
| 102.515616 | 6.172 |
| 102.535509 | 7.602 |
| 102.555646 | 7.246 |
| 102.582739 | 8.196 |
| 102.595433 | 7.808 |
| 102.614824 | 7.786 |
| 102.635692 | 7.749 |
| 102.664198 | 8.594 |
| 102.675898 | 8.785 |
| 102.697336 | 6.823 |
| 102.714865 | 6.728 |
| 102.742883 | 8.024 |
| 102.755969 | 8.719 |
| 102.775791 | 9.365 |
| 102.798917 | 9.059 |
| 102.823339 | 7.824 |
| 102.836472 | 7.217 |
| 102.855199 | 7.19 |
| 102.875867 | 7.768 |
| 102.923522 | 7.884 |
| 102.935647 | 8.05 |
| 102.955778 | 8.071 |
| 102.980017 | 8.956 |
| 102.996011 | 9.295 |
| 103.014917 | 9.893 |
| 103.035645 | 8.841 |
| 103.059878 | 7.635 |
| 103.07553 | 7.461 |
| 103.094985 | 7.568 |
| 103.115428 | 7.5 |
| 103.139435 | 8.051 |
| 103.155714 | 7.927 |
| 103.175794 | 7.192 |
| 103.195133 | 6.11 |
| 103.220194 | 5.019 |
| 103.236064 | 4.74 |
| 103.255664 | 5.04 |
| 103.276497 | 4.614 |
| 103.300922 | 4.325 |
| 103.315233 | 4.441 |
| 103.335728 | 4.2 |
| 103.355623 | 3.764 |
| 103.38132 | 3.135 |
| 103.395234 | 2.729 |
| 103.414861 | 2.749 |
| 103.435091 | 2.643 |
| 103.462237 | 2.238 |
| 103.475802 | 2.132 |
| 103.494974 | 2.402 |
| 103.515821 | 1.987 |
| 103.538949 | 1.262 |
| 103.555459 | 0.546 |
| 103.575792 | 0.488 |
| 103.595445 | 0.633 |
| 103.619269 | 0.535 |
| 103.636063 | -0.21 |
| 103.655618 | -0.315 |
| 103.675788 | -0.267 |
| 103.702687 | -0.665 |
| 103.714881 | -0.897 |
| 103.735454 | -0.858 |
| 103.755703 | -0.906 |
| 103.780956 | -1.06 |
| 103.795164 | -1.293 |
| 103.815008 | -1.41 |
| 103.835631 | -1.623 |
| 103.863084 | -2.165 |
| 103.875788 | -2.387 |
| 103.897407 | -2.03 |
| 103.915075 | -1.615 |
| 103.941715 | -2.195 |
| 103.955664 | -2.185 |
| 103.976022 | -2.495 |
| 103.996626 | -2.352 |
| 104.040594 | -1.784 |
| 104.055764 | -2.035 |
| 104.07579 | -2.036 |
| 104.10064 | -2.258 |
| 104.115795 | -2.219 |
| 104.135298 | -1.939 |
| 104.155623 | -1.478 |
| 104.178819 | -1.564 |
| 104.19553 | -1.43 |
| 104.214894 | -1.324 |
| 104.236272 | -0.745 |
| 104.260245 | -0.484 |
| 104.275581 | 0.037 |
| 104.294944 | -0.214 |
| 104.31476 | -0.071 |
| 104.338207 | -0.061 |
| 104.355692 | -0.13 |
| 104.375787 | 0.45 |
| 104.395253 | 0.972 |
| 104.421144 | 1.869 |
| 104.43584 | 2.314 |
| 104.45567 | 2.575 |
| 104.475786 | 2.718 |
| 104.502441 | 2.447 |
| 104.515227 | 2.89 |
| 104.535461 | 3.151 |
| 104.555598 | 3.598 |
| 104.583303 | 4.101 |
| 104.59523 | 4.516 |
| 104.614857 | 4.545 |
| 104.635676 | 4.661 |
| 104.663334 | 4.97 |
| 104.675809 | 5.181 |
| 104.69496 | 5.056 |
| 104.715679 | 5.019 |
| 104.739872 | 5.677 |
| 104.75636 | 6.564 |
| 104.77578 | 5.667 |
| 104.795249 | 6.509 |
| 104.82152 | 6.731 |
| 104.835713 | 6.74 |
| 104.855654 | 7.232 |
| 104.875782 | 8.015 |
| 104.9045 | 9.194 |
| 104.915139 | 9.482 |
| 104.935517 | 9.714 |
| 104.955617 | 10.364 |
| 104.984075 | 11.003 |
| 104.995365 | 10.693 |
| 105.014955 | 10.454 |
| 105.035598 | 10.686 |
| 105.064228 | 10.852 |
| 105.075819 | 10.735 |
| 105.097069 | 10.492 |
| 105.115081 | 10.319 |
| 105.160287 | 11.356 |
| 105.175937 | 11.472 |
| 105.196577 | 11.443 |
| 105.219584 | 11.733 |
| 105.23606 | 11.385 |
| 105.255612 | 11.414 |
| 105.275812 | 11.966 |
| 105.322891 | 12.288 |
| 105.335862 | 11.785 |
| 105.355618 | 11.767 |
| 105.402646 | 11.024 |
| 105.415734 | 10.899 |
| 105.43544 | 9.943 |
| 105.45977 | 9.296 |
| 105.475867 | 9.653 |
| 105.497097 | 9.615 |
| 105.514799 | 9.695 |
| 105.538087 | 9.936 |
| 105.556027 | 9.435 |
| 105.575781 | 8.303 |
| 105.59934 | 8.197 |
| 105.622437 | 7.628 |
| 105.635908 | 7.589 |
| 105.655607 | 7.503 |
| 105.675843 | 7.31 |
| 105.703174 | 6.886 |
| 105.714843 | 6.519 |
| 105.735443 | 5.882 |
| 105.756065 | 5.784 |
| 105.781175 | 5.454 |
| 105.794929 | 5.164 |
| 105.815321 | 4.459 |
| 105.835637 | 3.745 |
| 105.862909 | 3.309 |
| 105.875787 | 3.473 |
| 105.897424 | 3.802 |
| 105.914956 | 3.464 |
| 105.941293 | 2.489 |
| 105.956062 | 2.266 |
| 105.976052 | 2.217 |
| 105.996611 | 2.024 |
| 106.022006 | 1.589 |
| 106.035598 | 1.928 |
| 106.055878 | 1.859 |
| 106.07556 | 1.617 |
| 106.105489 | 1.23 |
| 106.11495 | 0.998 |
| 106.135396 | 0.766 |
| 106.155727 | 0.63 |
| 106.202186 | -0.308 |
| 106.214964 | -0.511 |
| 106.23535 | -0.559 |
| 106.257112 | -0.3 |
| 106.276051 | -0.194 |
| 106.297832 | -0.398 |
| 106.315275 | -0.369 |
| 106.337886 | -0.128 |
| 106.356129 | -0.419 |
| 106.375793 | -0.748 |
| 106.3975 | -0.674 |
| 106.420336 | -1.454 |
| 106.435459 | -1.648 |
| 106.455595 | -1.696 |
| 106.475259 | -1.534 |
| 106.501439 | -1.187 |
| 106.514817 | -1.176 |
| 106.535413 | -1.274 |
| 106.555698 | -1.392 |
| 106.5812 | -1.768 |
| 106.595014 | -1.343 |
| 106.614856 | -1.332 |
| 106.635618 | -1.051 |
| 106.661634 | -0.501 |
| 106.6758 | -0.279 |
| 106.695173 | -0.241 |
| 106.715671 | 0.946 |
| 106.738697 | 0.53 |
| 106.755771 | 0.836 |
| 106.775777 | 1.089 |
| 106.795343 | 1.117 |
| 106.820953 | 1.541 |
| 106.835697 | 1.774 |
| 106.855234 | 2.529 |
| 106.875763 | 3.465 |
| 106.901995 | 4.003 |
| 106.915203 | 4.09 |
| 106.935444 | 4.003 |
| 106.955608 | 4.129 |
| 106.982715 | 4.206 |
| 106.995278 | 4.402 |
| 107.014849 | 4.835 |
| 107.035611 | 5.02 |
| 107.062917 | 5.384 |
| 107.075789 | 5.539 |
| 107.096079 | 5.829 |
| 107.114897 | 5.848 |
| 107.145559 | 6.814 |
| 107.155766 | 7.501 |
| 107.175868 | 7.907 |
| 107.196703 | 7.482 |
| 107.2231 | 8.187 |
| 107.235704 | 8.489 |
| 107.255602 | 9.018 |
| 107.275152 | 8.809 |
| 107.322386 | 9.551 |
| 107.335681 | 9.783 |
| 107.355612 | 9.619 |
| 107.378716 | 9.417 |
| 107.395402 | 9.351 |
| 107.415132 | 9.506 |
| 107.435582 | 9.71 |
| 107.461684 | 9.951 |
| 107.475791 | 9.837 |
| 107.495384 | 10.06 |
| 107.514976 | 10.368 |
| 107.537951 | 10.439 |
| 107.555686 | 10.468 |
| 107.575856 | 10.718 |
| 107.595444 | 11.182 |
| 107.620224 | 11.134 |
| 107.635957 | 11.202 |
| 107.655607 | 11.493 |
| 107.67578 | 12.084 |
| 107.702477 | 12.159 |
| 107.714906 | 11.482 |
| 107.735741 | 11.019 |
| 107.755748 | 11.427 |
| 107.782517 | 11.487 |
| 107.795129 | 11.748 |
| 107.81486 | 11.402 |
| 107.835768 | 9.431 |
| 107.8633 | 9.19 |
| 107.87578 | 9.392 |
| 107.896218 | 9.615 |
| 107.914927 | 9.655 |
| 107.943183 | 9.548 |
| 107.955506 | 9.23 |
| 107.975802 | 8.865 |
| 107.998476 | 8.488 |
| 108.023412 | 8.275 |
| 108.035642 | 7.85 |
| 108.055629 | 7.735 |
| 108.075778 | 7.456 |
| 108.105083 | 6.315 |
| 108.114846 | 6.169 |
| 108.135405 | 5.948 |
| 108.155607 | 5.349 |
| 108.185486 | 4.866 |
| 108.194877 | 4.663 |
| 108.214939 | 4.257 |
| 108.23575 | 4.161 |
| 108.265658 | 3.649 |
| 108.275766 | 3.619 |
| 108.297167 | 3.193 |
| 108.314868 | 3.174 |
| 108.342445 | 3.193 |
| 108.355719 | 2.729 |
| 108.375438 | 2.662 |
| 108.398467 | 2.323 |
| 108.442854 | 2.16 |
| 108.455857 | 2.159 |
| 108.475784 | 1.773 |
| 108.50218 | 1.23 |
| 108.514778 | 0.612 |
| 108.535456 | 0.437 |
| 108.555612 | 0.436 |
| 108.58266 | 0.165 |
| 108.595695 | 0.087 |
| 108.614956 | 0.048 |
| 108.635612 | -0.01 |
| 108.662271 | -0.002 |
| 108.675467 | -0.117 |
| 108.695387 | -0.611 |
| 108.714913 | -0.823 |
| 108.738762 | -0.776 |
| 108.755731 | -0.786 |
| 108.775895 | -1.116 |
| 108.79536 | -1.531 |
| 108.822124 | -0.913 |
| 108.83572 | -0.806 |
| 108.855642 | -0.661 |
| 108.875151 | -0.468 |
| 108.903456 | -0.953 |
| 108.914759 | -1.089 |
| 108.935685 | -1.156 |
| 108.955615 | -1.727 |
| 108.983538 | -1.1 |
| 108.995328 | -0.821 |
| 109.014983 | -0.386 |
| 109.036071 | -0.714 |
| 109.063896 | -0.503 |
| 109.075847 | -0.021 |
| 109.0967 | 0.859 |
| 109.115168 | 1.389 |
| 109.143194 | 1.94 |
| 109.155887 | 2.026 |
| 109.175783 | 1.474 |
| 109.197446 | 2.411 |
| 109.22293 | 2.848 |
| 109.235718 | 2.372 |
| 109.255705 | 2.245 |
| 109.275785 | 2.855 |
| 109.305232 | 3.396 |
| 109.314842 | 3.367 |
| 109.335834 | 2.989 |
| 109.355911 | 4.117 |
| 109.382122 | 7.108 |
| 109.396476 | 6.813 |
| 109.414949 | 5.62 |
| 109.43561 | 3.665 |
| 109.466382 | 2.001 |
| 109.475766 | 1.876 |
| 109.496586 | 1.329 |
| 109.514847 | 2.771 |
| 109.562622 | 4.993 |
| 109.575893 | 6.508 |
| 109.597431 | 6.516 |
| 109.621372 | 6.463 |
| 109.636114 | 7.602 |
| 109.655694 | 9.077 |
| 109.675828 | 8.912 |
| 109.703319 | 7.619 |
| 109.715922 | 7.907 |
| 109.735373 | 8.934 |
| 109.755599 | 8.288 |
| 109.783454 | 7.369 |
| 109.794956 | 6.637 |
| 109.814861 | 7.574 |
| 109.835698 | 8.615 |
| 109.863858 | 9.447 |
| 109.875775 | 9.401 |
| 109.896451 | 7.778 |
| 109.914866 | 8.996 |
| 109.94312 | 10.429 |
| 109.95568 | 10.12 |
| 109.975786 | 9.378 |
| 109.998992 | 9.299 |
| 110.02426 | 10.745 |
| 110.035532 | 11.005 |
| 110.055714 | 10.694 |
| 110.075806 | 10.939 |
| 110.105873 | 8.309 |
| 110.114689 | 7.253 |
| 110.135418 | 7.048 |
| 110.155655 | 7.545 |
| 110.18725 | 7.317 |
| 110.194768 | 6.575 |
| 110.214857 | 5.608 |
| 110.235761 | 5.915 |
| 110.265241 | 6.883 |
| 110.275766 | 7.279 |
| 110.296798 | 7.753 |
| 110.314854 | 8.527 |
| 110.342795 | 9.561 |
| 110.355769 | 9.858 |
| 110.375679 | 9.527 |
| 110.395485 | 8.736 |
| 110.422436 | 7.752 |
| 110.435706 | 7.434 |
| 110.455682 | 7.164 |
| 110.475779 | 6.73 |
| 110.506377 | 6.314 |
| 110.514709 | 5.888 |
| 110.535325 | 4.991 |
| 110.555607 | 4.268 |
| 110.602861 | 3.747 |
| 110.615032 | 3.457 |
| 110.635295 | 2.935 |
| 110.660846 | 2.287 |
| 110.675742 | 2.16 |
| 110.696789 | 2.336 |
| 110.71487 | 2.287 |
| 110.739873 | 1.978 |
| 110.756 | 1.417 |
| 110.775766 | 1.078 |
| 110.798864 | 1.145 |
| 110.823253 | 0.689 |
| 110.835786 | 0.293 |
| 110.8556 | 0.003 |
| 110.875386 | -0.017 |
| 110.903068 | 0.389 |
| 110.914992 | 0.272 |
| 110.93543 | 0.389 |
| 110.955597 | 0.224 |
| 110.983484 | -0.433 |
| 110.995035 | -0.394 |
| 111.014894 | -0.192 |
| 111.035593 | -0.357 |
| 111.063963 | -0.28 |
| 111.075774 | -0.291 |
| 111.096778 | -0.222 |
| 111.11485 | -0.233 |
| 111.143378 | -1.114 |
| 111.155466 | -1.278 |
| 111.175442 | -1.636 |
| 111.196329 | -1.443 |
| 111.224148 | -1.763 |
| 111.235741 | -1.579 |
| 111.2556 | -1.233 |
| 111.27585 | -1.118 |
| 111.305163 | -1.254 |
| 111.314741 | -1.477 |
| 111.335387 | -0.714 |
| 111.355727 | -0.126 |
| 111.383559 | -0.569 |
| 111.395964 | -0.058 |
| 111.414993 | -0.02 |
| 111.435616 | -0.398 |
| 111.464012 | -0.437 |
| 111.475764 | 0.249 |
| 111.497792 | 0.692 |
| 111.514894 | 1.368 |
| 111.541949 | 1.523 |
| 111.555944 | 1.9 |
| 111.576002 | 2.006 |
| 111.596724 | 2.199 |
| 111.625628 | 2.323 |
| 111.635775 | 2.188 |
| 111.655692 | 2.235 |
| 111.675507 | 1.743 |
| 111.723682 | 3 |
| 111.735632 | 3.889 |
| 111.755602 | 4.489 |
| 111.782307 | 4.42 |
| 111.79519 | 4.574 |
| 111.815237 | 5.106 |
| 111.835523 | 5.446 |
| 111.862765 | 5.398 |
| 111.875767 | 5.223 |
| 111.895461 | 5.166 |
| 111.915728 | 5.012 |
| 111.939611 | 5.214 |
| 111.955916 | 5.989 |
| 111.975842 | 7.089 |
| 111.995587 | 7.396 |
| 112.021932 | 7.397 |
| 112.035775 | 8.085 |
| 112.0556 | 8.608 |
| 112.075767 | 8.828 |
| 112.104085 | 10.173 |
| 112.115044 | 10.075 |
| 112.135747 | 10.037 |
| 112.155565 | 10.23 |
| 112.183525 | 10.561 |
| 112.194837 | 11.093 |
| 112.215142 | 10.493 |
| 112.235718 | 11.093 |
| 112.265143 | 11.933 |
| 112.275763 | 11.14 |
| 112.297247 | 10.939 |
| 112.314961 | 11.355 |
| 112.343998 | 11.142 |
| 112.355686 | 11.694 |
| 112.375808 | 11.837 |
| 112.397037 | 11.646 |
| 112.423262 | 11.844 |
| 112.435668 | 11.793 |
| 112.455584 | 11.979 |
| 112.475774 | 12.374 |
| 112.527447 | 12.037 |
| 112.53585 | 12.086 |
| 112.555594 | 11.498 |
| 112.583602 | 10.975 |
| 112.595188 | 11.423 |
| 112.615155 | 9.963 |
| 112.6356 | 9.422 |
| 112.666973 | 8.757 |
| 112.675856 | 9.094 |
| 112.697335 | 9.037 |
| 112.715115 | 8.592 |
| 112.744145 | 8.845 |
| 112.75569 | 9.155 |
| 112.775752 | 9.484 |
| 112.795445 | 8.537 |
| 112.84278 | 6.933 |
| 112.855859 | 6.593 |
| 112.87518 | 6.092 |
| 112.90238 | 6.575 |
| 112.915194 | 6.739 |
| 112.935774 | 6.576 |
| 112.955562 | 6.12 |
| 112.982627 | 5.368 |
| 112.996125 | 4.799 |
| 113.015107 | 4.209 |
| 113.035565 | 3.765 |
| 113.062917 | 3.6 |
| 113.075827 | 3.659 |
| 113.096681 | 3.765 |
| 113.115258 | 3.426 |
| 113.141708 | 2.431 |
| 113.155714 | 2.064 |
| 113.175771 | 1.349 |
| 113.197088 | 1.204 |
| 113.221868 | 1.349 |
| 113.236276 | 1.32 |
| 113.255639 | 0.74 |
| 113.275785 | 0.954 |
| 113.304093 | 0.247 |
| 113.314741 | 0.4 |
| 113.335312 | 0.572 |
| 113.356526 | 0.522 |
| 113.382531 | -0.125 |
| 113.395524 | -0.145 |
| 113.414929 | -0.086 |
| 113.435642 | -0.085 |
| 113.464386 | -0.822 |
| 113.47576 | -0.822 |
| 113.496801 | -0.472 |
| 113.514857 | -0.221 |
| 113.542312 | -0.435 |
| 113.555808 | -0.698 |
| 113.575883 | -0.41 |
| 113.599218 | 0.179 |
| 113.624908 | 0.142 |
| 113.635941 | 0.131 |
| 113.655592 | -0.323 |
| 113.67577 | -0.519 |
| 113.706307 | -0.82 |
| 113.715826 | -0.974 |
| 113.735411 | -0.241 |
| 113.755588 | 0.398 |
| 113.785925 | 1.615 |
| 113.794843 | 1.528 |
| 113.814894 | 1.789 |
| 113.835051 | 2.503 |
| 113.865547 | 2.686 |
| 113.875767 | 2.512 |
| 113.897314 | 2.096 |
| 113.914874 | 1.766 |
| 113.962634 | 1.842 |
| 113.975776 | 2.151 |
| 113.996905 | 3.426 |
| 114.020658 | 4.2 |
| 114.035328 | 4.007 |
| 114.056241 | 3.765 |
| 114.075762 | 2.943 |
| 114.102403 | 2.973 |
| 114.115244 | 3.108 |
| 114.135378 | 4.13 |
| 114.155636 | 5.038 |
| 114.181862 | 5.85 |
| 114.19538 | 5.842 |
| 114.214851 | 6.325 |
| 114.235685 | 6.613 |
| 114.262283 | 6.749 |
| 114.275772 | 6.97 |
| 114.295299 | 6.931 |
| 114.314992 | 7.011 |
| 114.340704 | 8.065 |
| 114.355541 | 7.841 |
| 114.375767 | 8.257 |
| 114.394697 | 9.273 |
| 114.418824 | 9.572 |
| 114.437463 | 9.417 |
| 114.455273 | 8.772 |
| 114.475026 | 8.985 |
| 114.503812 | 9.663 |
| 114.514886 | 9.798 |
| 114.535387 | 9.374 |
| 114.55563 | 8.9 |
| 114.586425 | 8.891 |
| 114.614796 | 10.188 |
| 114.641475 | 10.834 |
| 114.675361 | 10.546 |
| 114.695375 | 10.885 |
| 114.714838 | 11.175 |
| 114.742205 | 10.759 |
| 114.755735 | 10.393 |
| 114.775789 | 10.365 |
| 114.799089 | 10.231 |
| 114.825131 | 10.365 |
| 114.835798 | 10.076 |
| 114.855298 | 10.279 |
| 114.875855 | 10.173 |
| 114.904885 | 9.759 |
| 114.914867 | 9.595 |
| 114.935518 | 9.306 |
| 114.955721 | 9.75 |
| 115.005388 | 10.139 |
| 115.035411 | 9.056 |
| 115.05842 | 8.409 |
| 115.076125 | 8.15 |
| 115.097235 | 8.71 |
| 115.115106 | 8.855 |
| 115.13661 | 8.509 |
| 115.155747 | 7.92 |
| 115.175769 | 7.312 |
| 115.197357 | 7.032 |
| 115.220614 | 6.993 |
| 115.236464 | 6.444 |
| 115.255596 | 5.786 |
| 115.275766 | 4.868 |
| 115.301733 | 4.153 |
| 115.314796 | 4.105 |
| 115.335305 | 3.882 |
| 115.355596 | 3.931 |
| 115.382557 | 3.787 |
| 115.395472 | 3.623 |
| 115.414852 | 3.197 |
| 115.435424 | 2.714 |
| 115.462541 | 2.395 |
| 115.475776 | 2.249 |
| 115.495082 | 1.756 |
| 115.515735 | 0.972 |
| 115.539476 | 0.817 |
| 115.555775 | 0.692 |
| 115.575761 | 0.576 |
| 115.595184 | 0.326 |
| 115.623126 | 0.122 |
| 115.635769 | 0.17 |
| 115.655584 | 0.14 |
| 115.675761 | -0.914 |
| 115.703671 | -1.378 |
| 115.714824 | -1.581 |
| 115.735363 | -1.794 |
| 115.755349 | -1.534 |
| 115.780952 | -1.573 |
| 115.794846 | -1.438 |
| 115.814848 | -1.389 |
| 115.835668 | -1.4 |
| 115.863676 | -1.606 |
| 115.875743 | -1.674 |
| 115.897444 | -1.876 |
| 115.914893 | -1.752 |
| 115.941688 | -2.004 |
| 115.955702 | -1.945 |
| 115.976431 | -2.004 |
| 115.996739 | -2.111 |
| 116.023193 | -2.392 |
| 116.03593 | -2.681 |
| 116.055718 | -2.855 |
| 116.075795 | -2.701 |
| 116.123532 | -2.005 |
| 116.135865 | -2.305 |
| 116.155595 | -2.479 |
| 116.178201 | -2.403 |
| 116.195246 | -1.62 |
| 116.215062 | -0.654 |
| 116.235724 | -0.191 |
| 116.259462 | -0.665 |
| 116.275889 | -0.723 |
| 116.294984 | -0.356 |
| 116.31501 | 0.658 |
| 116.337488 | 1.304 |
| 116.356197 | 1.274 |
| 116.375787 | 1.641 |
| 116.395441 | 2.066 |
| 116.420431 | 2.394 |
| 116.435904 | 3.003 |
| 116.455572 | 3.138 |
| 116.475766 | 3.447 |
| 116.50161 | 3.399 |
| 116.515276 | 3.553 |
| 116.535778 | 3.369 |
| 116.555556 | 3.148 |
| 116.58212 | 3.7 |
| 116.595903 | 3.922 |
| 116.614865 | 4.416 |
| 116.635721 | 4.946 |
| 116.664298 | 4.763 |
| 116.675766 | 4.444 |
| 116.696398 | 4.685 |
| 116.714821 | 5.291 |
| 116.742656 | 5.611 |
| 116.75565 | 5.516 |
| 116.775814 | 5.972 |
| 116.799384 | 6.805 |
| 116.823271 | 8.146 |
| 116.835847 | 8.542 |
| 116.855301 | 8.727 |
| 116.875903 | 9.103 |
| 116.90366 | 9.508 |
| 116.914764 | 9.565 |
| 116.935313 | 9.345 |
| 116.955581 | 9.907 |
| 116.983322 | 9.289 |
| 116.995232 | 9.695 |
| 117.014768 | 9.319 |
| 117.035641 | 9.3 |
| 117.063855 | 8.683 |
| 117.075759 | 9.243 |
| 117.095436 | 9.408 |
| 117.114862 | 9.921 |
| 117.147379 | 10.32 |
| 117.155711 | 10.145 |
| 117.175766 | 10.377 |
| 117.195157 | 10.695 |
| 117.2393 | 11.351 |
| 117.255698 | 11.275 |
| 117.276034 | 11.304 |
| 117.299298 | 11.266 |
| 117.315585 | 10.745 |
| 117.335415 | 10.292 |
| 117.355593 | 10.34 |
| 117.3812 | 10.834 |
| 117.394941 | 10.805 |
| 117.41486 | 10.497 |
| 117.43555 | 9.795 |
| 117.461997 | 8.99 |
| 117.475776 | 8.799 |
| 117.495069 | 8.334 |
| 117.515602 | 8.181 |
| 117.538885 | 7.784 |
| 117.555658 | 7.727 |
| 117.575771 | 7.398 |
| 117.594853 | 7.661 |
| 117.620263 | 7.719 |
| 117.636305 | 7.43 |
| 117.655526 | 6.511 |
| 117.675765 | 6.348 |
| 117.702667 | 5.776 |
| 117.71481 | 5.854 |
| 117.735283 | 5.361 |
| 117.755766 | 4.772 |
| 117.780999 | 3.69 |
| 117.795022 | 3.893 |
| 117.814864 | 3.835 |
| 117.8356 | 4.065 |
| 117.862959 | 3.873 |
| 117.875763 | 3.109 |
| 117.895123 | 1.931 |
| 117.915236 | 1.583 |
| 117.940061 | 1.727 |
| 117.955635 | 2.075 |
| 117.975989 | 1.929 |
| 117.9961 | 1.483 |
| 118.022652 | 0.834 |
| 118.035782 | 1.047 |
| 118.055581 | 0.71 |
| 118.075769 | 0.701 |
| 118.103517 | 0.313 |
| 118.115028 | 0.4 |
| 118.135294 | 0.312 |
| 118.155592 | -0.036 |
| 118.183407 | -0.423 |
| 118.195242 | -0.414 |
| 118.214974 | -0.405 |
| 118.235658 | -0.58 |
| 118.262371 | -0.966 |
| 118.275405 | -1.431 |
| 118.29744 | -1.451 |
| 118.314847 | -1.662 |
| 118.360514 | -1.378 |
| 118.376107 | -1.349 |
| 118.396858 | -1.244 |
| 118.419562 | -0.613 |
| 118.435564 | -0.401 |
| 118.455674 | -0.546 |
| 118.475755 | -0.47 |
| 118.501697 | -0.286 |
| 118.514828 | -0.315 |
| 118.535275 | -0.142 |
| 118.555642 | 0.07 |
| 118.5817 | 0.425 |
| 118.595896 | 0.57 |
| 118.614868 | 1.024 |
| 118.635594 | 1.304 |
| 118.661052 | 1.758 |
| 118.675885 | 1.979 |
| 118.695383 | 2.163 |
| 118.715452 | 2.645 |
| 118.738805 | 2.838 |
| 118.755621 | 2.915 |
| 118.775822 | 2.694 |
| 118.794969 | 2.983 |
| 118.820689 | 3.428 |
| 118.835626 | 3.476 |
| 118.855586 | 4.055 |
| 118.875752 | 4.307 |
| 118.902346 | 4.711 |
| 118.914904 | 4.683 |
| 118.935359 | 4.422 |
| 118.955573 | 4.384 |
| 118.982345 | 5.427 |
| 118.995036 | 5.766 |
| 119.014797 | 5.949 |
| 119.03591 | 5.794 |
| 119.06351 | 5.688 |
| 119.075762 | 5.621 |
| 119.095721 | 6.297 |
| 119.115137 | 7.07 |
| 119.140438 | 7.428 |
| 119.155818 | 7.486 |
| 119.17576 | 9.292 |
| 119.197284 | 8.79 |
| 119.221353 | 9.456 |
| 119.235531 | 9.495 |
| 119.255607 | 9.478 |
| 119.275759 | 9.443 |
| 119.305264 | 9.965 |
| 119.314859 | 10.206 |
| 119.335327 | 10.639 |
| 119.355559 | 10.853 |
| 119.400675 | 8.863 |
| 119.415138 | 9.154 |
| 119.43531 | 9.812 |
| 119.45815 | 10.227 |
| 119.475841 | 10.701 |
| 119.497262 | 10.876 |
| 119.514837 | 11.118 |
| 119.536109 | 11.272 |
| 119.555626 | 11.069 |
| 119.57576 | 10.558 |
| 119.599017 | 10.781 |
| 119.621455 | 10.936 |
| 119.636456 | 10.61 |
| 119.655577 | 10.437 |
| 119.675755 | 10.465 |
| 119.701276 | 9.77 |
| 119.715636 | 9.278 |
| 119.735613 | 9.473 |
| 119.755565 | 8.903 |
| 119.78105 | 9.348 |
| 119.795033 | 9.446 |
| 119.81492 | 9.271 |
| 119.835614 | 7.909 |
| 119.862526 | 7.456 |
| 119.875798 | 7.456 |
| 119.895328 | 7.592 |
| 119.915859 | 7.66 |
| 119.939754 | 7.661 |
| 119.955597 | 7.941 |
| 119.975848 | 7.419 |
| 119.995056 | 6.743 |
| 120.022302 | 5.805 |
| 120.035857 | 5.776 |
| 120.055501 | 5.699 |
| 120.075772 | 5.41 |
| 120.103352 | 4.376 |
| 120.115164 | 3.99 |
| 120.135359 | 3.912 |
| 120.15563 | 3.864 |
| 120.183037 | 3.419 |
| 120.195035 | 3.091 |
| 120.214851 | 2.946 |
| 120.235626 | 1.177 |
| 120.263681 | 0.693 |
| 120.275843 | 0.423 |
| 120.296669 | 0.954 |
| 120.314822 | 0.692 |
| 120.339772 | 0.488 |
| 120.355788 | 0.085 |
| 120.375782 | -0.235 |
| 120.395251 | -0.438 |
| 120.420657 | -0.459 |
| 120.435416 | -0.827 |
| 120.455721 | -1.329 |
| 120.475759 | -1.445 |
| 120.523122 | -1.552 |
| 120.5358 | -1.601 |
| 120.555587 | -1.708 |
| 120.579912 | -1.602 |
| 120.595997 | -1.661 |
| 120.615186 | -1.661 |
| 120.635571 | -1.826 |
| 120.660282 | -1.981 |
| 120.67581 | -2.262 |
| 120.695424 | -2.302 |
| 120.715195 | -2.294 |
| 120.739097 | -2.576 |
| 120.755929 | -2.596 |
| 120.775753 | -1.88 |
| 120.795559 | -1.32 |
| 120.820432 | -1.455 |
| 120.835653 | -1.716 |
| 120.855461 | -2.064 |
| 120.875755 | -1.87 |
| 120.901701 | -1.628 |
| 120.915067 | -1.648 |
| 120.935454 | -1.417 |
| 120.95558 | -1.621 |
| 120.981989 | -1.497 |
| 120.995152 | -1.314 |
| 121.01476 | -1.033 |
| 121.035576 | -0.502 |
| 121.062135 | -1.004 |
| 121.075759 | -0.83 |
| 121.094787 | -0.213 |
| 121.115853 | 0.213 |
| 121.139518 | 0.937 |
| 121.155668 | 1.245 |
| 121.175763 | 1.864 |
| 121.195014 | 2.105 |
| 121.22177 | 3.022 |
| 121.235675 | 3.679 |
| 121.255572 | 3.891 |
| 121.275785 | 3.755 |
| 121.301949 | 2.681 |
| 121.315883 | 2.827 |
| 121.335569 | 3.194 |
| 121.355669 | 4.045 |
| 121.382625 | 4.219 |
| 121.395474 | 4.626 |
| 121.414871 | 5.205 |
| 121.435579 | 5.15 |
| 121.464086 | 5.409 |
| 121.475769 | 5.564 |
| 121.497725 | 5.807 |
| 121.514799 | 5.661 |
| 121.542214 | 6.252 |
| 121.555631 | 6.678 |
| 121.576374 | 6.686 |
| 121.599065 | 7.547 |
| 121.642884 | 7.365 |
| 121.655719 | 7.657 |
| 121.67578 | 8.052 |
| 121.700832 | 8.69 |
| 121.715532 | 9.222 |
| 121.735379 | 9.694 |
| 121.755581 | 9.471 |
| 121.778945 | 9.319 |
| 121.79601 | 9.232 |
| 121.815149 | 9.029 |
| 121.835475 | 10.294 |
| 121.861053 | 10.64 |
| 121.875757 | 10.566 |
| 121.895606 | 10.905 |
| 121.916014 | 10.78 |
| 121.939103 | 11.107 |
| 121.955648 | 11.061 |
| 121.975762 | 11.524 |
| 121.995587 | 11.042 |
| 122.02112 | 9.566 |
| 122.03573 | 9.963 |
| 122.055583 | 10.483 |
| 122.075817 | 10.32 |
| 122.102137 | 9.471 |
| 122.115234 | 9.306 |
| 122.135229 | 9.202 |
| 122.155616 | 8.334 |
| 122.182564 | 8.798 |
| 122.195254 | 8.759 |
| 122.214844 | 8.364 |
| 122.235589 | 8.355 |
| 122.261935 | 7.631 |
| 122.275827 | 7.582 |
| 122.295077 | 7.194 |
| 122.314718 | 6.799 |
| 122.339665 | 6.984 |
| 122.355742 | 7.313 |
| 122.375749 | 7.216 |
| 122.39597 | 7.16 |
| 122.420485 | 6.666 |
| 122.435668 | 6.008 |
| 122.455568 | 5.709 |
| 122.475755 | 4.919 |
| 122.503606 | 3.979 |
| 122.515786 | 4.088 |
| 122.535553 | 3.943 |
| 122.555517 | 3.991 |
| 122.584074 | 3.477 |
| 122.595665 | 2.966 |
| 122.614925 | 2.453 |
| 122.635569 | 2.086 |
| 122.664475 | 2.077 |
| 122.675842 | 2.077 |
| 122.696959 | 1.777 |
| 122.715047 | 1.313 |
| 122.764538 | 0.355 |
| 122.775991 | 0.268 |
| 122.796761 | 0.093 |
| 122.819963 | -0.323 |
| 122.835512 | -0.642 |
| 122.855586 | -0.979 |
| 122.875751 | -0.719 |
| 122.902548 | -0.594 |
| 122.915264 | -0.671 |
| 122.935377 | -0.759 |
| 122.955533 | -0.808 |
| 122.982156 | -0.847 |
| 122.995693 | -0.8 |
| 123.014703 | -0.975 |
| 123.035573 | -1.072 |
| 123.063172 | -1.305 |
| 123.075347 | -1.439 |
| 123.094699 | -1.4 |
| 123.115075 | -1.458 |
| 123.140906 | -1.469 |
| 123.155796 | -1.82 |
| 123.175755 | -1.994 |
| 123.19526 | -1.919 |
| 123.222157 | -1.62 |
| 123.235982 | -1.407 |
| 123.255565 | -1.079 |
| 123.275762 | -1.099 |
| 123.300445 | -1.215 |
| 123.315119 | -1.243 |
| 123.335342 | -0.731 |
| 123.355583 | -0.364 |
| 123.383324 | -1.04 |
| 123.395249 | -0.82 |
| 123.414881 | -0.125 |
| 123.435681 | 1.419 |
| 123.464177 | 1.243 |
| 123.475751 | 0.906 |
| 123.496572 | 1.937 |
| 123.515061 | 2.277 |
| 123.543563 | 3.079 |
| 123.555673 | 3.108 |
| 123.575748 | 3.232 |
| 123.599219 | 2.817 |
| 123.625297 | 2.288 |
| 123.635751 | 2.441 |
| 123.655567 | 2.229 |
| 123.675746 | 2.114 |
| 123.705429 | 2.035 |
| 123.715296 | 2.132 |
| 123.73538 | 3.697 |
| 123.755641 | 4.219 |
| 123.803231 | 4.189 |
| 123.815202 | 4.7 |
| 123.835708 | 7.383 |
| 123.859077 | 7.602 |
| 123.875842 | 3.95 |
| 123.897955 | 4.346 |
| 123.915076 | 2.259 |
| 123.93814 | 1.474 |
| 123.955619 | 4.021 |
| 123.975937 | 3.376 |
| 123.99986 | 3.922 |
| 124.022882 | 3.871 |
| 124.036333 | 4.654 |
| 124.055514 | 7.611 |
| 124.07576 | 7.933 |
| 124.115381 | 8.187 |
| 124.135255 | 8.853 |
| 124.155695 | 8.416 |
| 124.182968 | 7.67 |
| 124.195134 | 7.486 |
| 124.214839 | 6.969 |
| 124.235691 | 7.344 |
| 124.261967 | 9.055 |
| 124.275843 | 9.01 |
| 124.295257 | 8.788 |
| 124.31508 | 8.894 |
| 124.339666 | 8.69 |
| 124.355766 | 8.796 |
| 124.374996 | 7.747 |
| 124.395687 | 6.755 |
| 124.422848 | 7.603 |
| 124.435869 | 8.261 |
| 124.45563 | 7.88 |
| 124.475751 | 7.931 |
| 124.504029 | 7.585 |
| 124.515385 | 6.899 |
| 124.535389 | 5.912 |
| 124.555591 | 6.872 |
| 124.583987 | 4.537 |
| 124.594915 | 3.583 |
| 124.61488 | 6.08 |
| 124.635618 | 4.537 |
| 124.664229 | 2.283 |
| 124.675949 | 2.409 |
| 124.696593 | 3.591 |
| 124.715098 | 5.668 |
| 124.742139 | 6.18 |
| 124.755613 | 6.334 |
| 124.775531 | 7.91 |
| 124.798898 | 9.503 |
| 124.825751 | 9.378 |
| 124.835792 | 8.77 |
| 124.855576 | 7.001 |
| 124.875777 | 6.074 |
| 124.926564 | 6.035 |
| 124.93662 | 5.542 |
| 124.955557 | 5.108 |
| 124.982039 | 4.287 |
| 124.995026 | 4.266 |
| 125.014824 | 3.774 |
| 125.035607 | 3.562 |
| 125.063153 | 2.837 |
| 125.075761 | 2.47 |
| 125.097093 | 2.276 |
| 125.115159 | 1.996 |
| 125.1401 | 1.542 |
| 125.155786 | 1.233 |
| 125.175786 | 0.933 |
| 125.196783 | 0.623 |
| 125.221486 | 0.313 |
| 125.235746 | 0.236 |
| 125.255634 | 0.053 |
| 125.275797 | 0.015 |
| 125.304341 | -0.393 |
| 125.314949 | -0.365 |
| 125.335713 | -0.587 |
| 125.355685 | -0.964 |
| 125.384386 | -0.896 |
| 125.394982 | -0.877 |
| 125.414782 | -0.54 |
| 125.435199 | -0.357 |
| 125.463925 | -0.589 |
| 125.475881 | -0.686 |
| 125.49698 | -0.764 |
| 125.514905 | -0.736 |
| 125.541599 | -0.565 |
| 125.55587 | -0.71 |
| 125.575734 | -0.497 |
| 125.599374 | -0.285 |
| 125.624906 | -0.556 |
| 125.636015 | -0.595 |
| 125.655559 | -0.363 |
| 125.675741 | 0.032 |
| 125.704846 | 0.032 |
| 125.715341 | -0.201 |
| 125.735408 | -0.125 |
| 125.755448 | 0.069 |
| 125.784897 | 0.078 |
| 125.795128 | 0.039 |
| 125.81512 | 0.125 |
| 125.835602 | 1.139 |
| 125.865273 | 1.169 |
| 125.875742 | 1.458 |
| 125.896901 | 1.689 |
| 125.914844 | 2.17 |
| 125.943419 | 3.282 |
| 125.955673 | 3.676 |
| 125.976073 | 3.967 |
| 125.996579 | 3.929 |
| 126.042348 | 4.084 |
| 126.056053 | 4.354 |
| 126.075754 | 4.576 |
| 126.103051 | 4.982 |
| 126.11528 | 4.952 |
| 126.135387 | 4.584 |
| 126.155576 | 4.633 |
| 126.181317 | 5.492 |
| 126.194931 | 5.869 |
| 126.215124 | 6.033 |
| 126.23572 | 5.803 |
| 126.261619 | 7.212 |
| 126.275175 | 7.965 |
| 126.295085 | 8.459 |
| 126.315041 | 7.543 |
| 126.341669 | 7.766 |
| 126.355751 | 8.123 |
| 126.375742 | 8.626 |
| 126.395469 | 8.558 |
| 126.423191 | 9.428 |
| 126.435904 | 9.178 |
| 126.455669 | 9.072 |
| 126.475744 | 9.439 |
| 126.504812 | 10.281 |
| 126.515058 | 9.759 |
| 126.535389 | 9.345 |
| 126.555494 | 9.268 |
| 126.583428 | 10.397 |
| 126.594948 | 10.861 |
| 126.614771 | 10.949 |
| 126.63556 | 11.103 |
| 126.665679 | 11.267 |
| 126.675852 | 11.481 |
| 126.696554 | 12.1 |
| 126.714835 | 12.525 |
| 126.766885 | 11.146 |
| 126.775687 | 11.107 |
| 126.798075 | 11.292 |
| 126.823941 | 11.718 |
| 126.835698 | 10.502 |
| 126.855613 | 10.106 |
| 126.875732 | 10.108 |
| 126.905469 | 9.965 |
| 126.91516 | 10.139 |
| 126.935373 | 9.85 |
| 126.955589 | 9.936 |
| 126.985732 | 8.334 |
| 126.994954 | 8.17 |
| 127.014784 | 8.092 |
| 127.035574 | 8.429 |
| 127.066692 | 8.275 |
| 127.075708 | 8.132 |
| 127.097487 | 8.036 |
| 127.114815 | 7.891 |
| 127.163665 | 7.235 |
| 127.175761 | 6.81 |
| 127.196726 | 6.569 |
| 127.221598 | 6.849 |
| 127.235521 | 6.492 |
| 127.255535 | 5.951 |
| 127.275751 | 5.564 |
| 127.303048 | 4.888 |
| 127.314843 | 4.801 |
| 127.33533 | 4.887 |
| 127.355643 | 4.491 |
| 127.383685 | 3.524 |
| 127.394919 | 3.128 |
| 127.415119 | 2.684 |
| 127.435505 | 2.656 |
| 127.463245 | 2.568 |
| 127.475734 | 2.423 |
| 127.496467 | 2.161 |
| 127.515143 | 1.901 |
| 127.541681 | 1.716 |
| 127.55575 | 1.62 |
| 127.575409 | 1.765 |
| 127.59932 | 0.914 |
| 127.624843 | 0.315 |
| 127.635788 | -0.139 |
| 127.655578 | -0.216 |
| 127.675808 | -0.177 |
| 127.704555 | -0.198 |
| 127.715165 | -0.335 |
| 127.735243 | -0.847 |
| 127.755564 | -1.341 |
| 127.785327 | -1.322 |
| 127.795129 | -1.226 |
| 127.815003 | -1.401 |
| 127.835567 | -1.247 |
| 127.864575 | -0.918 |
| 127.875737 | -1.082 |
| 127.897115 | -1.285 |
| 127.91496 | -1.289 |
| 127.943023 | -1.356 |
| 127.955691 | -1.609 |
| 127.975739 | -1.647 |
| 127.997021 | -1.309 |
| 128.024526 | -1.358 |
| 128.035866 | -1.388 |
| 128.055565 | -1.377 |
| 128.075739 | -1.04 |
| 128.1059 | -0.674 |
| 128.114734 | -0.694 |
| 128.135368 | -0.22 |
| 128.155575 | 0.137 |
| 128.202495 | 1.025 |
| 128.214826 | 1.517 |
| 128.235278 | 1.546 |
| 128.259507 | 1.776 |
| 128.275823 | 1.844 |
| 128.297769 | 1.573 |
| 128.314863 | 1.707 |
| 128.337691 | 1.881 |
| 128.355795 | 2.113 |
| 128.37574 | 2.828 |
| 128.39755 | 3.05 |
| 128.421493 | 3.301 |
| 128.435574 | 3.455 |
| 128.455631 | 3.476 |
| 128.475743 | 3.261 |
| 128.5027 | 3.582 |
| 128.516445 | 4.074 |
| 128.535728 | 4.228 |
| 128.55558 | 4.393 |
| 128.583263 | 4.693 |
| 128.595783 | 5.149 |
| 128.614907 | 5.64 |
| 128.635557 | 5.861 |
| 128.663608 | 6.258 |
| 128.676102 | 6.27 |
| 128.697023 | 6.02 |
| 128.714878 | 5.96 |
| 128.741039 | 6.752 |
| 128.755529 | 7.179 |
| 128.775803 | 7.468 |
| 128.799008 | 8.955 |
| 128.824284 | 9.082 |
| 128.835794 | 9.438 |
| 128.855573 | 9.284 |
| 128.875735 | 9.469 |
| 128.905903 | 10.109 |
| 128.914878 | 10.3 |
| 128.935403 | 10.3 |
| 128.955552 | 10.619 |
| 128.984829 | 10.998 |
| 128.994935 | 10.717 |
| 129.014756 | 10.411 |
| 129.035878 | 10.596 |
| 129.065163 | 10.664 |
| 129.075732 | 10.251 |
| 129.096632 | 10.279 |
| 129.11506 | 10.231 |
| 129.142794 | 10.588 |
| 129.155704 | 10.144 |
| 129.175751 | 9.893 |
| 129.197253 | 10.202 |
| 129.223844 | 10.202 |
| 129.235919 | 10.174 |
| 129.255538 | 10.367 |
| 129.275737 | 9.655 |
| 129.325787 | 9.097 |
| 129.336936 | 9.029 |
| 129.355546 | 8.779 |
| 129.379785 | 8.711 |
| 129.394921 | 8.478 |
| 129.415048 | 7.31 |
| 129.435573 | 7.262 |
| 129.463144 | 7.408 |
| 129.475751 | 7.225 |
| 129.495421 | 7.07 |
| 129.51491 | 6.973 |
| 129.53776 | 6.684 |
| 129.555641 | 6.25 |
| 129.575731 | 5.826 |
| 129.595505 | 5.333 |
| 129.620978 | 4.888 |
| 129.635691 | 4.211 |
| 129.655572 | 3.661 |
| 129.675736 | 3.351 |
| 129.703696 | 3.207 |
| 129.715134 | 3.149 |
| 129.735674 | 3.033 |
| 129.755709 | 2.646 |
| 129.783591 | 2.22 |
| 129.794931 | 1.883 |
| 129.814883 | 1.36 |
| 129.835581 | 0.732 |
| 129.862828 | 0.499 |
| 129.875797 | 0.731 |
| 129.897046 | 0.952 |
| 129.914792 | 0.769 |
| 129.940446 | 0.112 |
| 129.955594 | -0.653 |
| 129.975742 | -0.479 |
| 129.996248 | 0.226 |
| 130.022379 | -0.132 |
| 130.035523 | -0.557 |
| 130.055564 | -0.973 |
| 130.075422 | -1.156 |
| 130.104523 | -0.733 |
| 130.114706 | -0.762 |
| 130.13535 | -1.313 |
| 130.155579 | -1.497 |
| 130.184255 | -1.217 |
| 130.194919 | -1.064 |
| 130.214756 | -0.9 |
| 130.235579 | -0.872 |
| 130.263534 | -1.046 |
| 130.275334 | -0.92 |
| 130.296586 | -0.863 |
| 130.314769 | -0.586 |
| 130.340659 | -0.711 |
| 130.355538 | -1.001 |
| 130.375758 | -0.741 |
| 130.395275 | -0.403 |
| 130.4396 | -0.451 |
| 130.455901 | -0.596 |
| 130.475749 | -1.002 |
| 130.501202 | -0.666 |
| 130.515261 | -0.463 |
| 130.535449 | -0.327 |
| 130.555514 | 0.003 |
| 130.58001 | 1.453 |
| 130.594919 | 1.819 |
| 130.614841 | 2.156 |
| 130.635564 | 2.164 |
| 130.662193 | 2.066 |
| 130.675844 | 2.163 |
| 130.695558 | 2.936 |
| 130.715316 | 3.613 |
| 130.739233 | 3.305 |
| 130.755593 | 3.043 |
| 130.775835 | 2.985 |
| 130.795559 | 3.565 |
| 130.821726 | 4.444 |
| 130.835628 | 4.588 |
| 130.855379 | 4.395 |
| 130.875723 | 4.192 |
| 130.903226 | 5.139 |
| 130.914664 | 5.766 |
| 130.935365 | 6.432 |
| 130.95554 | 6.829 |
| 130.983526 | 7.476 |
| 130.995014 | 7.497 |
| 131.014811 | 8.114 |
| 131.035609 | 8.451 |
| 131.063762 | 8.451 |
| 131.075758 | 8.007 |
| 131.096561 | 8.488 |
| 131.114944 | 8.172 |
| 131.141815 | 7.594 |
| 131.155585 | 7.999 |
| 131.175737 | 8.714 |
| 131.196329 | 10.163 |
| 131.222656 | 10.443 |
| 131.2357 | 10.318 |
| 131.255495 | 9.554 |
| 131.275829 | 9.41 |
| 131.305294 | 10.918 |
| 131.314925 | 10.753 |
| 131.335375 | 10.076 |
| 131.355746 | 9.558 |
| 131.382912 | 9.704 |
| 131.396272 | 9.848 |
| 131.415126 | 10.275 |
| 131.435602 | 9.939 |
| 131.46643 | 10.036 |
| 131.47572 | 10.19 |
| 131.498573 | 10.298 |
| 131.514952 | 10.298 |
| 131.561368 | 9.342 |
| 131.576302 | 9.519 |
| 131.596874 | 9.432 |
| 131.619672 | 9.103 |
| 131.635432 | 8.91 |
| 131.655622 | 8.341 |
| 131.675772 | 7.117 |
| 131.701926 | 7.185 |
| 131.715432 | 7.184 |
| 131.735324 | 7.591 |
| 131.755353 | 7.552 |
| 131.780212 | 5.388 |
| 131.795146 | 4.955 |
| 131.815094 | 5.284 |
| 131.835468 | 6.859 |
| 131.862303 | 7.563 |
| 131.875877 | 7.292 |
| 131.896574 | 7.099 |
| 131.914898 | 6.753 |
| 131.940597 | 6.133 |
| 131.955705 | 6.076 |
| 131.975729 | 6.153 |
| 131.9962 | 5.748 |
| 132.022064 | 4.019 |
| 132.035399 | 3.429 |
| 132.05556 | 2.811 |
| 132.075757 | 2.774 |
| 132.104511 | 2.387 |
| 132.11474 | 2.57 |
| 132.135173 | 1.835 |
| 132.155645 | 1.884 |
| 132.181824 | 1.314 |
| 132.194927 | 1.178 |
| 132.214748 | 0.763 |
| 132.235883 | 0.52 |
| 132.263022 | 0.298 |
| 132.275305 | 0.452 |
| 132.296645 | 0.297 |
| 132.314781 | -0.272 |
| 132.340056 | -0.428 |
| 132.355579 | -0.505 |
| 132.375734 | -0.488 |
| 132.396785 | -0.682 |
| 132.423438 | -1.03 |
| 132.435564 | -1.262 |
| 132.455542 | -1.505 |
| 132.475734 | -1.601 |
| 132.505471 | -1.486 |
| 132.514807 | -1.717 |
| 132.535391 | -2.163 |
| 132.555707 | -2.337 |
| 132.602174 | -2.204 |
| 132.614824 | -1.895 |
| 132.635435 | -1.768 |
| 132.659326 | -2.109 |
| 132.675831 | -1.809 |
| 132.697659 | -1.879 |
| 132.714801 | -1.879 |
| 132.737484 | -1.793 |
| 132.75568 | -1.6 |
| 132.775858 | -1.146 |
| 132.799187 | -1.407 |
| 132.822393 | -1.225 |
| 132.835893 | -1.312 |
| 132.855609 | -1.36 |
| 132.875723 | -1.09 |
| 132.903061 | -0.714 |
| 132.915152 | -0.58 |
| 132.935402 | -0.531 |
| 132.955514 | -0.28 |
| 132.982544 | 0.251 |
| 132.995803 | 0.425 |
| 133.014877 | 1.045 |
| 133.035549 | 1.016 |
| 133.063385 | 1.43 |
| 133.075728 | 1.642 |
| 133.096535 | 2.086 |
| 133.114799 | 2.847 |
| 133.142288 | 3.185 |
| 133.155587 | 3.032 |
| 133.175732 | 3.292 |
| 133.196581 | 3.764 |
| 133.223122 | 3.958 |
| 133.235779 | 4.121 |
| 133.25553 | 4.064 |
| 133.275732 | 4.875 |
| 133.305353 | 5.656 |
| 133.314714 | 6.112 |
| 133.335312 | 6.565 |
| 133.355551 | 6.815 |
| 133.384412 | 6.864 |
| 133.395092 | 6.807 |
| 133.414804 | 7.328 |
| 133.435612 | 7.251 |
| 133.464242 | 8.567 |
| 133.475719 | 8.443 |
| 133.496528 | 8.741 |
| 133.514778 | 8.333 |
| 133.542417 | 8.169 |
| 133.55526 | 7.843 |
| 133.575735 | 8.548 |
| 133.598747 | 8.759 |
| 133.625071 | 9.611 |
| 133.635811 | 9.41 |
| 133.655543 | 10.26 |
| 133.675736 | 10.598 |
| 133.724302 | 10.87 |
| 133.735659 | 11.053 |
| 133.755407 | 11.305 |
| 133.779092 | 11.412 |
| 133.794895 | 11.837 |
| 133.815076 | 11.749 |
| 133.835649 | 11.566 |
| 133.861373 | 12.281 |
| 133.875577 | 12.041 |
| 133.89572 | 12.33 |
| 133.915361 | 12.457 |
| 133.939167 | 11.8 |
| 133.955689 | 11.869 |
| 133.975639 | 11.648 |
| 133.995063 | 11.831 |
| 134.020678 | 11.687 |
| 134.035704 | 11.573 |
| 134.055555 | 11.389 |
| 134.075941 | 11.131 |
| 134.103796 | 10.947 |
| 134.115822 | 11.15 |
| 134.135665 | 10.976 |
| 134.155638 | 10.455 |
| 134.18302 | 10.05 |
| 134.194935 | 9.635 |
| 134.214885 | 9.326 |
| 134.235413 | 9.277 |
| 134.263009 | 9.472 |
| 134.274924 | 9.202 |
| 134.296678 | 8.739 |
| 134.314738 | 8.256 |
| 134.340438 | 8.101 |
| 134.355733 | 7.676 |
| 134.37573 | 7.754 |
| 134.396632 | 7.416 |
| 134.423006 | 7.002 |
| 134.435722 | 6.896 |
| 134.455539 | 6.598 |
| 134.475728 | 5.901 |
| 134.505076 | 5.785 |
| 134.514757 | 5.582 |
| 134.534887 | 5.272 |
| 134.555552 | 4.403 |
| 134.585256 | 4.016 |
| 134.595913 | 3.784 |
| 134.614888 | 3.244 |
| 134.635532 | 2.934 |
| 134.664711 | 2.673 |
| 134.675822 | 2.653 |
| 134.696542 | 2.112 |
| 134.715001 | 1.802 |
| 134.742593 | 1.56 |
| 134.75561 | 1.367 |
| 134.77572 | 1.454 |
| 134.798751 | 1.415 |
| 134.843953 | 1.096 |
| 134.8555 | 0.989 |
| 134.875728 | 0.728 |
| 134.901825 | 0.409 |
| 134.914818 | 0.418 |
| 134.93547 | 0.398 |
| 134.955561 | 0.194 |
| 134.98172 | -0.057 |
| 134.994721 | -0.067 |
| 135.015376 | -0.096 |
| 135.035164 | 0.058 |
| 135.062381 | -0.339 |
| 135.075763 | -0.765 |
| 135.09519 | -1.085 |
| 135.11669 | -1.25 |
| 135.141002 | -0.739 |
| 135.15582 | -0.623 |
| 135.175374 | -0.594 |
| 135.195647 | -0.508 |
| 135.220415 | -0.247 |
| 135.236163 | 0.1 |
| 135.255665 | 0.379 |
| 135.275732 | 0.244 |
| 135.302065 | -0.124 |
| 135.315666 | 0.156 |
| 135.335341 | 1.576 |
| 135.354665 | 1.536 |
| 135.381415 | 1.428 |
| 135.394911 | 1.476 |
| 135.414917 | 0.965 |
| 135.435528 | 2.037 |
| 135.465388 | 1.864 |
| 135.475715 | 1.68 |
| 135.496535 | 1.718 |
| 135.514743 | 2.065 |
| 135.542933 | 3.273 |
| 135.555571 | 3.503 |
| 135.575528 | 3.437 |
| 135.596421 | 3.408 |
| 135.622908 | 3.667 |
| 135.635821 | 3.85 |
| 135.655548 | 4.015 |
| 135.675724 | 4.015 |
| 135.70485 | 5.252 |
| 135.71582 | 5.772 |
| 135.735326 | 6.12 |
| 135.755777 | 6.381 |
| 135.783575 | 6.527 |
| 135.794962 | 6.69 |
| 135.815093 | 7.195 |
| 135.835558 | 7.59 |
| 135.864798 | 7.57 |
| 135.875721 | 7.59 |
| 135.897147 | 7.658 |
| 135.914782 | 7.572 |
| 135.964573 | 8.048 |
| 135.976534 | 7.921 |
| 135.997468 | 8.22 |
| 136.020776 | 8.414 |
| 136.035229 | 8.481 |
| 136.055548 | 8.443 |
| 136.075721 | 8.909 |
| 136.103565 | 9.789 |
| 136.11485 | 10.05 |
| 136.135654 | 10.475 |
| 136.155526 | 10.823 |
| 136.181892 | 10.438 |
| 136.194915 | 10.331 |
| 136.214926 | 10.457 |
| 136.235895 | 10.671 |
| 136.262849 | 11.154 |
| 136.275128 | 11.233 |
| 136.297585 | 11.222 |
| 136.31498 | 10.75 |
| 136.338082 | 10.461 |
| 136.356095 | 10.152 |
| 136.375722 | 10.374 |
| 136.395456 | 10.588 |
| 136.420255 | 10.859 |
| 136.436221 | 10.571 |
| 136.455534 | 10.223 |
| 136.474951 | 10.214 |
| 136.502641 | 10.378 |
| 136.514826 | 10.012 |
| 136.535221 | 9.077 |
| 136.555546 | 8.469 |
| 136.583407 | 8.228 |
| 136.594924 | 8.294 |
| 136.615069 | 8.217 |
| 136.635528 | 8.528 |
| 136.664285 | 8.152 |
| 136.675755 | 7.959 |
| 136.696921 | 7.756 |
| 136.714794 | 7.35 |
| 136.741683 | 6.529 |
| 136.755481 | 6.065 |
| 136.77572 | 5.785 |
| 136.799268 | 5.594 |
| 136.824464 | 5.217 |
| 136.83586 | 4.869 |
| 136.855537 | 4.377 |
| 136.875275 | 4.115 |
| 136.904612 | 3.719 |
| 136.915365 | 3.603 |
| 136.935662 | 3.38 |
| 136.955538 | 3.032 |
| 137.005094 | 2.047 |
| 137.015191 | 2.154 |
| 137.035328 | 1.651 |
| 137.060429 | 0.857 |
| 137.075915 | 0.694 |
| 137.097716 | 0.402 |
| 137.114769 | 0.431 |
| 137.142003 | 0.421 |
| 137.155627 | 0.295 |
| 137.175785 | 0.169 |
| 137.197565 | -0.169 |
| 137.222646 | -0.556 |
| 137.235674 | -0.663 |
| 137.255584 | -0.836 |
| 137.275874 | -1.359 |
| 137.303961 | -1.389 |
| 137.314852 | -1.255 |
| 137.335287 | -1.487 |
| 137.35609 | -1.256 |
| 137.381221 | -1.045 |
| 137.395051 | -1.209 |
| 137.41488 | -1.171 |
| 137.435537 | -0.968 |
| 137.463809 | -1.296 |
| 137.475712 | -1.094 |
| 137.496441 | -1.288 |
| 137.51471 | -1.076 |
| 137.5434 | -1.337 |
| 137.555739 | -1.357 |
| 137.57572 | -1.367 |
| 137.596481 | -1.349 |
| 137.624016 | -1.339 |
| 137.635792 | -1.252 |
| 137.655133 | -0.614 |
| 137.675718 | -0.508 |
| 137.705276 | -0.432 |
| 137.71512 | -0.597 |
| 137.73556 | -0.298 |
| 137.755528 | 0.147 |
| 137.78526 | 0.484 |
| 137.795157 | 0.822 |
| 137.814897 | 1.12 |
| 137.835522 | 0.907 |
| 137.865225 | 1.371 |
| 137.875907 | 1.631 |
| 137.896321 | 2.529 |
| 137.914908 | 2.963 |
| 137.942936 | 2.826 |
| 137.955571 | 2.71 |
| 137.975626 | 2.573 |
| 137.99909 | 3.076 |
| 138.026335 | 3.406 |
| 138.035742 | 3.773 |
| 138.055655 | 3.987 |
| 138.075712 | 4.383 |
| 138.124542 | 5.214 |
| 138.136163 | 5.415 |
| 138.155554 | 5.416 |
| 138.180823 | 5.532 |
| 138.194846 | 5.86 |
| 138.215255 | 6.112 |
| 138.235628 | 6.402 |
| 138.260778 | 6.778 |
| 138.275721 | 7.175 |
| 138.295626 | 7.311 |
| 138.314911 | 7.505 |
| 138.339073 | 8.414 |
| 138.355861 | 8.47 |
| 138.375755 | 8.665 |
| 138.395152 | 8.85 |
| 138.420837 | 8.994 |
| 138.435908 | 9.536 |
| 138.455547 | 9.564 |
| 138.475722 | 9.924 |
| 138.502453 | 10.389 |
| 138.51511 | 10.398 |
| 138.535241 | 10.322 |
| 138.555533 | 10.881 |
| 138.581345 | 11.007 |
| 138.595194 | 11.318 |
| 138.614682 | 11.493 |
| 138.635392 | 11.125 |
| 138.662582 | 11.61 |
| 138.67571 | 11.619 |
| 138.69669 | 11.551 |
| 138.714734 | 11.396 |
| 138.743258 | 11.223 |
| 138.755455 | 11.06 |
| 138.775717 | 10.837 |
| 138.799411 | 10.955 |
| 138.82448 | 10.724 |
| 138.83571 | 10.764 |
| 138.855531 | 10.502 |
| 138.875712 | 10.755 |
| 138.904382 | 10.08 |
| 138.914847 | 10.506 |
| 138.935225 | 10.177 |
| 138.955326 | 9.704 |
| 138.982425 | 9.241 |
| 138.994789 | 9.299 |
| 139.014749 | 9.057 |
| 139.035543 | 8.711 |
| 139.064369 | 8.45 |
| 139.075714 | 8.517 |
| 139.096769 | 8.064 |
| 139.114937 | 7.987 |
| 139.142395 | 6.955 |
| 139.155591 | 6.336 |
| 139.175719 | 5.939 |
| 139.196463 | 5.516 |
| 139.242303 | 4.337 |
| 139.256021 | 3.968 |
| 139.275419 | 4.028 |
| 139.301913 | 3.718 |
| 139.31525 | 4.008 |
| 139.335327 | 3.523 |
| 139.355653 | 4.065 |
| 139.380382 | 3.497 |
| 139.394922 | 3.641 |
| 139.41487 | 3.331 |
| 139.436374 | 2.403 |
| 139.462976 | 1.948 |
| 139.475326 | 1.638 |
| 139.49733 | 1.116 |
| 139.514759 | 1.087 |
| 139.538467 | 0.777 |
| 139.555816 | 0.593 |
| 139.575839 | 0.401 |
| 139.59697 | 0.255 |
| 139.622392 | -0.026 |
| 139.636262 | -0.287 |
| 139.655609 | -0.588 |
| 139.67571 | -0.926 |
| 139.70427 | -0.869 |
| 139.71505 | -0.937 |
| 139.735391 | -0.715 |
| 139.755398 | -0.715 |
| 139.784673 | -0.861 |
| 139.795215 | -1.093 |
| 139.814785 | -0.968 |
| 139.835637 | -0.707 |
| 139.865754 | -0.67 |
| 139.897138 | -0.401 |
| 139.914957 | -0.41 |
| 139.94174 | -0.382 |
| 139.955792 | -0.401 |
| 139.975714 | -0.257 |
| 139.999314 | -0.577 |
| 140.025312 | -0.316 |
| 140.035868 | -0.114 |
| 140.055521 | 0.147 |
| 140.075747 | 0.271 |
| 140.105272 | 0.531 |
| 140.114835 | 0.763 |
| 140.135286 | 1.053 |
| 140.155646 | 1.738 |
| 140.185116 | 2.259 |
| 140.194922 | 2.549 |
| 140.214923 | 2.452 |
| 140.235541 | 2.644 |
| 140.265554 | 2.905 |
| 140.275753 | 2.895 |
| 140.297013 | 3.087 |
| 140.314906 | 3.154 |
| 140.361075 | 3.58 |
| 140.376084 | 3.715 |
| 140.396906 | 3.84 |
| 140.420478 | 4.836 |
| 140.435448 | 4.771 |
| 140.455631 | 5.137 |
| 140.475632 | 5.447 |
| 140.500511 | 5.841 |
| 140.514918 | 5.776 |
| 140.535858 | 6.034 |
| 140.555537 | 6.259 |
| 140.580466 | 7.136 |
| 140.594939 | 7.022 |
| 140.614946 | 7.387 |
| 140.635723 | 7.678 |
| 140.66249 | 9.022 |
| 140.675782 | 9.206 |
| 140.695457 | 9.629 |
| 140.714979 | 9.407 |
| 140.741653 | 9.794 |
| 140.755756 | 9.545 |
| 140.775256 | 10.008 |
| 140.795377 | 10.057 |
| 140.823182 | 10.397 |
| 140.835938 | 10.57 |
| 140.855527 | 10.175 |
| 140.875755 | 10.078 |
| 140.905044 | 10.399 |
| 140.914951 | 10.592 |
| 140.935216 | 10.863 |
| 140.95552 | 11.588 |
| 140.98614 | 11.618 |
| 140.99481 | 11.453 |
| 141.014752 | 11.153 |
| 141.035613 | 11.26 |
| 141.065282 | 11.474 |
| 141.075711 | 11.802 |
| 141.09677 | 11.881 |
| 141.114744 | 11.563 |
| 141.142412 | 11.794 |
| 141.155575 | 11.583 |
| 141.175823 | 11.324 |
| 141.198601 | 11.382 |
| 141.225454 | 11.102 |
| 141.2358 | 11.024 |
| 141.255547 | 10.901 |
| 141.27578 | 10.766 |
| 141.307895 | 10.391 |
| 141.314623 | 10.342 |
| 141.33536 | 9.628 |
| 141.355699 | 8.99 |
| 141.404938 | 8.508 |
| 141.414737 | 8.296 |
| 141.435419 | 8.48 |
| 141.46023 | 8.015 |
| 141.47577 | 7.853 |
| 141.497396 | 7.602 |
| 141.514892 | 7.543 |
| 141.538007 | 7.428 |
| 141.5556 | 7.118 |
| 141.575921 | 6.568 |
| 141.595676 | 5.891 |
| 141.619361 | 5.602 |
| 141.63577 | 5.081 |
| 141.655529 | 4.744 |
| 141.675843 | 4.733 |
| 141.703649 | 3.873 |
| 141.714831 | 3.728 |
| 141.735384 | 3.371 |
| 141.755597 | 2.946 |
| 141.781762 | 2.152 |
| 141.795479 | 2.124 |
| 141.814966 | 2.075 |
| 141.835488 | 1.698 |
| 141.863791 | 1.059 |
| 141.875733 | 0.866 |
| 141.897241 | 0.461 |
| 141.914803 | 0.393 |
| 141.941431 | 0.315 |
| 141.956187 | 0.198 |
| 141.975764 | -0.024 |
| 141.999212 | 0.169 |
| 142.025426 | 0.014 |
| 142.036605 | 0.082 |
| 142.055528 | -0.111 |
| 142.075204 | -0.421 |
| 142.104664 | -0.606 |
| 142.114893 | -0.664 |
| 142.135588 | -0.714 |
| 142.155521 | -0.927 |
| 142.182975 | -1.083 |
| 142.195122 | -1.16 |
| 142.21474 | -1.276 |
| 142.235498 | -1.528 |
| 142.264535 | -1.404 |
| 142.275712 | -1.549 |
| 142.296314 | -1.752 |
| 142.314745 | -1.588 |
| 142.343332 | -1.115 |
| 142.35564 | -1.165 |
| 142.375708 | -1.677 |
| 142.395071 | -1.648 |
| 142.424203 | -1.282 |
| 142.435727 | -1.07 |
| 142.455546 | -0.761 |
| 142.475817 | -0.53 |
| 142.524018 | -0.104 |
| 142.535726 | -0.153 |
| 142.555622 | 0.049 |
| 142.578337 | 0.764 |
| 142.595271 | 0.995 |
| 142.61497 | 1.477 |
| 142.635529 | 1.794 |
| 142.662609 | 2.615 |
| 142.675724 | 2.693 |
| 142.695005 | 3.137 |
| 142.714768 | 2.945 |
| 142.740165 | 3.331 |
| 142.755742 | 3.561 |
| 142.7758 | 3.765 |
| 142.795063 | 3.803 |
| 142.819644 | 4.064 |
| 142.83568 | 4.208 |
| 142.855546 | 4.421 |
| 142.875708 | 5.232 |
| 142.903946 | 5.696 |
| 142.914874 | 5.957 |
| 142.935649 | 6.237 |
| 142.955507 | 6.381 |
| 142.983793 | 6.972 |
| 142.995904 | 6.876 |
| 143.014746 | 7.485 |
| 143.035685 | 7.677 |
| 143.063796 | 7.91 |
| 143.075712 | 7.824 |
| 143.096195 | 8.771 |
| 143.114784 | 9.436 |
| 143.144089 | 9.775 |
| 143.155649 | 9.911 |
| 143.175816 | 10.413 |
| 143.195193 | 10.557 |
| 143.223332 | 10.241 |
| 143.235647 | 10.569 |
| 143.255533 | 10.503 |
| 143.275712 | 10.889 |
| 143.305164 | 11.209 |
| 143.314971 | 11.393 |
| 143.335348 | 11.161 |
| 143.355577 | 10.959 |
| 143.385695 | 10.688 |
| 143.395116 | 10.97 |
| 143.414744 | 11.24 |
| 143.435594 | 11.339 |
| 143.466509 | 11.426 |
| 143.475695 | 11.358 |
| 143.49638 | 11.33 |
| 143.514745 | 11.186 |
| 143.542775 | 11.09 |
| 143.555579 | 11.109 |
| 143.575706 | 11.11 |
| 143.596427 | 11.053 |
| 143.642032 | 10.667 |
| 143.655578 | 10.833 |
| 143.675711 | 10.601 |
| 143.701999 | 10.4 |
| 143.715402 | 10.033 |
| 143.735345 | 9.559 |
| 143.755528 | 8.835 |
| 143.78223 | 8.179 |
| 143.795151 | 8.073 |
| 143.815263 | 7.937 |
| 143.835514 | 7.957 |
| 143.862863 | 8.026 |
| 143.875925 | 7.987 |
| 143.895132 | 6.963 |
| 143.915187 | 6.548 |
| 143.938959 | 6.442 |
| 143.955607 | 6.094 |
| 143.975699 | 5.593 |
| 143.995155 | 5.302 |
| 144.02165 | 4.907 |
| 144.035825 | 4.646 |
| 144.055594 | 4.192 |
| 144.075206 | 3.912 |
| 144.103085 | 3.641 |
| 144.114873 | 3.11 |
| 144.135662 | 2.675 |
| 144.155517 | 2.705 |
| 144.183797 | 2.298 |
| 144.195142 | 2.569 |
| 144.214893 | 2.481 |
| 144.235519 | 1.892 |
| 144.263625 | 1.319 |
| 144.275705 | 1.224 |
| 144.296415 | 1.03 |
| 144.31475 | 0.72 |
| 144.341264 | 0.507 |
| 144.355281 | 0.256 |
| 144.376275 | 0.149 |
| 144.39701 | -0.034 |
| 144.42463 | -0.538 |
| 144.435828 | -0.295 |
| 144.455527 | -0.595 |
| 144.47571 | -0.819 |
| 144.506289 | -1.149 |
| 144.514806 | -1.072 |
| 144.535321 | -1.303 |
| 144.555529 | -1.151 |
| 144.584393 | -0.89 |
| 144.595155 | -1.034 |
| 144.614746 | -0.967 |
| 144.635449 | -1.045 |
| 144.663723 | -1.144 |
| 144.675708 | -1.183 |
| 144.696666 | -1.144 |
| 144.714972 | -1.048 |
| 144.761978 | -0.489 |
| 144.775747 | -0.605 |
| 144.796979 | -0.625 |
| 144.820126 | -0.384 |
| 144.835451 | -0.702 |
| 144.855519 | -0.52 |
| 144.875701 | -0.202 |
| 144.902329 | 0.493 |
| 144.915346 | 0.637 |
| 144.935473 | 0.84 |
| 144.955518 | 0.753 |
| 144.982551 | 0.899 |
| 144.994969 | 1.256 |
| 145.015146 | 1.4 |
| 145.035791 | 1.95 |
| 145.063716 | 2.346 |
| 145.075746 | 2.732 |
| 145.095682 | 2.51 |
| 145.115632 | 2.462 |
| 145.139436 | 2.963 |
| 145.155582 | 3.138 |
| 145.174952 | 3.244 |
| 145.195376 | 3.098 |
| 145.221928 | 3.562 |
| 145.235671 | 3.872 |
| 145.255494 | 4.797 |
| 145.275734 | 4.798 |
| 145.303875 | 5.071 |
| 145.314796 | 5.205 |
| 145.335477 | 5.339 |
| 145.355518 | 6.286 |
| 145.383715 | 6.279 |
| 145.395058 | 6.286 |
| 145.414897 | 7.072 |
| 145.435529 | 8.01 |
| 145.465031 | 7.892 |
| 145.474981 | 7.833 |
| 145.49681 | 8.635 |
| 145.514842 | 8.811 |
| 145.541553 | 8.733 |
| 145.555637 | 8.773 |
| 145.575053 | 9.284 |
| 145.595388 | 9.015 |
| 145.622324 | 9.788 |
| 145.63531 | 10.07 |
| 145.655566 | 10.504 |
| 145.675705 | 10.543 |
| 145.707234 | 10.999 |
| 145.714752 | 10.989 |
| 145.735235 | 11.452 |
| 145.755788 | 11.721 |
| 145.805106 | 10.807 |
| 145.814934 | 11.136 |
| 145.835271 | 12.025 |
| 145.860902 | 11.339 |
| 145.875809 | 11.012 |
| 145.897631 | 10.461 |
| 145.914929 | 10.23 |
| 145.938974 | 10.396 |
| 145.955582 | 10.367 |
| 145.975723 | 10.184 |
| 145.998652 | 9.734 |
| 146.023635 | 9.628 |
| 146.035772 | 9.773 |
| 146.055556 | 9.174 |
| 146.075303 | 8.923 |
| 146.104365 | 8.421 |
| 146.115024 | 8.247 |
| 146.135699 | 8.179 |
| 146.155516 | 8.102 |
| 146.184363 | 8.064 |
| 146.194924 | 7.842 |
| 146.214783 | 7.88 |
| 146.235527 | 7.562 |
| 146.264136 | 7.156 |
| 146.275778 | 7.051 |
| 146.296814 | 6.994 |
| 146.314694 | 6.907 |
| 146.342255 | 6.8 |
| 146.355701 | 5.718 |
| 146.375701 | 5.255 |
| 146.396733 | 5.534 |
| 146.424615 | 5.071 |
| 146.435989 | 4.521 |
| 146.454826 | 4.375 |
| 146.475711 | 3.94 |
| 146.505477 | 3.204 |
| 146.51475 | 3.109 |
| 146.53532 | 3.002 |
| 146.555563 | 2.152 |
| 146.5856 | 2.055 |
| 146.594932 | 2.094 |
| 146.614768 | 2.24 |
| 146.635518 | 2.143 |
| 146.665881 | 1.978 |
| 146.675693 | 1.456 |
| 146.696528 | 0.605 |
| 146.714745 | 0.392 |
| 146.744047 | 0.614 |
| 146.755654 | 0.672 |
| 146.775805 | 0.237 |
| 146.795127 | -0.304 |
| 146.824262 | -0.943 |
| 146.83543 | -1.02 |
| 146.855519 | -0.819 |
| 146.875889 | -0.558 |
| 146.926637 | -1.06 |
| 146.93587 | -1.187 |
| 146.955518 | -1.082 |
| 146.982849 | -1.286 |
| 146.99514 | -1.305 |
| 147.014962 | -1.142 |
| 147.035453 | -1.162 |
| 147.062863 | -0.969 |
| 147.075792 | -1.008 |
| 147.09766 | -0.902 |
| 147.115015 | -0.854 |
| 147.142898 | -0.875 |
| 147.155917 | -0.933 |
| 147.175705 | -1.127 |
| 147.199672 | -0.307 |
| 147.224989 | -0.046 |
| 147.235796 | 0.04 |
| 147.255531 | -0.086 |
| 147.275692 | -0.096 |
| 147.305373 | 0.445 |
| 147.335636 | 1.333 |
| 147.355685 | 1.663 |
| 147.383526 | 1.546 |
| 147.396134 | 1.931 |
| 147.414935 | 1.546 |
| 147.435365 | 1.931 |
| 147.464773 | 2.837 |
| 147.475702 | 2.721 |
| 147.497078 | 2.857 |
| 147.515709 | 3.097 |
| 147.542133 | 3.368 |
| 147.555202 | 3.968 |
| 147.575715 | 4.536 |
| 147.597126 | 5.087 |
| 147.624089 | 5.263 |
| 147.636205 | 5.512 |
| 147.655674 | 5.348 |
| 147.675705 | 5.61 |
| 147.707413 | 6.4 |
| 147.735315 | 6.488 |
| 147.755509 | 7.106 |
| 147.784882 | 7.87 |
| 147.814921 | 8.364 |
| 147.835524 | 8.057 |
| 147.866912 | 8.156 |
| 147.896711 | 8.859 |
| 147.915039 | 9.179 |
| 147.944651 | 9.036 |
| 147.955658 | 9.699 |
| 147.975753 | 9.798 |
| 147.995469 | 9.972 |
| 148.045806 | 10.021 |
| 148.055826 | 9.828 |
| 148.07524 | 9.616 |
| 148.102543 | 10.235 |
| 148.115137 | 10.603 |
| 148.135812 | 11.211 |
| 148.155559 | 11.442 |
| 148.183567 | 11.502 |
| 148.195028 | 11.029 |
| 148.214785 | 10.807 |
| 148.23558 | 10.751 |
| 148.263524 | 11.379 |
| 148.275693 | 10.887 |
| 148.297783 | 11.031 |
| 148.31489 | 10.974 |
| 148.341262 | 10.685 |
| 148.35553 | 10.674 |
| 148.375699 | 10.309 |
| 148.396961 | 10.369 |
| 148.423605 | 10.505 |
| 148.435631 | 10.641 |
| 148.45563 | 10.814 |
| 148.475653 | 10.322 |
| 148.503649 | 9.907 |
| 148.514979 | 9.481 |
| 148.535401 | 9.211 |
| 148.555534 | 8.546 |
| 148.58229 | 7.88 |
| 148.595135 | 7.88 |
| 148.614749 | 7.657 |
| 148.635529 | 7.822 |
| 148.66538 | 7.772 |
| 148.675689 | 7.656 |
| 148.696439 | 7.185 |
| 148.714889 | 7.233 |
| 148.743979 | 7.254 |
| 148.75567 | 7.187 |
| 148.775635 | 6.723 |
| 148.79514 | 5.882 |
| 148.826063 | 5.166 |
| 148.835917 | 4.895 |
| 148.855514 | 4.644 |
| 148.87569 | 4.576 |
| 148.908107 | 4.673 |
| 148.935239 | 4.77 |
| 148.9555 | 4.191 |
| 148.985385 | 3.466 |
| 148.995167 | 3.341 |
| 149.014781 | 3.098 |
| 149.035517 | 2.953 |
| 149.0691 | 2.112 |
| 149.075362 | 2.044 |
| 149.096475 | 1.319 |
| 149.11504300000001 | 1 |
| 149.162832 | 0.178 |
| 149.175696 | 0.178 |
| 149.197645 | 0.062 |
| 149.222139 | 0.217 |
| 149.235707 | 0.1 |
| 149.255625 | 0.428 |
| 149.275696 | 0.669 |
| 149.303739 | -0.096 |
| 149.31507 | -0.213 |
| 149.335453 | -0.57 |
| 149.355081 | -0.677 |
| 149.383584 | -0.784 |
| 149.394898 | -0.562 |
| 149.414853 | -0.815 |
| 149.435628 | -1.085 |
| 149.464457 | -0.833 |
| 149.475824 | -0.456 |
| 149.496631 | -0.65 |
| 149.514955 | -0.601 |
| 149.54117 | -0.534 |
| 149.555596 | -0.814 |
| 149.575698 | -0.931 |
| 149.596596 | -0.921 |
| 149.622737 | -0.479 |
| 149.635665 | -0.402 |
| 149.655503 | -0.383 |
| 149.675048 | -0.46 |
| 149.704813 | -0.663 |
| 149.714943 | -0.481 |
| 149.735193 | -0.171 |
| 149.755502 | 0.011 |
| 149.785767 | 0.387 |
| 149.794997 | 0.638 |
| 149.814687 | 0.541 |
| 149.835524 | 0.735 |
| 149.865682 | 1.198 |
| 149.875759 | 1.246 |
| 149.896596 | 1.728 |
| 149.914808 | 1.951 |
| 149.943338 | 1.874 |
| 149.955642 | 1.776 |
| 149.975688 | 1.872 |
| 149.998492 | 1.68 |
| 150.028491 | 1.901 |
| 150.035569 | 2.153 |
| 150.05565 | 2.337 |
| 150.075739 | 2.829 |
| 150.107725 | 2.994 |
| 150.114819 | 3.428 |
| 150.135397 | 3.622 |
| 150.155546 | 3.93 |
| 150.203843 | 4.365 |
| 150.214813 | 4.559 |
| 150.235593 | 5.033 |
| 150.260613 | 5.602 |
| 150.27575 | 5.97 |
| 150.296585 | 6.231 |
| 150.314992 | 6.308 |
| 150.339857 | 6.317 |
| 150.355585 | 6.386 |
| 150.375825 | 6.985 |
| 150.397377 | 7.276 |
| 150.422341 | 7.353 |
| 150.435344 | 7.334 |
| 150.455511 | 7.382 |
| 150.475894 | 7.412 |
| 150.503179 | 7.451 |
| 150.514926 | 7.432 |
| 150.53535 | 7.539 |
| 150.555514 | 7.839 |
| 150.584009 | 7.927 |
| 150.594901 | 8.033 |
| 150.614787 | 8.073 |
| 150.635585 | 8.42 |
| 150.66461 | 8.247 |
| 150.675681 | 8.44 |
| 150.696391 | 8.286 |
| 150.714888 | 8.18 |
| 150.74342 | 7.92 |
| 150.755637 | 7.959 |
| 150.775156 | 8.095 |
| 150.796523 | 8.433 |
| 150.824213 | 8.733 |
| 150.835635 | 8.81 |
| 150.85554 | 8.628 |
| 150.875693 | 8.319 |
| 150.904928 | 8.048 |
| 150.915552 | 8.087 |
| 150.935223 | 8.116 |
| 150.955539 | 8.096 |
| 150.985444 | 7.72 |
| 150.994989 | 7.672 |
| 151.014644 | 7.277 |
| 151.035627 | 7.413 |
| 151.065277 | 7.23 |
| 151.075688 | 7.337 |
| 151.096478 | 7.154 |
| 151.114762 | 6.468 |
| 151.144231 | 5.473 |
| 151.155624 | 5.453 |
| 151.17545 | 5.608 |
| 151.195173 | 5.695 |
| 151.223701 | 5.59 |
| 151.235574 | 5.435 |
| 151.255523 | 5.155 |
| 151.275774 | 5.243 |
| 151.325451 | 4.344 |
| 151.335744 | 4.238 |
| 151.355495 | 3.909 |
| 151.380249 | 3.958 |
| 151.394993 | 3.871 |
| 151.414782 | 3.61 |
| 151.435583 | 3.099 |
| 151.46257 | 2.17 |
| 151.475693 | 2.103 |
| 151.494941 | 1.696 |
| 151.514848 | 1.783 |
| 151.538596 | 1.155 |
| 151.555712 | 0.827 |
| 151.575704 | 0.749 |
| 151.595368 | 0.585 |
| 151.618631 | 0.584 |
| 151.635678 | 0.468 |
| 151.655501 | 0.275 |
| 151.675691 | 0.12 |
| 151.703224 | -0.064 |
| 151.715096 | -0.161 |
| 151.735769 | -0.228 |
| 151.755509 | -0.025 |
| 151.783495 | -0.257 |
| 151.795122 | 0.005 |
| 151.814991 | -0.131 |
| 151.835343 | -0.102 |
| 151.863205 | -0.421 |
| 151.875847 | -0.674 |
| 151.897309 | -1.099 |
| 151.914743 | -1.15 |
| 151.941159 | -1.671 |
| 151.955687 | -1.691 |
| 151.975737 | -1.197 |
| 151.998935 | -1.294 |
| 152.023952 | -1.382 |
| 152.036436 | -1.402 |
| 152.055522 | -1.431 |
| 152.075295 | -1.741 |
| 152.103864 | -1.557 |
| 152.11498 | -1.219 |
| 152.135386 | -1.442 |
| 152.155551 | -1.723 |
| 152.182785 | -1.946 |
| 152.195119 | -1.762 |
| 152.214759 | -1.396 |
| 152.255499 | -1.368 |
| 152.284776 | -1.581 |
| 152.294921 | -1.406 |
| 152.314776 | -0.847 |
| 152.335345 | -0.518 |
| 152.365696 | -0.287 |
| 152.376051 | -0.413 |
| 152.397709 | -0.047 |
| 152.414912 | 0.601 |
| 152.462616 | 0.795 |
| 152.476465 | 0.822 |
| 152.496583 | 1.044 |
| 152.519796 | 1.247 |
| 152.535355 | 1.256 |
| 152.555608 | 1.295 |
| 152.575694 | 1.519 |
| 152.602575 | 2 |
| 152.614827 | 1.99 |
| 152.635332 | 2.067 |
| 152.655479 | 2.165 |
| 152.680868 | 2.087 |
| 152.695922 | 2.077 |
| 152.714733 | 2.194 |
| 152.735626 | 2.435 |
| 152.763055 | 2.378 |
| 152.775827 | 2.377 |
| 152.796567 | 2.744 |
| 152.814985 | 3.13 |
| 152.838707 | 3.275 |
| 152.855655 | 3.295 |
| 152.875718 | 3.265 |
| 152.897145 | 3.218 |
| 152.921376 | 3.769 |
| 152.935395 | 3.98 |
| 152.95549 | 4.368 |
| 152.974939 | 4.609 |
| 153.003172 | 5.111 |
| 153.014783 | 5.101 |
| 153.035334 | 4.937 |
| 153.055559 | 4.85 |
| 153.083102 | 5.305 |
| 153.095491 | 5.595 |
| 153.11504 | 5.923 |
| 153.135596 | 5.788 |
| 153.163799 | 5.904 |
| 153.17529 | 6.04 |
| 153.197209 | 6.61 |
| 153.21494 | 6.9 |
| 153.242942 | 6.814 |
| 153.256146 | 7.055 |
| 153.275867 | 7.046 |
| 153.2992 | 6.989 |
| 153.324235 | 7.045 |
| 153.335726 | 7.424 |
| 153.355526 | 7.665 |
| 153.375281 | 7.974 |
| 153.404002 | 7.472 |
| 153.415662 | 7.289 |
| 153.435344 | 7.039 |
| 153.455499 | 6.769 |
| 153.502204 | 6.924 |
| 153.515079 | 7.137 |
| 153.535067 | 7.341 |
| 153.558839 | 7.119 |
| 153.575733 | 6.896 |
| 153.596789 | 6.877 |
| 153.614741 | 7.139 |
| 153.638073 | 7.429 |
| 153.655734 | 7.362 |
| 153.675688 | 7.169 |
| 153.69719 | 7.023 |
| 153.721111 | 6.705 |
| 153.73568 | 6.493 |
| 153.755566 | 6.755 |
| 153.775689 | 6.833 |
| 153.801976 | 7.084 |
| 153.815278 | 6.292 |
| 153.83533 | 5.779 |
| 153.855716 | 5.481 |
| 153.878576 | 5.559 |
| 153.895611 | 5.21 |
| 153.914794 | 4.758 |
| 153.935518 | 4.749 |
| 153.963292 | 3.822 |
| 153.975678 | 3.609 |
| 153.996485 | 3.039 |
| 154.014742 | 2.585 |
| 154.040159 | 2.701 |
| 154.055681 | 3.204 |
| 154.075684 | 3.146 |
| 154.096593 | 3.155 |
| 154.123315 | 2.807 |
| 154.135696 | 2.952 |
| 154.155034 | 2.816 |
| 154.175682 | 3.019 |
| 154.203725 | 3.077 |
| 154.21502 | 3.261 |
| 154.235264 | 3.165 |
| 154.255545 | 3.194 |
| 154.283979 | 2.43 |
| 154.295341 | 2.334 |
| 154.314777 | 2.111 |
| 154.335537 | 1.754 |
| 154.36381 | 1.125 |
| 154.375934 | 1.019 |
| 154.396363 | 0.825 |
| 154.414914 | 0.478 |
| 154.441376 | 0.014 |
| 154.455673 | -0.025 |
| 154.475853 | 0.052 |
| 154.49845 | -0.161 |
| 154.524094 | -0.277 |
| 154.535745 | -0.277 |
| 154.555517 | -0.508 |
| 154.575678 | -0.267 |
| 154.625623 | -0.752 |
| 154.635716 | -0.945 |
| 154.655479 | -1.042 |
| 154.680767 | -0.82 |
| 154.694933 | -0.917 |
| 154.714945 | -1.169 |
| 154.734915 | -1.294 |
| 154.762614 | -1.227 |
| 154.775686 | -1.121 |
| 154.795461 | -1.15 |
| 154.81502 | -1.188 |
| 154.840898 | -1.324 |
| 154.855799 | -1.46 |
| 154.875689 | -1.324 |
| 154.89497 | -1.402 |
| 154.920922 | -1.364 |
| 154.935855 | -1.489 |
| 154.955496 | -1.665 |
| 154.975681 | -1.752 |
| 155.00361 | -1.472 |
| 155.015739 | -1.549 |
| 155.03561 | -1.501 |
| 155.055501 | -1.686 |
| 155.082248 | -1.801 |
| 155.094922 | -1.725 |
| 155.114924 | -1.599 |
| 155.135393 | -1.658 |
| 155.163667 | -1.649 |
| 155.175493 | -1.707 |
| 155.196546 | -1.639 |
| 155.214736 | -1.494 |
| 155.241645 | -0.993 |
| 155.255641 | -0.993 |
| 155.27483 | -0.829 |
| 155.29894 | -0.818 |
| 155.324497 | -0.364 |
| 155.335661 | -0.229 |
| 155.355438 | -0.152 |
| 155.375733 | -0.403 |
| 155.405243 | -0.5 |
| 155.414859 | -0.519 |
| 155.435229 | -0.278 |
| 155.455587 | -0.027 |
| 155.483501 | 0.04 |
| 155.494911 | -0.008 |
| 155.514721 | 0.058 |
| 155.535499 | 0.27 |
| 155.565892 | 1.295 |
| 155.575694 | 1.43 |
| 155.59649 | 2.087 |
| 155.614741 | 2.309 |
| 155.643693 | 2.358 |
| 155.655672 | 2.406 |
| 155.67568 | 2.792 |
| 155.695635 | 2.86 |
| 155.743684 | 3.16 |
| 155.77561 | 3.295 |
| 155.800441 | 3.324 |
| 155.815162 | 3.392 |
| 155.83522 | 3.122 |
| 155.85565 | 3.112 |
| 155.879132 | 3.103 |
| 155.895167 | 3.238 |
| 155.914919 | 3.306 |
| 155.935503 | 3.441 |
| 155.963644 | 3.934 |
| 155.975904 | 4.06 |
| 155.99726 | 4.717 |
| 156.01487 | 4.862 |
| 156.041605 | 5.047 |
| 156.055895 | 4.988 |
| 156.075726 | 5.085 |
| 156.097127 | 5.134 |
| 156.12214 | 5.385 |
| 156.135701 | 5.482 |
| 156.155169 | 5.52 |
| 156.17523 | 5.27 |
| 156.203263 | 4.981 |
| 156.215348 | 5.03 |
| 156.235251 | 5.281 |
| 156.255498 | 5.3 |
| 156.282533 | 5.552 |
| 156.294999 | 5.504 |
| 156.314753 | 5.407 |
| 156.335489 | 5.127 |
| 156.365535 | 4.963 |
| 156.376402 | 5.031 |
| 156.396772 | 5.273 |
| 156.414889 | 5.429 |
| 156.442243 | 5.545 |
| 156.455548 | 5.554 |
| 156.475304 | 5.371 |
| 156.498409 | 5.313 |
| 156.524524 | 5.477 |
| 156.535821 | 5.343 |
| 156.555504 | 5.304 |
| 156.575788 | 5.199 |
| 156.606163 | 4.948 |
| 156.614727 | 4.764 |
| 156.635369 | 4.504 |
| 156.655486 | 4.416 |
| 156.686057 | 4.36 |
| 156.695062 | 4.523 |
| 156.714799 | 4.157 |
| 156.7355 | 4.1 |
| 156.766172 | 4.1 |
| 156.797508 | 3.599 |
| 156.814885 | 3.694 |
| 156.861477 | 3.405 |
| 156.876158 | 3.232 |
| 156.896908 | 2.981 |
| 156.920157 | 3.038 |
| 156.935449 | 2.884 |
| 156.955487 | 2.866 |
| 156.975674 | 2.99 |
| 157.005067 | 2.749 |
| 157.014703 | 2.874 |
| 157.035227 | 2.469 |
| 157.0555 | 2.15 |
| 157.083871 | 2.072 |
| 157.09499 | 2.082 |
| 157.11506 | 2.121 |
| 157.13559 | 1.658 |
| 157.163536 | 1.541 |
| 157.175564 | 1.474 |
| 157.196592 | 1.348 |
| 157.214898 | 1.232 |
| 157.241819 | 1.222 |
| 157.25561 | 1.338 |
| 157.275626 | 1.047 |
| 157.298808 | 0.381 |
| 157.324523 | 0.314 |
| 157.336764 | 0.593 |
| 157.355489 | 0.507 |
| 157.375409 | 0.439 |
| 157.404451 | 0.206 |
| 157.415944 | 0.052 |
| 157.435241 | 0.032 |
| 157.455489 | -0.103 |
| 157.486364 | -0.017 |
| 157.494803 | -0.181 |
| 157.514802 | -0.374 |
| 157.535503 | -0.481 |
| 157.56459 | -0.482 |
| 157.57568 | -0.616 |
| 157.596439 | -0.665 |
| 157.614744 | -0.752 |
| 157.644962 | -0.781 |
| 157.655583 | -0.531 |
| 157.675679 | -0.791 |
| 157.697019 | -0.869 |
| 157.724937 | -0.86 |
| 157.735726 | -0.755 |
| 157.755551 | -0.919 |
| 157.775678 | -1.093 |
| 157.807004 | -0.793 |
| 157.814594 | -0.764 |
| 157.835256 | -0.929 |
| 157.855625 | -1.026 |
| 157.903661 | -1.036 |
| 157.914936 | -1.075 |
| 157.935562 | -0.823 |
| 157.95849 | -0.795 |
| 157.975757 | -0.92 |
| 157.997168 | -1.066 |
| 158.014812 | -0.892 |
| 158.039438 | -0.892 |
| 158.055674 | -0.893 |
| 158.075727 | -0.7 |
| 158.098083 | -0.575 |
| 158.122051 | -0.546 |
| 158.13624 | -0.546 |
| 158.155365 | -0.681 |
| 158.175745 | -0.238 |
| 158.202247 | -0.286 |
| 158.215374 | -0.19 |
| 158.235251 | -0.17 |
| 158.255455 | 0.216 |
| 158.281687 | 0.476 |
| 158.29544 | 0.504 |
| 158.314739 | 0.514 |
| 158.335478 | 0.573 |
| 158.362703 | 0.641 |
| 158.375785 | 0.496 |
| 158.396286 | 0.496 |
| 158.414912 | 0.525 |
| 158.4404 | 0.795 |
| 158.455455 | 0.891 |
| 158.4757 | 1.229 |
| 158.498953 | 1.123 |
| 158.524157 | 0.756 |
| 158.535553 | 0.842 |
| 158.555589 | 1.084 |
| 158.575672 | 1.441 |
| 158.604549 | 1.935 |
| 158.614838 | 2.06 |
| 158.635315 | 2.098 |
| 158.655476 | 2.446 |
| 158.684336 | 2.601 |
| 158.695145 | 2.823 |
| 158.714629 | 3.026 |
| 158.735511 | 3.103 |
| 158.764796 | 3.393 |
| 158.775666 | 3.432 |
| 158.79693 | 3.432 |
| 158.815311 | 3.413 |
| 158.841977 | 3.471 |
| 158.855606 | 3.393 |
| 158.875681 | 3.297 |
| 158.89599 | 3.577 |
| 158.921903 | 3.809 |
| 158.935472 | 3.925 |
| 158.955427 | 3.819 |
| 158.975684 | 3.925 |
| 159.025664 | 4.245 |
| 159.036985 | 4.322 |
| 159.055504 | 4.574 |
| 159.080953 | 4.748 |
| 159.095143 | 4.883 |
| 159.115249 | 4.787 |
| 159.135451 | 4.873 |
| 159.162827 | 4.874 |
| 159.175745 | 4.825 |
| 159.195392 | 4.767 |
| 159.21488 | 5.146 |
| 159.237454 | 5.32 |
| 159.255644 | 5.504 |
| 159.275668 | 5.514 |
| 159.295459 | 5.379 |
| 159.320697 | 5.146 |
| 159.335689 | 4.896 |
| 159.355709 | 4.847 |
| 159.375498 | 4.934 |
| 159.402558 | 5.351 |
| 159.415547 | 5.351 |
| 159.435566 | 5.274 |
| 159.455478 | 5.4 |
| 159.482701 | 5.41 |
| 159.49522 | 5.352 |
| 159.514822 | 5.284 |
| 159.535392 | 5.111 |
| 159.562678 | 5.14 |
| 159.575682 | 5.159 |
| 159.597026 | 5.063 |
| 159.614882 | 4.86 |
| 159.640738 | 4.774 |
| 159.655523 | 4.812 |
| 159.675678 | 4.755 |
| 159.697063 | 4.745 |
| 159.72307 | 4.736 |
| 159.735699 | 4.687 |
| 159.755491 | 4.456 |
| 159.77569 | 4.263 |
| 159.805004 | 4.07 |
| 159.815097 | 4.041 |
| 159.835231 | 4.052 |
| 159.856537 | 3.935 |
| 159.88196 | 3.945 |
| 159.895089 | 3.83 |
| 159.914724 | 3.742 |
| 159.935608 | 3.704 |
| 159.964191 | 3.636 |
| 159.975662 | 3.307 |
| 159.996375 | 2.989 |
| 160.014906 | 2.912 |
| 160.042413 | 2.613 |
| 160.055588 | 2.574 |
| 160.075753 | 2.497 |
| 160.096932 | 2.187 |
| 160.141209 | 2.004 |
| 160.156437 | 1.792 |
| 160.175676 | 1.812 |
| 160.215518 | 1.84 |
| 160.235364 | 1.57 |
| 160.255482 | 1.279 |
| 160.279439 | 0.902 |
| 160.295255 | 0.747 |
| 160.314933 | 0.709 |
| 160.335489 | 0.815 |
| 160.361746 | 1.048 |
| 160.376129 | 1.096 |
| 160.39568 | 0.709 |
| 160.415846 | 0.564 |
| 160.43896 | 0.4 |
| 160.455621 | 0.274 |
| 160.475616 | 0.245 |
| 160.495473 | -0.026 |
| 160.52165 | -0.132 |
| 160.535573 | -0.229 |
| 160.555672 | -0.403 |
| 160.575666 | -0.645 |
| 160.602596 | -0.81 |
| 160.615306 | -0.858 |
| 160.635372 | -0.916 |
| 160.655476 | -1.09 |
| 160.683034 | -1.09 |
| 160.695482 | -1.003 |
| 160.714823 | -1.041 |
| 160.735555 | -1.11 |
| 160.763154 | -0.907 |
| 160.775664 | -0.917 |
| 160.796616 | -0.926 |
| 160.814922 | -1.245 |
| 160.841176 | -1.391 |
| 160.855459 | -1.449 |
| 160.875753 | -1.45 |
| 160.896645 | -1.595 |
| 160.921488 | -1.711 |
| 160.935175 | -1.692 |
| 160.955478 | -1.605 |
| 160.975783 | -1.547 |
| 161.003852 | -1.644 |
| 161.015223 | -1.828 |
| 161.035313 | -1.779 |
| 161.055544 | -1.693 |
| 161.083713 | -1.829 |
| 161.095051 | -1.877 |
| 161.114701 | -1.935 |
| 161.15585 | -1.771 |
| 161.181403 | -1.771 |
| 161.195807 | -1.809 |
| 161.214889 | -1.79 |
| 161.235501 | -2.023 |
| 161.283024 | -1.908 |
| 161.296609 | -1.966 |
| 161.31491 | -1.784 |
| 161.338637 | -1.456 |
| 161.355479 | -1.388 |
| 161.375667 | -1.33 |
| 161.414896 | -1.456 |
| 161.436543 | -1.465 |
| 161.455394 | -1.339 |
| 161.475668 | -1.029 |
| 161.495049 | -0.768 |
| 161.519272 | -0.758 |
| 161.535752 | -0.71 |
| 161.555469 | -0.797 |
| 161.575774 | -0.682 |
| 161.601278 | -0.499 |
| 161.615228 | -0.548 |
| 161.635287 | -0.423 |
| 161.655483 | -0.278 |
| 161.682297 | -0.026 |
| 161.694927 | -0.239 |
| 161.714931 | -0.133 |
| 161.735488 | -0.171 |
| 161.761832 | 0.177 |
| 161.775491 | 0.505 |
| 161.795282 | 0.592 |
| 161.815934 | 0.708 |
| 161.839621 | 1.046 |
| 161.855613 | 1.239 |
| 161.875796 | 1.278 |
| 161.894959 | 1.549 |
| 161.923247 | 1.452 |
| 161.935767 | 1.587 |
| 161.955483 | 1.635 |
| 161.975527 | 1.837 |
| 162.003554 | 1.954 |
| 162.01464 | 1.906 |
| 162.035594 | 1.887 |
| 162.055481 | 1.906 |
| 162.083317 | 1.944 |
| 162.095014 | 1.916 |
| 162.11529 | 2.07 |
| 162.135444 | 2.186 |
| 162.163557 | 2.302 |
| 162.175715 | 2.292 |
| 162.19678 | 2.467 |
| 162.214738 | 2.525 |
| 162.241034 | 2.853 |
| 162.255479 | 3.115 |
| 162.275588 | 3.327 |
| 162.314799 | 3.347 |
| 162.360294 | 3.347 |
| 162.376116 | 3.308 |
| 162.395996 | 3.357 |
| 162.417695 | 3.328 |
| 162.435501 | 3.357 |
| 162.45509 | 3.985 |
| 162.475664 | 3.898 |
| 162.500972 | 4.024 |
| 162.515111 | 3.898 |
| 162.535377 | 3.928 |
| 162.555493 | 4.285 |
| 162.580633 | 3.986 |
| 162.59526 | 3.908 |
| 162.614818 | 3.754 |
| 162.635312 | 3.677 |
| 162.661279 | 3.726 |
| 162.675671 | 3.784 |
| 162.695231 | 4.006 |
| 162.714844 | 4.055 |
| 162.738959 | 3.833 |
| 162.755836 | 3.862 |
| 162.775708 | 3.959 |
| 162.794821 | 4.201 |
| 162.818185 | 4.539 |
| 162.835739 | 4.539 |
| 162.855562 | 4.366 |
| 162.875665 | 4.056 |
| 162.902527 | 3.786 |
| 162.915215 | 3.796 |
| 162.935238 | 3.921 |
| 162.955448 | 3.893 |
| 162.982697 | 3.632 |
| 162.995735 | 3.585 |
| 163.014919 | 3.671 |
| 163.035466 | 3.653 |
| 163.062742 | 3.652 |
| 163.075697 | 3.661 |
| 163.096725 | 3.584 |
| 163.114742 | 3.44 |
| 163.140668 | 3.373 |
| 163.155573 | 3.431 |
| 163.175674 | 3.422 |
| 163.199171 | 3.19 |
| 163.224139 | 2.852 |
| 163.236601 | 2.958 |
| 163.255461 | 2.688 |
| 163.275174 | 2.416 |
| 163.30375 | 1.943 |
| 163.314943 | 1.915 |
| 163.335581 | 2.166 |
| 163.35552 | 2.437 |
| 163.401257 | 2.437 |
| 163.414998 | 2.389 |
| 163.435263 | 2.312 |
| 163.459253 | 2.274 |
| 163.475727 | 2.061 |
| 163.496925 | 1.713 |
| 163.514746 | 1.626 |
| 163.538874 | 1.771 |
| 163.555502 | 1.675 |
| 163.575667 | 1.404 |
| 163.597281 | 1.134 |
| 163.619759 | 1.134 |
| 163.635479 | 1.105 |
| 163.655587 | 1.037 |
| 163.675714 | 1.018 |
| 163.701317 | 0.592 |
| 163.714822 | 0.399 |
| 163.735314 | 0.495 |
| 163.755651 | 0.727 |
| 163.780954 | 0.64 |
| 163.795209 | 0.437 |
| 163.814753 | 0.611 |
| 163.835478 | 0.37 |
| 163.862984 | 0.408 |
| 163.875654 | 0.39 |
| 163.896911 | 0.341 |
| 163.914739 | 0.245 |
| 163.941905 | -0.249 |
| 163.95579 | -0.277 |
| 163.975661 | -0.288 |
| 163.996535 | -0.364 |
| 164.022724 | -0.52 |
| 164.036357 | -0.645 |
| 164.05504 | -0.684 |
| 164.07566 | -0.858 |
| 164.103401 | -0.868 |
| 164.115737 | -0.888 |
| 164.135186 | -0.82 |
| 164.155462 | -0.878 |
| 164.182236 | -1.004 |
| 164.195109 | -0.994 |
| 164.21476 | -1.014 |
| 164.235496 | -0.898 |
| 164.264163 | -0.86 |
| 164.275669 | -0.822 |
| 164.297215 | -0.956 |
| 164.31475 | -0.832 |
| 164.342079 | -0.899 |
| 164.355463 | -0.909 |
| 164.375615 | -1.064 |
| 164.398823 | -1.074 |
| 164.4238 | -1.199 |
| 164.435913 | -1.122 |
| 164.455472 | -1.267 |
| 164.475653 | -1.228 |
| 164.524735 | -1.355 |
| 164.535775 | -1.452 |
| 164.555535 | -1.537 |
| 164.581058 | -1.481 |
| 164.595214 | -1.462 |
| 164.615198 | -1.365 |
| 164.63572 | -1.326 |
| 164.661283 | -1.452 |
| 164.675109 | -1.385 |
| 164.695385 | -1.163 |
| 164.715378 | -0.941 |
| 164.739551 | -0.989 |
| 164.755599 | -1.066 |
| 164.775671 | -1.105 |
| 164.795415 | -1.057 |
| 164.821415 | -0.44 |
| 164.835701 | -0.189 |
| 164.855454 | -0.498 |
| 164.87566 | -0.604 |
| 164.902641 | -0.16 |
| 164.914869 | -0.168 |
| 164.935737 | -0.15 |
| 164.955463 | -0.343 |
| 164.980643 | -0.749 |
| 164.99494 | -0.778 |
| 165.014921 | -0.952 |
| 165.035401 | -0.808 |
| 165.063475 | -0.527 |
| 165.075426 | -0.421 |
| 165.096678 | -0.334 |
| 165.114736 | -0.122 |
| 165.140917 | 0.167 |
| 165.155891 | 0.206 |
| 165.175664 | 0.448 |
| 165.199198 | 0.322 |
| 165.224148 | 0.275 |
| 165.236258 | 0.391 |
| 165.255499 | 0.651 |
| 165.275523 | 0.757 |
| 165.30399 | 0.873 |
| 165.314728 | 0.979 |
| 165.335489 | 0.979 |
| 165.355514 | 1.162 |
| 165.384143 | 1.404 |
| 165.39463 | 1.336 |
| 165.414745 | 1.472 |
| 165.435515 | 1.539 |
| 165.464381 | 1.597 |
| 165.47566 | 1.51 |
| 165.496979 | 1.655 |
| 165.514744 | 1.79 |
| 165.542235 | 1.907 |
| 165.555534 | 1.83 |
| 165.575662 | 1.723 |
| 165.615187 | 1.723 |
| 165.659351 | 1.869 |
| 165.676844 | 2.023 |
| 165.694962 | 2.072 |
| 165.718921 | 2.091 |
| 165.735482 | 2.139 |
| 165.755762 | 2.429 |
| 165.775651 | 2.468 |
| 165.80186 | 2.478 |
| 165.81512 | 2.545 |
| 165.835236 | 2.623 |
| 165.85551 | 2.584 |
| 165.882404 | 2.96 |
| 165.894915 | 3.096 |
| 165.915635 | 2.99 |
| 165.935477 | 2.99 |
| 165.964011 | 3.184 |
| 165.975693 | 3.193 |
| 165.996862 | 3.319 |
| 166.015211 | 3.386 |
| 166.039632 | 3.338 |
| 166.056209 | 3.512 |
| 166.075665 | 3.734 |
| 166.09548 | 3.686 |
| 166.12023 | 3.561 |
| 166.135804 | 3.533 |
| 166.155465 | 3.726 |
| 166.175659 | 3.543 |
| 166.203767 | 3.08 |
| 166.214796 | 2.954 |
| 166.235196 | 2.934 |
| 166.255475 | 2.848 |
| 166.28377 | 3.002 |
| 166.294921 | 2.944 |
| 166.314917 | 2.8 |
| 166.335473 | 3.109 |
| 166.364081 | 3.573 |
| 166.3755 | 3.698 |
| 166.396516 | 3.495 |
| 166.414775 | 3.65 |
| 166.4416 | 3.738 |
| 166.455544 | 3.718 |
| 166.47566 | 3.728 |
| 166.498956 | 3.573 |
| 166.524665 | 3.275 |
| 166.535662 | 3.198 |
| 166.555456 | 3.333 |
| 166.575885 | 3.256 |
| 166.604823 | 2.841 |
| 166.614883 | 2.677 |
| 166.635424 | 2.657 |
| 166.655468 | 2.542 |
| 166.702088 | 2.513 |
| 166.714815 | 2.552 |
| 166.735238 | 2.639 |
| 166.759669 | 2.803 |
| 166.775697 | 2.494 |
| 166.796888 | 2.61 |
| 166.814742 | 2.562 |
| 166.83864 | 2.417 |
| 166.855533 | 2.301 |
| 166.875587 | 2.291 |
| 166.897151 | 2.185 |
| 166.921437 | 2.031 |
| 166.935318 | 2.06 |
| 166.955464 | 1.973 |
| 166.975753 | 1.818 |
| 167.003414 | 1.731 |
| 167.014936 | 1.712 |
| 167.035303 | 1.655 |
| 167.055475 | 1.529 |
| 167.081126 | 1.336 |
| 167.095026 | 1.23 |
| 167.114965 | 1.2 |
| 167.135664 | 1.181 |
| 167.16319 | 0.987 |
| 167.175702 | 0.901 |
| 167.196692 | 0.853 |
| 167.214877 | 0.785 |
| 167.241698 | 0.766 |
| 167.255664 | 0.785 |
| 167.275488 | 0.785 |
| 167.2965 | 0.669 |
| 167.322931 | 0.679 |
| 167.335834 | 0.611 |
| 167.355557 | 0.282 |
| 167.375654 | 0.137 |
| 167.404321 | 0.108 |
| 167.415849 | -0.018 |
| 167.435186 | -0.163 |
| 167.455525 | -0.191 |
| 167.482675 | -0.017 |
| 167.495168 | -0.114 |
| 167.514776 | -0.229 |
| 167.535563 | -0.288 |
| 167.564151 | -0.491 |
| 167.575655 | -0.578 |
| 167.596797 | -0.54 |
| 167.614776 | -0.588 |
| 167.642074 | -0.501 |
| 167.655506 | -0.626 |
| 167.675665 | -0.897 |
| 167.699051 | -1.081 |
| 167.725746 | -1.313 |
| 167.735675 | -1.361 |
| 167.755671 | -1.584 |
| 167.77565 | -1.545 |
| 167.825494 | -1.565 |
| 167.835714 | -1.478 |
| 167.855484 | -1.488 |
| 167.881547 | -1.478 |
| 167.894853 | -1.527 |
| 167.914783 | -1.518 |
| 167.935496 | -1.373 |
| 167.961876 | -1.016 |
| 167.975668 | -1.034 |
| 167.995223 | -1.344 |
| 168.014857 | -1.682 |
| 168.039371 | -1.528 |
| 168.055776 | -1.373 |
| 168.075656 | -1.644 |
| 168.094693 | -1.934 |
| 168.118182 | -2.04 |
| 168.135865 | -2.05 |
| 168.155461 | -1.953 |
| 168.175655 | -1.895 |
| 168.203017 | -2.001 |
| 168.215209 | -1.838 |
| 168.235604 | -1.838 |
| 168.255471 | -1.886 |
| 168.283796 | -1.799 |
| 168.295421 | -1.78 |
| 168.314672 | -1.945 |
| 168.335437 | -1.868 |
| 168.363523 | -1.752 |
| 168.375851 | -1.704 |
| 168.396405 | -1.781 |
| 168.41494 | -1.762 |
| 168.441297 | -1.694 |
| 168.455821 | -1.753 |
| 168.475659 | -1.801 |
| 168.497666 | -1.762 |
| 168.523065 | -1.695 |
| 168.535712 | -1.647 |
| 168.555461 | -1.714 |
| 168.575388 | -1.685 |
| 168.604461 | -1.656 |
| 168.615216 | -1.676 |
| 168.635809 | -1.473 |
| 168.655561 | -1.463 |
| 168.683705 | -1.425 |
| 168.695855 | -1.348 |
| 168.715408 | -1.396 |
| 168.735474 | -1.299 |
| 168.764412 | -0.952 |
| 168.775706 | -0.913 |
| 168.796892 | -0.865 |
| 168.814863 | -0.816 |
| 168.842095 | -0.711 |
| 168.855605 | -0.566 |
| 168.875883 | -0.421 |
| 168.897991 | -0.17 |
| 168.944682 | -0.372 |
| 168.955154 | -0.209 |
| 168.975706 | 0.072 |
| 169.000675 | 0.101 |
| 169.015664 | 0.052 |
| 169.035277 | -0.034 |
| 169.055475 | 0.071 |
| 169.080596 | 0.12 |
| 169.095224 | 0.361 |
| 169.115206 | 0.071 |
| 169.135507 | 0.12 |
| 169.162928 | 0.41 |
| 169.175643 | 0.555 |
| 169.197336 | 0.999 |
| 169.21476 | 1.241 |
| 169.239809 | 1.279 |
| 169.25564 | 1.328 |
| 169.275655 | 1.308 |
| 169.297075 | 1.192 |
| 169.321606 | 1.095 |
| 169.33524 | 1.143 |
| 169.355005 | 1.298 |
| 169.374954 | 1.482 |
| 169.402727 | 1.511 |
| 169.415798 | 1.472 |
| 169.435234 | 1.511 |
| 169.455586 | 1.531 |
| 169.483875 | 1.695 |
| 169.495259 | 1.744 |
| 169.514901 | 1.898 |
| 169.535457 | 2.072 |
| 169.563026 | 2.314 |
| 169.576286 | 2.285 |
| 169.59627 | 2.14 |
| 169.614909 | 2.15 |
| 169.641247 | 2.294 |
| 169.655381 | 2.372 |
| 169.675699 | 2.536 |
| 169.699362 | 2.545 |
| 169.724272 | 2.478 |
| 169.735823 | 2.546 |
| 169.755481 | 2.826 |
| 169.775642 | 2.798 |
| 169.808169 | 3.087 |
| 169.814789 | 3.087 |
| 169.835387 | 3.232 |
| 169.855456 | 3.387 |
| 169.885008 | 3.552 |
| 169.895202 | 3.561 |
| 169.914877 | 3.542 |
| 169.935011 | 3.59 |
| 169.964062 | 3.658 |
| 169.975769 | 3.59 |
| 169.996831 | 3.571 |
| 170.014847 | 3.455 |
| 170.060249 | 3.736 |
| 170.076358 | 3.765 |
| 170.09656 | 3.862 |
| 170.117952 | 3.63 |
| 170.13528 | 3.321 |
| 170.155451 | 3.302 |
| 170.17565 | 3.273 |
| 170.201024 | 3.244 |
| 170.214811 | 3.176 |
| 170.235312 | 3.215 |
| 170.255466 | 3.37 |
| 170.28123 | 3.457 |
| 170.294896 | 3.505 |
| 170.315167 | 3.447 |
| 170.335477 | 3.534 |
| 170.361288 | 3.593 |
| 170.375595 | 3.718 |
| 170.395368 | 3.815 |
| 170.414967 | 3.834 |
| 170.438885 | 3.776 |
| 170.455727 | 3.41 |
| 170.475694 | 3.477 |
| 170.49527 | 3.439 |
| 170.518976 | 3.362 |
| 170.535558 | 3.275 |
| 170.555461 | 3.121 |
| 170.575318 | 2.908 |
| 170.601811 | 2.86 |
| 170.614698 | 2.879 |
| 170.635579 | 2.812 |
| 170.655466 | 2.745 |
| 170.682985 | 2.715 |
| 170.694917 | 2.677 |
| 170.715251 | 2.696 |
| 170.735458 | 2.783 |
| 170.762716 | 2.793 |
| 170.775655 | 2.754 |
| 170.796775 | 2.619 |
| 170.814744 | 2.522 |
| 170.839953 | 2.532 |
| 170.854919 | 2.494 |
| 170.875649 | 2.31 |
| 170.896775 | 2.137 |
| 170.922777 | 2.07 |
| 170.935683 | 2.079 |
| 170.955489 | 2.088 |
| 170.975749 | 2.059 |
| 171.00448 | 2.011 |
| 171.01483 | 2.03 |
| 171.035236 | 1.828 |
| 171.055693 | 1.731 |
| 171.099801 | 1.732 |
| 171.114894 | 1.731 |
| 171.135216 | 1.423 |
| 171.156931 | 1.461 |
| 171.175728 | 1.219 |
| 171.197904 | 1.325 |
| 171.214668 | 1.228 |
| 171.236483 | 1.354 |
| 171.255832 | 1.354 |
| 171.275979 | 1.306 |
| 171.297192 | 1.306 |
| 171.319929 | 1.19 |
| 171.336124 | 1.219 |
| 171.355158 | 1.103 |
| 171.375643 | 0.958 |
| 171.400688 | 0.919 |
| 171.415513 | 0.929 |
| 171.435278 | 0.687 |
| 171.455447 | 0.639 |
| 171.481569 | 0.543 |
| 171.495221 | 0.514 |
| 171.515004 | 0.601 |
| 171.535509 | 0.562 |
| 171.56178 | 0.301 |
| 171.575657 | 0.243 |
| 171.595295 | 0.185 |
| 171.61621 | -0.057 |
| 171.63902 | -0.211 |
| 171.655578 | -0.241 |
| 171.675549 | -0.221 |
| 171.695295 | -0.153 |
| 171.721061 | -0.086 |
| 171.735527 | -0.144 |
| 171.755468 | -0.26 |
| 171.775643 | -0.163 |
| 171.80366 | -0.222 |
| 171.814859 | -0.299 |
| 171.835191 | -0.25 |
| 171.855497 | -0.241 |
| 171.882442 | -0.492 |
| 171.895693 | -0.453 |
| 171.915323 | -0.337 |
| 171.935645 | -0.676 |
| 171.962735 | -0.715 |
| 171.975648 | -0.589 |
| 171.99705 | -0.492 |
| 172.015137 | -0.608 |
| 172.04142 | -0.841 |
| 172.055482 | -0.88 |
| 172.075651 | -0.948 |
| 172.097066 | -0.813 |
| 172.124468 | -0.649 |
| 172.135753 | -0.765 |
| 172.155465 | -0.852 |
| 172.175654 | -0.785 |
| 172.223547 | -0.871 |
| 172.235645 | -0.88 |
| 172.255458 | -0.783 |
| 172.279874 | -0.745 |
| 172.29515 | -0.783 |
| 172.315144 | -0.947 |
| 172.335462 | -0.996 |
| 172.360976 | -1.199 |
| 172.375665 | -1.393 |
| 172.395154 | -1.374 |
| 172.415668 | -1.084 |
| 172.438048 | -0.949 |
| 172.455494 | -0.94 |
| 172.475639 | -0.949 |
| 172.495107 | -0.853 |
| 172.518017 | -0.631 |
| 172.53555 | -0.398 |
| 172.555543 | -0.592 |
| 172.575645 | -0.592 |
| 172.602519 | -0.699 |
| 172.614701 | -0.641 |
| 172.635586 | -0.486 |
| 172.655548 | -0.467 |
| 172.682197 | -0.477 |
| 172.695834 | -0.467 |
| 172.714753 | -0.438 |
| 172.735515 | -0.293 |
| 172.76329 | -0.11 |
| 172.77565 | -0.081 |
| 172.79525 | -0.148 |
| 172.814914 | -0.216 |
| 172.839775 | -0.255 |
| 172.854849 | -0.216 |
| 172.875641 | 0.102 |
| 172.894952 | 0.218 |
| 172.919646 | 0.121 |
| 172.934805 | 0.112 |
| 172.955357 | 0.17 |
| 172.975834 | 0.199 |
| 173.003051 | 0.19 |
| 173.015417 | 0.103 |
| 173.035361 | -0.09 |
| 173.05564 | 0.102 |
| 173.084039 | 0.353 |
| 173.095087 | 0.45 |
| 173.114956 | 0.614 |
| 173.135534 | 0.758 |
| 173.163229 | 0.643 |
| 173.175864 | 0.739 |
| 173.196735 | 0.865 |
| 173.214753 | 0.991 |
| 173.240261 | 1.02 |
| 173.25567 | 1.02 |
| 173.275646 | 1.001 |
| 173.297329 | 0.942 |
| 173.343227 | 0.721 |
| 173.355571 | 0.807 |
| 173.375649 | 0.914 |
| 173.400973 | 1.28 |
| 173.414909 | 1.329 |
| 173.435323 | 1.503 |
| 173.455425 | 1.503 |
| 173.479831 | 1.763 |
| 173.49553 | 1.764 |
| 173.514759 | 1.793 |
| 173.535467 | 1.996 |
| 173.561853 | 2.14 |
| 173.575664 | 2.063 |
| 173.595315 | 1.812 |
| 173.615189 | 1.667 |
| 173.638021 | 1.6 |
| 173.656012 | 1.745 |
| 173.675634 | 1.957 |
| 173.69492 | 1.812 |
| 173.718505 | 1.677 |
| 173.735519 | 1.61 |
| 173.755658 | 1.735 |
| 173.775637 | 1.976 |
| 173.802316 | 2.035 |
| 173.815319 | 2.112 |
| 173.835283 | 2.267 |
| 173.855247 | 2.508 |
| 173.882327 | 2.499 |
| 173.895216 | 2.499 |
| 173.914881 | 2.528 |
| 173.935398 | 2.412 |
| 173.963492 | 2.653 |
| 173.975656 | 2.325 |
| 173.996859 | 2.441 |
| 174.014905 | 2.267 |
| 174.040845 | 2.113 |
| 174.055517 | 1.997 |
| 174.075699 | 2.026 |
| 174.097806 | 2.017 |
| 174.123087 | 2.065 |
| 174.135661 | 2.055 |
| 174.155448 | 2.123 |
| 174.197392 | 2.21 |
| 174.222824 | 2.375 |
| 174.235907 | 2.336 |
| 174.255537 | 2.307 |
| 174.27565 | 2.278 |
| 174.304325 | 2.481 |
| 174.314846 | 2.636 |
| 174.335235 | 2.704 |
| 174.355174 | 2.511 |
| 174.402538 | 2.318 |
| 174.415047 | 2.192 |
| 174.435218 | 2.23 |
| 174.459374 | 2.143 |
| 174.47575 | 2.115 |
| 174.496573 | 2.077 |
| 174.514758 | 2.105 |
| 174.538788 | 2.115 |
| 174.555631 | 2.096 |
| 174.575732 | 2.173 |
| 174.596929 | 2.144 |
| 174.621185 | 2.203 |
| 174.636174 | 2.405 |
| 174.65545 | 2.212 |
| 174.675654 | 2.241 |
| 174.702802 | 2.183 |
| 174.715891 | 2.077 |
| 174.735132 | 2.106 |
| 174.755438 | 1.981 |
| 174.783215 | 1.73 |
| 174.795126 | 1.798 |
| 174.814757 | 1.923 |
| 174.835539 | 1.884 |
| 174.862991 | 1.856 |
| 174.875818 | 1.798 |
| 174.89664 | 1.556 |
| 174.914745 | 1.498 |
| 174.941032 | 1.537 |
| 174.955481 | 1.556 |
| 174.975655 | 1.498 |
| 174.999113 | 1.469 |
| 175.023358 | 1.382 |
| 175.035598 | 1.401 |
| 175.055962 | 1.257 |
| 175.075726 | 1.286 |
| 175.104823 | 1.218 |
| 175.114808 | 1.15 |
| 175.135788 | 1.112 |
| 175.155433 | 0.948 |
| 175.184082 | 0.725 |
| 175.195149 | 0.639 |
| 175.215017 | 0.609 |
| 175.235736 | 0.697 |
| 175.264166 | 0.755 |
| 175.275632 | 0.687 |
| 175.296666 | 0.62 |
| 175.314737 | 0.793 |
| 175.342209 | 0.677 |
| 175.355572 | 0.677 |
| 175.375717 | 0.504 |
| 175.395788 | 0.523 |
| 175.421766 | 0.475 |
| 175.435312 | 0.485 |
| 175.455594 | 0.349 |
| 175.475641 | 0.272 |
| 175.524316 | 0.117 |
| 175.535745 | 0.126 |
| 175.555448 | 0.078 |
| 175.580992 | 0.059 |
| 175.594808 | 0.04 |
| 175.615124 | 0.002 |
| 175.635401 | -0.066 |
| 175.663266 | -0.057 |
| 175.675691 | -0.202 |
| 175.697087 | -0.318 |
| 175.714993 | -0.435 |
| 175.740066 | -0.405 |
| 175.755566 | -0.443 |
| 175.775613 | -0.511 |
| 175.798961 | -0.579 |
| 175.823157 | -0.617 |
| 175.835584 | -0.569 |
| 175.85545 | -0.695 |
| 175.874842 | -0.859 |
| 175.902562 | -0.792 |
| 175.914693 | -0.811 |
| 175.935214 | -0.907 |
| 175.955562 | -0.956 |
| 175.984023 | -1.004 |
| 175.994891 | -0.966 |
| 176.014802 | -0.918 |
| 176.035325 | -0.86 |
| 176.06343 | -1.005 |
| 176.07564 | -0.986 |
| 176.095518 | -1.063 |
| 176.11477 | -1.044 |
| 176.140928 | -1.16 |
| 176.155474 | -1.111 |
| 176.17564 | -1.112 |
| 176.19666 | -1.363 |
| 176.222471 | -1.343 |
| 176.235627 | -1.266 |
| 176.255401 | -1.237 |
| 176.275693 | -1.227 |
| 176.303725 | -1.16 |
| 176.315103 | -1.208 |
| 176.335259 | -1.373 |
| 176.355594 | -1.402 |
| 176.381625 | -1.228 |
| 176.395004 | -1.267 |
| 176.414782 | -1.392 |
| 176.435525 | -1.421 |
| 176.464435 | -1.354 |
| 176.475739 | -1.325 |
| 176.497528 | -1.277 |
| 176.514791 | -1.325 |
| 176.541693 | -1.316 |
| 176.555121 | -1.277 |
| 176.575696 | -1.413 |
| 176.598807 | -1.48 |
| 176.643329 | -1.384 |
| 176.655506 | -1.471 |
| 176.674952 | -1.461 |
| 176.701035 | -1.529 |
| 176.715316 | -1.52 |
| 176.735152 | -1.51 |
| 176.755213 | -1.519 |
| 176.781506 | -1.298 |
| 176.79466 | -1.269 |
| 176.814978 | -1.279 |
| 176.835349 | -1.355 |
| 176.861308 | -1.375 |
| 176.875873 | -1.317 |
| 176.895152 | -1.278 |
| 176.916116 | -1.24 |
| 176.939548 | -1.25 |
| 176.954639 | -1.298 |
| 176.975589 | -1.279 |
| 176.995113 | -1.211 |
| 177.020139 | -1.172 |
| 177.0356 | -1.124 |
| 177.055587 | -1.172 |
| 177.07581 | -1.143 |
| 177.104053 | -0.999 |
| 177.11524 | -0.998 |
| 177.135202 | -0.931 |
| 177.155453 | -0.815 |
| 177.180912 | -0.699 |
| 177.195194 | -0.68 |
| 177.214752 | -0.622 |
| 177.236363 | -0.458 |
| 177.261745 | -0.439 |
| 177.275358 | -0.429 |
| 177.294949 | -0.42 |
| 177.314616 | -0.419 |
| 177.339325 | -0.429 |
| 177.355472 | -0.419 |
| 177.375635 | -0.216 |
| 177.396011 | -0.12 |
| 177.421181 | -0.081 |
| 177.43554 | -0.11 |
| 177.455437 | 0.373 |
| 177.475636 | 0.334 |
| 177.503397 | 0.257 |
| 177.51496 | 0.305 |
| 177.535219 | 0.45 |
| 177.555421 | 0.566 |
| 177.58378 | 0.643 |
| 177.59519 | 0.537 |
| 177.614779 | 0.507 |
| 177.635477 | 0.497 |
| 177.663783 | 0.768 |
| 177.67573 | 0.894 |
| 177.697242 | 0.72 |
| 177.714775 | 0.807 |
| 177.76163 | 1.154 |
| 177.776601 | 1.058 |
| 177.796887 | 1.067 |
| 177.81951 | 1.068 |
| 177.835136 | 1.175 |
| 177.855495 | 1.262 |
| 177.875636 | 1.195 |
| 177.901697 | 1.02 |
| 177.91494 | 1.01 |
| 177.935226 | 1.155 |
| 177.955415 | 1.271 |
| 177.982634 | 1.464 |
| 177.995802 | 1.57 |
| 178.014711 | 1.58 |
| 178.035377 | 1.667 |
| 178.062729 | 1.812 |
| 178.075672 | 1.745 |
| 178.096817 | 1.764 |
| 178.114924 | 1.986 |
| 178.140236 | 1.725 |
| 178.155461 | 1.754 |
| 178.175687 | 1.687 |
| 178.196542 | 1.764 |
| 178.220183 | 1.996 |
| 178.235409 | 1.986 |
| 178.255453 | 2.083 |
| 178.275634 | 2.102 |
| 178.303017 | 2.102 |
| 178.314722 | 2.083 |
| 178.335247 | 2.083 |
| 178.355432 | 2.064 |
| 178.382397 | 1.871 |
| 178.394919 | 1.852 |
| 178.414751 | 1.948 |
| 178.43551 | 1.861 |
| 178.463296 | 1.765 |
| 178.475675 | 1.794 |
| 178.495094 | 1.803 |
| 178.515736 | 1.939 |
| 178.540373 | 1.968 |
| 178.555652 | 2.016 |
| 178.57563 | 2.074 |
| 178.595316 | 2.074 |
| 178.620295 | 2.094 |
| 178.635695 | 2.104 |
| 178.655441 | 2.152 |
| 178.675635 | 2.104 |
| 178.703448 | 2.055 |
| 178.714817 | 2.094 |
| 178.735265 | 2.114 |
| 178.755591 | 2.075 |
| 178.803303 | 2.027 |
| 178.815243 | 2.114 |
| 178.835318 | 2.182 |
| 178.858552 | 2.133 |
| 178.875675 | 2.066 |
| 178.897963 | 2.172 |
| 178.914745 | 2.105 |
| 178.937887 | 2.076 |
| 178.955828 | 2.076 |
| 178.97563 | 1.969 |
| 178.995568 | 1.873 |
| 179.018173 | 1.873 |
| 179.035457 | 1.835 |
| 179.05545 | 1.912 |
| 179.075675 | 1.95 |
| 179.101038 | 2.028 |
| 179.115374 | 2.163 |
| 179.135497 | 2.414 |
| 179.155533 | 2.308 |
| 179.17952 | 2.124 |
| 179.195029 | 2.018 |
| 179.214957 | 1.69 |
| 179.23572 | 1.603 |
| 179.260279 | 1.7 |
| 179.275286 | 1.661 |
| 179.295432 | 1.846 |
| 179.314964 | 1.817 |
| 179.338286 | 1.759 |
| 179.355521 | 1.594 |
| 179.375628 | 1.353 |
| 179.39537 | 1.111 |
| 179.419983 | 1.314 |
| 179.436275 | 1.449 |
| 179.455512 | 1.661 |
| 179.47579 | 1.604 |
| 179.502954 | 1.556 |
| 179.515024 | 1.681 |
| 179.535409 | 1.798 |
| 179.555502 | 1.817 |
| 179.582683 | 1.865 |
| 179.595909 | 1.73 |
| 179.614869 | 1.401 |
| 179.635481 | 1.237 |
| 179.662586 | 0.986 |
| 179.675623 | 0.88 |
| 179.697095 | 0.658 |
| 179.715034 | 0.58 |
| 179.740398 | 0.657 |
| 179.755963 | 0.657 |
| 179.775736 | 0.735 |
| 179.798435 | 0.967 |
| 179.823332 | 0.793 |
| 179.835689 | 0.851 |
| 179.856087 | 0.909 |
| 179.875623 | 0.928 |
| 179.924875 | 0.687 |
| 179.935593 | 0.639 |
| 179.955448 | 0.754 |
| 179.979866 | 0.668 |
| 179.994836 | 0.687 |
| 180.014784 | 0.658 |
| 180.03542 | 0.416 |
| 180.064108 | 0.223 |
| 180.075688 | 0.069 |
| 180.095317 | 0.069 |
| 180.115294 | -0.018 |
| 180.138656 | 0.107 |
| 180.156236 | -0.028 |
| 180.175633 | -0.058 |
| 180.195506 | -0.086 |
| 180.218676 | 0.078 |
| 180.23619 | 0.107 |
| 180.255438 | 0.107 |
| 180.275651 | 0.029 |
| 180.301675 | -0.019 |
| 180.315828 | 0.039 |
| 180.335624 | 0.01 |
| 180.355564 | -0.029 |
| 180.381935 | -0.309 |
| 180.395239 | -0.26 |
| 180.415128 | -0.551 |
| 180.435309 | -0.628 |
| 180.462777 | -0.55 |
| 180.475634 | -0.705 |
| 180.497457 | -0.685 |
| 180.514809 | -0.753 |
| 180.540076 | -0.821 |
| 180.555301 | -0.753 |
| 180.575757 | -0.599 |
| 180.598552 | -0.541 |
| 180.622199 | -0.551 |
| 180.635528 | -0.551 |
| 180.655531 | -0.532 |
| 180.675636 | -0.561 |
| 180.702653 | -0.551 |
| 180.715374 | -0.57 |
| 180.735229 | -0.561 |
| 180.755155 | -0.608 |
| 180.780671 | -0.715 |
| 180.794651 | -0.812 |
| 180.814928 | -0.744 |
| 180.835532 | -0.803 |
| 180.862721 | -0.899 |
| 180.875801 | -1.063 |
| 180.897451 | -1.102 |
| 180.914752 | -1.093 |
| 180.94084 | -1.122 |
| 180.95586 | -1.083 |
| 180.975741 | -1.064 |
| 180.996762 | -1.17 |
| 181.041972 | -1.064 |
| 181.055549 | -0.996 |
| 181.075305 | -0.9 |
| 181.101248 | -1.112 |
| 181.115035 | -1.112 |
| 181.13557 | -1.064 |
| 181.155441 | -1.103 |
| 181.194911 | -1.18 |
| 181.215023 | -1.199 |
| 181.235446 | -1.141 |
| 181.259931 | -1.18 |
| 181.275525 | -1.151 |
| 181.295029 | -1.18 |
| 181.314795 | -1.103 |
| 181.337856 | -1.161 |
| 181.355682 | -1.229 |
| 181.375629 | -1.2 |
| 181.395244 | -1.2 |
| 181.419163 | -1.181 |
| 181.435685 | -1.268 |
| 181.455478 | -1.123 |
| 181.475846 | -1.229 |
| 181.501877 | -1.094 |
| 181.515249 | -1.017 |
| 181.535273 | -1.094 |
| 181.555429 | -1.065 |
| 181.580466 | -1.027 |
| 181.596349 | -0.978 |
| 181.614977 | -0.988 |
| 181.635433 | -1.094 |
| 181.66344 | -1.065 |
| 181.675281 | -1.065 |
| 181.695034 | -1.094 |
| 181.715551 | -1.123 |
| 181.739748 | -1.046 |
| 181.755573 | -0.959 |
| 181.775621 | -0.969 |
| 181.795012 | -0.921 |
| 181.835408 | -0.94 |
| 181.855104 | -0.699 |
| 181.87565 | -0.709 |
| 181.90318 | -0.544 |
| 181.914876 | -0.496 |
| 181.935236 | -0.409 |
| 181.955715 | -0.447 |
| 181.983282 | -0.592 |
| 181.995591 | -0.592 |
| 182.015 | -0.535 |
| 182.03544 | -0.505 |
| 182.062851 | -0.544 |
| 182.075627 | -0.554 |
| 182.095989 | -0.554 |
| 182.114832 | -0.564 |
| 182.162325 | -0.352 |
| 182.175633 | -0.371 |
| 182.196685 | -0.4 |
| 182.221898 | -0.361 |
| 182.235305 | -0.148 |
| 182.255444 | -0.12 |
| 182.276138 | -0.129 |
| 182.299808 | -0.033 |
| 182.314889 | 0.103 |
| 182.335381 | 0.199 |
| 182.35544 | 0.238 |
| 182.382348 | 0.045 |
| 182.394999 | 0.016 |
| 182.414987 | 0.035 |
| 182.435423 | -0.081 |
| 182.462071 | -0.081 |
| 182.474669 | -0.062 |
| 182.495097 | 0.016 |
| 182.515568 | 0.257 |
| 182.538398 | 0.441 |
| 182.555521 | 0.402 |
| 182.575443 | 0.392 |
| 182.594922 | 0.286 |
| 182.620507 | 0.363 |
| 182.635594 | 0.402 |
| 182.655531 | 0.363 |
| 182.67548 | 0.354 |
| 182.702804 | 0.47 |
| 182.714547 | 0.489 |
| 182.735177 | 0.402 |
| 182.755424 | 0.46 |
| 182.782443 | 0.634 |
| 182.794851 | 0.653 |
| 182.81493 | 0.682 |
| 182.835501 | 0.76 |
| 182.863189 | 0.798 |
| 182.875558 | 0.808 |
| 182.895253 | 0.798 |
| 182.915723 | 0.741 |
| 182.939947 | 0.683 |
| 182.955517 | 0.769 |
| 182.975724 | 0.886 |
| 182.995267 | 0.818 |
| 183.020462 | 0.779 |
| 183.035502 | 0.76 |
| 183.056048 | 0.798 |
| 183.075617 | 0.934 |
| 183.103303 | 0.973 |
| 183.115029 | 1.002 |
| 183.135249 | 1.088 |
| 183.155483 | 0.982 |
| 183.203462 | 1.002 |
| 183.214804 | 1.031 |
| 183.235238 | 1.108 |
| 183.258759 | 1.205 |
| 183.275652 | 1.128 |
| 183.297204 | 1.069 |
| 183.314649 | 0.963 |
| 183.336691 | 0.992 |
| 183.355742 | 1.118 |
| 183.375705 | 1.118 |
| 183.397135 | 1.06 |
| 183.420299 | 1.08 |
| 183.43544 | 1.109 |
| 183.455422 | 1.138 |
| 183.475648 | 1.186 |
| 183.502181 | 1.215 |
| 183.514745 | 1.341 |
| 183.53514 | 1.331 |
| 183.555476 | 1.235 |
| 183.582082 | 1.254 |
| 183.595393 | 1.254 |
| 183.615072 | 1.216 |
| 183.635501 | 1.302 |
| 183.662957 | 1.187 |
| 183.675618 | 1.273 |
| 183.695497 | 1.361 |
| 183.715625 | 1.332 |
| 183.739316 | 1.264 |
| 183.755539 | 1.157 |
| 183.775616 | 1.158 |
| 183.795022 | 1.187 |
| 183.821338 | 1.225 |
| 183.835639 | 1.168 |
| 183.85546 | 1.149 |
| 183.875674 | 1.09 |
| 183.903222 | 1.062 |
| 183.914784 | 1.148 |
| 183.935373 | 1.042 |
| 183.955525 | 1.004 |
| 183.981163 | 1.119 |
| 183.995147 | 1.177 |
| 184.015004 | 1.226 |
| 184.035436 | 1.207 |
| 184.063445 | 1.236 |
| 184.075625 | 1.207 |
| 184.0962 | 1.139 |
| 184.114953 | 1.149 |
| 184.140621 | 1.178 |
| 184.155462 | 1.13 |
| 184.175623 | 1.159 |
| 184.197552 | 1.023 |
| 184.221894 | 0.908 |
| 184.235348 | 0.918 |
| 184.255495 | 1.004 |
| 184.275631 | 0.889 |
| 184.323215 | 0.791 |
| 184.336649 | 0.811 |
| 184.355745 | 0.812 |
| 184.376815 | 0.802 |
| 184.395014 | 0.811 |
| 184.415033 | 0.898 |
| 184.435452 | 0.763 |
| 184.460869 | 0.782 |
| 184.475636 | 0.821 |
| 184.495446 | 0.695 |
| 184.514735 | 0.667 |
| 184.538222 | 0.589 |
| 184.55548 | 0.445 |
| 184.575625 | 0.473 |
| 184.595356 | 0.483 |
| 184.618341 | 0.454 |
| 184.636451 | 0.473 |
| 184.65543 | 0.454 |
| 184.675622 | 0.454 |
| 184.702361 | 0.416 |
| 184.714994 | 0.28 |
| 184.735737 | 0.28 |
| 184.7555 | 0.387 |
| 184.781888 | 0.377 |
| 184.795665 | 0.358 |
| 184.814882 | 0.329 |
| 184.835614 | 0.445 |
| 184.86241 | 0.232 |
| 184.875608 | 0.251 |
| 184.894872 | 0.223 |
| 184.914866 | 0.261 |
| 184.939839 | 0.126 |
| 184.955538 | -0.057 |
| 184.975717 | -0.086 |
| 184.995164 | -0.105 |
| 185.022031 | -0.125 |
| 185.035493 | -0.212 |
| 185.055532 | -0.299 |
| 185.075648 | -0.116 |
| 185.103113 | -0.241 |
| 185.1149 | -0.251 |
| 185.135708 | -0.183 |
| 185.15555 | -0.125 |
| 185.181925 | -0.028 |
| 185.195076 | -0.115 |
| 185.214772 | -0.26 |
| 185.235429 | -0.328 |
| 185.263441 | -0.212 |
| 185.274821 | -0.261 |
| 185.297074 | -0.483 |
| 185.315016 | -0.338 |
| 185.339566 | -0.376 |
| 185.355741 | -0.473 |
| 185.37492 | -0.386 |
| 185.395974 | -0.28 |
| 185.456092 | -0.319 |
| 185.475622 | -0.55 |
| 185.502033 | -0.618 |
| 185.515079 | -0.676 |
| 185.53519 | -0.637 |
| 185.555419 | -0.541 |
| 185.582386 | -0.551 |
| 185.594808 | -0.57 |
| 185.615101 | -0.648 |
| 185.63541 | -0.677 |
| 185.662736 | -0.648 |
| 185.675616 | -0.609 |
| 185.696887 | -0.532 |
| 185.714909 | -0.6 |
| 185.740618 | -0.706 |
| 185.755688 | -0.774 |
| 185.775622 | -0.793 |
| 185.798943 | -0.774 |
| 185.82328 | -0.899 |
| 185.835666 | -0.841 |
| 185.855461 | -0.774 |
| 185.875417 | -0.687 |
| 185.902682 | -0.677 |
| 185.914936 | -0.832 |
| 185.935219 | -0.784 |
| 185.955448 | -0.793 |
| 185.983188 | -0.639 |
| 185.994936 | -0.629 |
| 186.014762 | -0.774 |
| 186.035609 | -0.861 |
| 186.063706 | -0.822 |
| 186.075761 | -0.813 |
| 186.096853 | -0.832 |
| 186.114844 | -0.958 |
| 186.141452 | -1.006 |
| 186.155403 | -1.055 |
| 186.175205 | -0.968 |
| 186.197786 | -0.919 |
| 186.223603 | -0.862 |
| 186.23557 | -0.872 |
| 186.255418 | -0.91 |
| 186.275887 | -0.987 |
| 186.30503 | -0.862 |
| 186.314855 | -0.872 |
| 186.335311 | -0.997 |
| 186.355514 | -1.084 |
| 186.382277 | -1.026 |
| 186.395217 | -0.978 |
| 186.414738 | -0.959 |
| 186.435443 | -0.92 |
| 186.475606 | -0.939 |
| 186.497336 | -0.968 |
| 186.514775 | -0.997 |
| 186.560624 | -0.939 |
| 186.576617 | -0.91 |
| 186.596717 | -0.949 |
| 186.6193 | -1.104 |
| 186.635279 | -1.094 |
| 186.655434 | -0.892 |
| 186.675617 | -0.94 |
| 186.70115 | -0.95 |
| 186.71559 | -0.921 |
| 186.735211 | -0.892 |
| 186.755415 | -0.805 |
| 186.782314 | -0.882 |
| 186.794929 | -0.766 |
| 186.814933 | -0.737 |
| 186.835426 | -0.689 |
| 186.860715 | -0.834 |
| 186.875536 | -0.747 |
| 186.89499 | -0.535 |
| 186.915632 | -0.554 |
| 186.938208 | -0.564 |
| 186.955498 | -0.622 |
| 186.975622 | -0.583 |
| 186.994832 | -0.486 |
| 187.021332 | -0.564 |
| 187.035294 | -0.516 |
| 187.055528 | -0.651 |
| 187.075618 | -0.564 |
| 187.104273 | -0.66 |
| 187.114832 | -0.593 |
| 187.135183 | -0.458 |
| 187.155404 | -0.303 |
| 187.181671 | -0.342 |
| 187.194814 | -0.419 |
| 187.215345 | -0.409 |
| 187.235728 | -0.303 |
| 187.262879 | -0.216 |
| 187.275243 | -0.207 |
| 187.295409 | -0.255 |
| 187.314752 | -0.004 |
| 187.340081 | 0.054 |
| 187.35568 | 0.054 |
| 187.375739 | -0.033 |
| 187.394996 | -0.052 |
| 187.420836 | 0.112 |
| 187.435673 | 0.093 |
| 187.455453 | 0.122 |
| 187.475616 | -0.013 |
| 187.503128 | 0.054 |
| 187.515003 | 0.17 |
| 187.53523 | 0.17 |
| 187.55542 | 0.083 |
| 187.601622 | 0.218 |
| 187.614793 | 0.218 |
| 187.635282 | 0.257 |
| 187.659117 | 0.296 |
| 187.67579 | 0.354 |
| 187.697201 | 0.441 |
| 187.714821 | 0.45 |
| 187.736508 | 0.46 |
| 187.755606 | 0.402 |
| 187.775616 | 0.489 |
| 187.795065 | 0.469 |
| 187.819805 | 0.46 |
| 187.836107 | 0.479 |
| 187.855441 | 0.508 |
| 187.875682 | 0.469 |
| 187.901384 | 0.614 |
| 187.914943 | 0.75 |
| 187.935207 | 0.808 |
| 187.955439 | 0.847 |
| 187.980064 | 0.875 |
| 187.99585 | 0.866 |
| 188.014966 | 0.875 |
| 188.035399 | 0.808 |
| 188.062041 | 0.808 |
| 188.075626 | 0.798 |
| 188.094837 | 0.73 |
| 188.115617 | 0.885 |
| 188.139411 | 0.962 |
| 188.15547 | 0.885 |
| 188.175613 | 0.799 |
| 188.194827 | 0.856 |
| 188.221095 | 1.04 |
| 188.235572 | 1.117 |
| 188.255413 | 1.107 |
| 188.275736 | 0.943 |
| 188.302375 | 1.069 |
| 188.314879 | 1.079 |
| 188.335215 | 1.146 |
| 188.355537 | 1.137 |
| 188.380251 | 1.166 |
| 188.394812 | 1.137 |
| 188.414796 | 1.166 |
| 188.435447 | 1.243 |
| 188.462146 | 1.282 |
| 188.475618 | 1.33 |
| 188.494904 | 1.301 |
| 188.514783 | 1.301 |
| 188.540582 | 1.263 |
| 188.555484 | 1.224 |
| 188.575531 | 1.243 |
| 188.595533 | 1.224 |
| 188.62029 | 1.331 |
| 188.63566 | 1.389 |
| 188.655409 | 1.37 |
| 188.675658 | 1.302 |
| 188.723504 | 1.447 |
| 188.73476 | 1.524 |
| 188.75544 | 1.427 |
| 188.778137 | 1.36 |
| 188.79611 | 1.427 |
| 188.815267 | 1.399 |
| 188.835489 | 1.341 |
| 188.859849 | 1.427 |
| 188.875723 | 1.505 |
| 188.89597 | 1.524 |
| 188.914665 | 1.525 |
| 188.938773 | 1.351 |
| 188.956124 | 1.331 |
| 188.975605 | 1.341 |
| 188.995468 | 1.495 |
| 189.01814 | 1.486 |
| 189.035519 | 1.447 |
| 189.055454 | 1.438 |
| 189.075606 | 1.447 |
| 189.102043 | 1.322 |
| 189.115171 | 1.361 |
| 189.135184 | 1.351 |
| 189.155414 | 1.264 |
| 189.182925 | 1.206 |
| 189.195193 | 1.168 |
| 189.214802 | 1.197 |
| 189.23536000000001 | 1.351 |
| 189.262006 | 1.361 |
| 189.275704 | 1.371 |
| 189.295036 | 1.554 |
| 189.314785 | 1.747 |
| 189.339479 | 1.68 |
| 189.35556 | 1.535 |
| 189.375612 | 1.747 |
| 189.395025 | 1.535 |
| 189.419582 | 1.39 |
| 189.435728 | 1.381 |
| 189.455409 | 1.371 |
| 189.475761 | 1.158 |
| 189.501219 | 0.763 |
| 189.515218 | 0.763 |
| 189.53528 | 0.753 |
| 189.555551 | 0.695 |
| 189.58242 | 0.627 |
| 189.595057 | 0.608 |
| 189.614789 | 0.714 |
| 189.635452 | 0.888 |
| 189.66269 | 1.39 |
| 189.675604 | 1.477 |
| 189.696676 | 1.313 |
| 189.715106 | 1.159 |
| 189.740341 | 0.975 |
| 189.755498 | 1.033 |
| 189.775496 | 0.908 |
| 189.796788 | 0.753 |
| 189.841023 | 0.493 |
| 189.855639 | 0.473 |
| 189.875648 | 0.396 |
| 189.900944 | 0.521 |
| 189.915571 | 0.453 |
| 189.935582 | 0.357 |
| 189.95541 | 0.328 |
| 189.980738 | 0.347 |
| 189.994958 | 0.347 |
| 190.01493 | 0.473 |
| 190.035459 | 0.753 |
| 190.0603 | 0.714 |
| 190.075736 | 0.686 |
| 190.095883 | 0.695 |
| 190.115462 | 0.627 |
| 190.137864 | 0.463 |
| 190.155489 | 0.251 |
| 190.17566 | 0.058 |
| 190.195244 | 0.174 |
| 190.21856 | 0.222 |
| 190.235742 | 0.087 |
| 190.25552 | 0.097 |
| 190.275626 | 0.097 |
| 190.302924 | 0.145 |
| 190.315087 | 0.067 |
| 190.335138 | 0.135 |
| 190.355407 | -0.038 |
| 190.382343 | 0 |
| 190.395056 | 0.086 |
| 190.414746 | 0.125 |
| 190.435581 | 0.029 |
| 190.462637 | -0.048 |
| 190.475614 | -0.164 |
| 190.495062 | -0.231 |
| 190.514775 | -0.212 |
| 190.539792 | -0.232 |
| 190.555682 | -0.309 |
| 190.575452 | -0.405 |
| 190.594984 | -0.328 |
| 190.620795 | -0.58 |
| 190.636256 | -0.579 |
| 190.65545 | -0.502 |
| 190.675705 | -0.396 |
| 190.703502 | -0.56 |
| 190.715442 | -0.56 |
| 190.735291 | -0.608 |
| 190.755828 | -0.647 |
| 190.781862 | -0.695 |
| 190.795688 | -0.589 |
| 190.814897 | -0.589 |
| 190.835439 | -0.637 |
| 190.863298 | -0.609 |
| 190.875261 | -0.686 |
| 190.897268 | -0.657 |
| 190.914642 | -0.657 |
| 190.962108 | -0.696 |
| 190.976622 | -0.763 |
| 190.996405 | -0.802 |
| 191.019733 | -0.84 |
| 191.035221 | -0.869 |
| 191.055627 | -0.908 |
| 191.075603 | -0.947 |
| 191.101326 | -0.841 |
| 191.11483 | -0.783 |
| 191.135261 | -0.899 |
| 191.155414 | -0.976 |
| 191.181237 | -1.063 |
| 191.195072 | -1.034 |
| 191.214915 | -0.996 |
| 191.235539 | -0.957 |
| 191.262458 | -0.996 |
| 191.275194 | -1.015 |
| 191.296686 | -1.121 |
| 191.315264 | -1.102 |
| 191.340108 | -1.121 |
| 191.356201 | -1.053 |
| 191.375611 | -0.967 |
| 191.397371 | -1.112 |
| 191.422702 | -1.131 |
| 191.435815 | -1.228 |
| 191.455501 | -1.266 |
| 191.475725 | -1.296 |
| 191.502263 | -1.276 |
| 191.514828 | -1.199 |
| 191.535212 | -1.266 |
| 191.555422 | -1.314 |
| 191.582784 | -1.209 |
| 191.595028 | -1.15 |
| 191.614776 | -1.121 |
| 191.635415 | -1.169 |
| 191.662848 | -1.247 |
| 191.675668 | -1.208 |
| 191.696386 | -1.247 |
| 191.714749 | -1.334 |
| 191.74096 | -1.16 |
| 191.755637 | -1.141 |
| 191.775649 | -1.074 |
| 191.797248 | -1.238 |
| 191.822353 | -0.987 |
| 191.835836 | -1.055 |
| 191.855234 | -1.064 |
| 191.875131 | -1.054 |
| 191.90336 | -1.141 |
| 191.915555 | -1.084 |
| 191.935194 | -1.219 |
| 191.955412 | -1.103 |
| 192.004663 | -1.054 |
| 192.014677 | -1.006 |
| 192.035164 | -0.9 |
| 192.058897 | -0.784 |
| 192.075741 | -0.726 |
| 192.097306 | -0.842 |
| 192.115103 | -0.929 |
| 192.139572 | -1.045 |
| 192.155455 | -0.919 |
| 192.175696 | -0.862 |
| 192.198678 | -0.784 |
| 192.222544 | -0.871 |
| 192.235735 | -1.093 |
| 192.255521 | -0.948 |
| 192.275601 | -0.91 |
| 192.303169 | -0.804 |
| 192.314849 | -0.697 |
| 192.335312 | -0.746 |
| 192.3554 | -0.765 |
| 192.382869 | -0.688 |
| 192.394958 | -0.756 |
| 192.41506 | -0.678 |
| 192.435015 | -0.572 |
| 192.463139 | -0.572 |
| 192.475608 | -0.601 |
| 192.496593 | -0.495 |
| 192.51475 | -0.436 |
| 192.540797 | -0.524 |
| 192.555608 | -0.456 |
| 192.575612 | -0.417 |
| 192.596653 | -0.639 |
| 192.622562 | -0.726 |
| 192.635516 | -0.668 |
| 192.655403 | -0.572 |
| 192.675605 | -0.688 |
| 192.705221 | -0.552 |
| 192.714723 | -0.591 |
| 192.735148 | -0.533 |
| 192.755427 | -0.505 |
| 192.784158 | -0.388 |
| 192.795003 | -0.321 |
| 192.814896 | -0.437 |
| 192.835396 | -0.33 |
| 192.8641 | -0.108 |
| 192.875623 | -0.099 |
| 192.896677 | -0.166 |
| 192.914754 | -0.137 |
| 192.942068 | -0.118 |
| 192.95539 | -0.108 |
| 192.975617 | -0.195 |
| 192.998697 | -0.234 |
| 193.024746 | -0.35 |
| 193.03564 | -0.369 |
| 193.055412 | -0.331 |
| 193.075336 | -0.234 |
| 193.125679 | -0.137 |
| 193.135616 | -0.099 |
| 193.155404 | -0.138 |
| 193.182172 | -0.118 |
| 193.194765 | 0.036 |
| 193.215231 | 0.239 |
| 193.235407 | 0.239 |
| 193.262533 | 0.191 |
| 193.275613 | 0.191 |
| 193.296748 | 0.171 |
| 193.314878 | 0.132 |
| 193.339907 | 0.191 |
| 193.354804 | 0.162 |
| 193.37573 | 0.113 |
| 193.39725 | 0.104 |
| 193.422438 | 0.084 |
| 193.435815 | 0.065 |
| 193.455413 | 0.152 |
| 193.4756 | 0.2 |
| 193.504474 | 0.267 |
| 193.514716 | 0.296 |
| 193.535535 | 0.248 |
| 193.555751 | 0.306 |
| 193.5813 | 0.46 |
| 193.595405 | 0.538 |
| 193.614752 | 0.644 |
| 193.635347 | 0.673 |
| 193.660305 | 0.654 |
| 193.675615 | 0.664 |
| 193.696535 | 0.615 |
| 193.714904 | 0.625 |
| 193.741874 | 0.586 |
| 193.755562 | 0.634 |
| 193.775605 | 0.683 |
| 193.796387 | 0.702 |
| 193.823057 | 0.567 |
| 193.835608 | 0.442 |
| 193.855064 | 0.374 |
| 193.875652 | 0.384 |
| 193.904539 | 0.451 |
| 193.91494 | 0.519 |
| 193.93527 | 0.576 |
| 193.955577 | 0.712 |
| 193.984769 | 0.644 |
| 193.996112 | 0.674 |
| 194.014862 | 0.741 |
| 194.035393 | 0.828 |
| 194.064354 | 0.886 |
| 194.075615 | 0.838 |
| 194.0972 | 0.809 |
| 194.115028 | 0.819 |
| 194.143229 | 0.625 |
| 194.155634 | 0.693 |
| 194.175642 | 0.818 |
| 194.198818 | 0.828 |
| 194.24565 | 1.002 |
| 194.255445 | 1.031 |
| 194.27572 | 1.127 |
| 194.303712 | 1.118 |
| 194.31515 | 1.108 |
| 194.335198 | 1.08 |
| 194.355405 | 1.05 |
| 194.382326 | 0.973 |
| 194.394921 | 0.905 |
| 194.41459 | 0.77 |
| 194.435394 | 0.857 |
| 194.463848 | 0.876 |
| 194.475637 | 1.002 |
| 194.494896 | 1.215 |
| 194.515091 | 1.292 |
| 194.541213 | 1.215 |
| 194.555814 | 1.225 |
| 194.575706 | 1.196 |
| 194.596088 | 1.157 |
| 194.621263 | 0.954 |
| 194.636027 | 0.896 |
| 194.655395 | 0.877 |
| 194.6761 | 0.983 |
| 194.702772 | 0.896 |
| 194.716341 | 0.925 |
| 194.735239 | 1.022 |
| 194.754589 | 1.235 |
| 194.782199 | 1.254 |
| 194.79482 | 1.35 |
| 194.814778 | 1.688 |
| 194.835397 | 1.65 |
| 194.865388 | 1.688 |
| 194.875592 | 1.698 |
| 194.89663 | 1.167 |
| 194.914862 | 1.109 |
| 194.941806 | 0.954 |
| 194.955387 | 0.886 |
| 194.975603 | 0.771 |
| 194.996474 | 0.8 |
| 195.023814 | 0.742 |
| 195.03604 | 0.79 |
| 195.055394 | 1.021 |
| 195.075646 | 1.157 |
| 195.106066 | 1.273 |
| 195.115127 | 1.312 |
| 195.135163 | 1.399 |
| 195.155474 | 1.506 |
| 195.185384 | 1.399 |
| 195.194652 | 1.332 |
| 195.214782 | 1.119 |
| 195.235456 | 0.897 |
| 195.264775 | 0.916 |
| 195.275599 | 0.954 |
| 195.296999 | 0.906 |
| 195.314871 | 0.983 |
| 195.363085 | 1.129 |
| 195.375979 | 1.148 |
| 195.396609 | 1.255 |
| 195.42161 | 1.109 |
| 195.435123 | 1.003 |
| 195.455499 | 0.945 |
| 195.475642 | 1.022 |
| 195.50458 | 0.964 |
| 195.514939 | 0.955 |
| 195.535449 | 1.177 |
| 195.555409 | 1.38 |
| 195.582103 | 1.312 |
| 195.594944 | 1.023 |
| 195.614876 | 1.061 |
| 195.63542 | 1.139 |
| 195.662517 | 0.888 |
| 195.675406 | 0.878 |
| 195.697348 | 0.888 |
| 195.714803 | 0.848 |
| 195.740238 | 0.848 |
| 195.755894 | 0.839 |
| 195.775583 | 0.887 |
| 195.81493 | 0.955 |
| 195.842513 | 1.032 |
| 195.855591 | 1.042 |
| 195.87488 | 1.061 |
| 195.896889 | 1.052 |
| 195.923329 | 0.926 |
| 195.935614 | 0.916 |
| 195.955481 | 0.829 |
| 195.975594 | 0.781 |
| 196.008864 | 0.791 |
| 196.035107 | 0.752 |
| 196.055679 | 0.8 |
| 196.083679 | 1.042 |
| 196.095339 | 1.013 |
| 196.115018 | 0.917 |
| 196.135299 | 0.926 |
| 196.166138 | 0.849 |
| 196.175316 | 0.752 |
| 196.197002 | 0.569 |
| 196.214932 | 0.588 |
| 196.244943 | 0.482 |
| 196.254811 | 0.424 |
| 196.275795 | 0.453 |
| 196.29522 | 0.482 |
| 196.324306 | 0.395 |
| 196.335607 | 0.327 |
| 196.355414 | 0.299 |
| 196.37472 | 0.289 |
| 196.425492 | 0.55 |
| 196.435669 | 0.637 |
| 196.454953 | 0.743 |
| 196.480194 | 0.54 |
| 196.494806 | 0.54 |
| 196.515097 | 0.482 |
| 196.535299 | 0.473 |
| 196.562669 | 0.309 |
| 196.575619 | 0.26 |
| 196.597158 | 0.279 |
| 196.614898 | 0.289 |
| 196.641118 | 0.279 |
| 196.655982 | 0.241 |
| 196.676103 | 0.202 |
| 196.696769 | 0.154 |
| 196.721843 | 0.135 |
| 196.735285 | 0.183 |
| 196.755479 | 0.164 |
| 196.77565 | 0.174 |
| 196.806675 | 0.203 |
| 196.83508 | 0.193 |
| 196.855805 | 0.116 |
| 196.883087 | 0.193 |
| 196.894829 | 0.144 |
| 196.914761 | 0.144 |
| 196.935344 | 0.057 |
| 196.962906 | 0.019 |
| 196.975586 | 0.009 |
| 196.996634 | -0.039 |
| 197.01468 | -0.039 |
| 197.040548 | -0.001 |
| 197.05579 | 0.038 |
| 197.075597 | 0.009 |
| 197.097421 | 0.028 |
| 197.125166 | 0.019 |
| 197.13561 | 0.047 |
| 197.155441 | 0.009 |
| 197.175677 | 0.038 |
| 197.206941 | -0.184 |
| 197.235228 | -0.184 |
| 197.255352 | -0.251 |
| 197.285011 | -0.271 |
| 197.295931 | -0.145 |
| 197.31493 | -0.117 |
| 197.335414 | -0.068 |
| 197.36516 | -0.232 |
| 197.375593 | -0.232 |
| 197.396807 | -0.291 |
| 197.414626 | -0.28 |
| 197.445653 | -0.155 |
| 197.455685 | -0.193 |
| 197.475599 | -0.165 |
| 197.498579 | -0.107 |
| 197.544963 | -0.049 |
| 197.555445 | -0.078 |
| 197.575824 | -0.145 |
| 197.603477 | -0.281 |
| 197.614792 | -0.262 |
| 197.63522 | -0.204 |
| 197.655395 | -0.252 |
| 197.682435 | -0.349 |
| 197.695767 | -0.358 |
| 197.714642 | -0.397 |
| 197.735392 | -0.387 |
| 197.762981 | -0.31 |
| 197.775287 | -0.33 |
| 197.795569 | -0.301 |
| 197.814766 | -0.349 |
| 197.84046 | -0.339 |
| 197.855409 | -0.281 |
| 197.875596 | -0.32 |
| 197.896816 | -0.378 |
| 197.922723 | -0.513 |
| 197.9356 | -0.513 |
| 197.955408 | -0.503 |
| 197.975975 | -0.369 |
| 198.002735 | -0.437 |
| 198.014883 | -0.378 |
| 198.035242 | -0.34 |
| 198.054578 | -0.34 |
| 198.081155 | -0.417 |
| 198.094918 | -0.398 |
| 198.114822 | -0.359 |
| 198.135388 | -0.378 |
| 198.165542 | -0.523 |
| 198.175596 | -0.417 |
| 198.197281 | -0.253 |
| 198.214993 | -0.32 |
| 198.241768 | -0.31 |
| 198.255493 | -0.33 |
| 198.275464 | -0.407 |
| 198.296959 | -0.311 |
| 198.323002 | -0.514 |
| 198.335528 | -0.465 |
| 198.355388 | -0.417 |
| 198.375592 | -0.533 |
| 198.415887 | -0.524 |
| 198.435206 | -0.456 |
| 198.455387 | -0.466 |
| 198.48559 | -0.35 |
| 198.514801 | -0.301 |
| 198.535232 | -0.253 |
| 198.565122 | -0.273 |
| 198.575587 | -0.302 |
| 198.597433 | -0.292 |
| 198.61479 | -0.312 |
| 198.663375 | -0.012 |
| 198.675797 | -0.021 |
| 198.698051 | -0.186 |
| 198.723237 | -0.205 |
| 198.735482 | -0.224 |
| 198.755403 | -0.418 |
| 198.775592 | -0.35 |
| 198.804995 | -0.388 |
| 198.814758 | -0.543 |
| 198.835168 | -0.447 |
| 198.855372 | -0.205 |
| 198.883232 | -0.099 |
| 198.89547 | -0.07 |
| 198.914743 | 0.007 |
| 198.93482 | -0.051 |
| 198.965284 | -0.089 |
| 198.975584 | -0.119 |
| 198.996458 | -0.051 |
| 199.014755 | 0.036 |
| 199.042757 | -0.002 |
| 199.055628 | 0.007 |
| 199.075549 | 0.104 |
| 199.096927 | 0.075 |
| 199.124413 | -0.07 |
| 199.13558 | -0.186 |
| 199.155414 | -0.099 |
| 199.174667 | -0.031 |
| 199.20587 | -0.07 |
| 199.214868 | -0.099 |
| 199.235215 | 0.056 |
| 199.25551 | -0.022 |
| 199.288061 | -0.012 |
| 199.2947 | -0.244 |
| 199.314748 | 0.026 |
| 199.335429 | 0.133 |
| 199.366518 | 0.287 |
| 199.375651 | 0.335 |
| 199.39678 | 0.258 |
| 199.414977 | 0.239 |
| 199.444178 | 0.297 |
| 199.455589 | 0.287 |
| 199.475658 | 0.297 |
| 199.494915 | 0.239 |
| 199.524247 | 0.326 |
| 199.53558 | 0.287 |
| 199.555477 | 0.258 |
| 199.575589 | 0.297 |
| 199.607685 | 0.306 |
| 199.63524 | 0.326 |
| 199.655185 | 0.297 |
| 199.703219 | 0.335 |
| 199.715022 | 0.413 |
| 199.735033 | 0.413 |
| 199.760476 | 0.442 |
| 199.775671 | 0.422 |
| 199.797624 | 0.451 |
| 199.814849 | 0.587 |
| 199.839706 | 0.577 |
| 199.855529 | 0.548 |
| 199.875636 | 0.519 |
| 199.897082 | 0.587 |
| 199.921581 | 0.615 |
| 199.93593 | 0.577 |
| 199.955407 | 0.51 |
| 199.975803 | 0.471 |
| 200.002949 | 0.48 |
| 200.015348 | 0.519 |
| 200.035181 | 0.625 |
| 200.055435 | 0.771 |
| 200.083434 | 0.79 |
| 200.095056 | 0.78 |
| 200.114744 | 0.751 |
| 200.135481 | 0.79 |
| 200.162589 | 0.751 |
| 200.175704 | 0.857 |
| 200.196395 | 0.915 |
| 200.214754 | 0.925 |
| 200.240711 | 0.867 |
| 200.255517 | 0.896 |
| 200.27559 | 1.002 |
| 200.296352 | 1.089 |
| 200.323737 | 1.108 |
| 200.335557 | 1.031 |
| 200.355381 | 0.925 |
| 200.375621 | 0.963 |
| 200.405039 | 1.08 |
| 200.414657 | 1.08 |
| 200.435269 | 1.012 |
| 200.455456 | 0.819 |
| 200.483849 | 0.954 |
| 200.494844 | 1.109 |
| 200.514773 | 0.983 |
| 200.535396 | 0.906 |
| 200.565312 | 0.935 |
| 200.575693 | 0.964 |
| 200.596494 | 0.925 |
| 200.614781 | 0.945 |
| 200.642653 | 1.051 |
| 200.655565 | 1.07 |
| 200.675591 | 1.012 |
| 200.696946 | 1.012 |
| 200.724824 | 1.157 |
| 200.735553 | 1.273 |
| 200.755542 | 1.273 |
| 200.775584 | 1.321 |
| 200.826012 | 1.07 |
| 200.835687 | 1.06 |
| 200.855398 | 1.08 |
| 200.883217 | 1.264 |
| 200.894905 | 1.273 |
| 200.914831 | 1.128 |
| 200.935409 | 0.945 |
| 200.963452 | 1.003 |
| 200.975579 | 1.061 |
| 200.996725 | 1.1 |
| 201.01499 | 1.128 |
| 201.041361 | 1.023 |
| 201.055399 | 1.022 |
| 201.075592 | 1.09 |
| 201.096964 | 1.119 |
| 201.122311 | 1.109 |
| 201.135971 | 1.147 |
| 201.155428 | 1.119 |
| 201.175744 | 1.157 |
| 201.202733 | 1.206 |
| 201.214873 | 1.264 |
| 201.235509 | 1.215 |
| 201.255396 | 1.177 |
| 201.283903 | 1.186 |
| 201.295292 | 1.264 |
| 201.314774 | 1.331 |
| 201.335172 | 1.264 |
| 201.364449 | 1.148 |
| 201.375616 | 1.187 |
| 201.396623 | 1.225 |
| 201.414747 | 1.206 |
| 201.442139 | 1.177 |
| 201.45562 | 1.254 |
| 201.475203 | 1.274 |
| 201.49756 | 1.235 |
| 201.523796 | 1.119 |
| 201.535516 | 1.196 |
| 201.555421 | 1.216 |
| 201.575787 | 1.274 |
| 201.604853 | 1.254 |
| 201.615708 | 1.254 |
| 201.635182 | 1.139 |
| 201.655421 | 1.071 |
| 201.683578 | 1.167 |
| 201.695013 | 1.274 |
| 201.714918 | 1.264 |
| 201.73548 | 1.245 |
| 201.766184 | 1.197 |
| 201.775581 | 1.1 |
| 201.797119 | 1.168 |
| 201.814666 | 1.139 |
| 201.845798 | 1.149 |
| 201.855613 | 1.071 |
| 201.875956 | 1.061 |
| 201.897649 | 1.158 |
| 201.946097 | 1.226 |
| 201.95527 | 1.197 |
| 201.97576 | 1.081 |
| 202.006109 | 1.052 |
| 202.015237 | 1.091 |
| 202.0352 | 1.11 |
| 202.05539 | 1.062 |
| 202.08369 | 1.081 |
| 202.094967 | 1.091 |
| 202.114905 | 1.129 |
| 202.135484 | 1.042 |
| 202.163997 | 1.033 |
| 202.17583 | 1.188 |
| 202.197011 | 1.12 |
| 202.214942 | 1.091 |
| 202.241737 | 1.12 |
| 202.256049 | 0.994 |
| 202.275241 | 0.927 |
| 202.297803 | 1.004 |
| 202.324227 | 1.014 |
| 202.335786 | 1.082 |
| 202.355398 | 1.072 |
| 202.375583 | 1.052 |
| 202.405545 | 0.995 |
| 202.414698 | 0.946 |
| 202.435136 | 0.917 |
| 202.455233 | 0.898 |
| 202.485241 | 0.994 |
| 202.515062 | 1.062 |
| 202.535387 | 1.004 |
| 202.56608 | 0.888 |
| 202.575414 | 0.927 |
| 202.596851 | 0.966 |
| 202.614777 | 0.898 |
| 202.642565 | 0.811 |
| 202.655597 | 0.734 |
| 202.675584 | 0.84 |
| 202.697639 | 0.724 |
| 202.724879 | 0.57 |
| 202.735444 | 0.57 |
| 202.755442 | 0.734 |
| 202.775199 | 0.811 |
| 202.805652 | 0.753 |
| 202.83552 | 0.84 |
| 202.855432 | 0.85 |
| 202.884367 | 0.908 |
| 202.894809 | 0.85 |
| 202.914613 | 0.85 |
| 202.935434 | 0.811 |
| 202.967027 | 0.589 |
| 202.975558 | 0.618 |
| 202.997124 | 0.647 |
| 203.014741 | 0.667 |
| 203.064766 | 0.502 |
| 203.075425 | 0.454 |
| 203.097283 | 0.483 |
| 203.122143 | 0.473 |
| 203.135813 | 0.473 |
| 203.155385 | 0.521 |
| 203.175577 | 0.531 |
| 203.204058 | 0.541 |
| 203.214894 | 0.57 |
| 203.235093 | 0.541 |
| 203.255402 | 0.502 |
| 203.282342 | 0.57 |
| 203.295495 | 0.502 |
| 203.314751 | 0.531 |
| 203.335399 | 0.541 |
| 203.363537 | 0.464 |
| 203.375576 | 0.492 |
| 203.396385 | 0.29 |
| 203.414741 | 0.289 |
| 203.441917 | 0.328 |
| 203.455471 | 0.386 |
| 203.475256 | 0.347 |
| 203.496479 | 0.26 |
| 203.523699 | 0.076 |
| 203.535732 | 0.115 |
| 203.555453 | 0.222 |
| 203.575284 | 0.192 |
| 203.605359 | 0.271 |
| 203.635219 | 0.26 |
| 203.655375 | 0.134 |
| 203.686321 | 0.28 |
| 203.714764 | 0.154 |
| 203.73543 | 0.027 |
| 203.765348 | 0.135 |
| 203.775691 | -0.088 |
| 203.79644 | -0.146 |
| 203.815016 | -0.117 |
| 203.843455 | 0 |
| 203.855492 | -0.04 |
| 203.875645 | -0.117 |
| 203.89563 | -0.029 |
| 203.92311 | 0.029 |
| 203.93551 | -0.049 |
| 203.955414 | -0.166 |
| 203.975575 | -0.001 |
| 204.006782 | -0.125 |
| 204.015063 | -0.174 |
| 204.035281 | -0.252 |
| 204.055374 | -0.126 |
| 204.105724 | -0.194 |
| 204.114852 | -0.281 |
| 204.135153 | -0.301 |
| 204.163427 | -0.271 |
| 204.175576 | -0.241 |
| 204.197303 | -0.31 |
| 204.215068 | -0.388 |
| 204.241551 | -0.319 |
| 204.255558 | -0.309 |
| 204.275583 | -0.426 |
| 204.295593 | -0.484 |
| 204.322094 | -0.464 |
| 204.336519 | -0.28 |
| 204.355379 | -0.319 |
| 204.375583 | -0.474 |
| 204.405114 | -0.493 |
| 204.415069 | -0.464 |
| 204.435181 | -0.416 |
| 204.455386 | -0.503 |
| 204.485771 | -0.551 |
| 204.494833 | -0.532 |
| 204.514897 | -0.493 |
| 204.535465 | -0.474 |
| 204.566003 | -0.523 |
| 204.596743 | -0.541 |
| 204.614637 | -0.523 |
| 204.643037 | -0.513 |
| 204.655752 | -0.484 |
| 204.675579 | -0.629 |
| 204.699211 | -0.561 |
| 204.728143 | -0.474 |
| 204.735904 | -0.484 |
| 204.755541 | -0.571 |
| 204.775575 | -0.552 |
| 204.806737 | -0.301 |
| 204.814643 | -0.262 |
| 204.835151 | -0.272 |
| 204.855465 | -0.339 |
| 204.884892 | -0.542 |
| 204.894911 | -0.6 |
| 204.914848 | -0.648 |
| 204.935481 | -0.629 |
| 204.967009 | -0.6 |
| 204.975493 | -0.552 |
| 204.996546 | -0.503 |
| 205.014798 | -0.513 |
| 205.045211 | -0.494 |
| 205.055481 | -0.504 |
| 205.075583 | -0.484 |
| 205.094994 | -0.581 |
| 205.125393 | -0.513 |
| 205.135612 | -0.494 |
| 205.15548 | -0.523 |
| 205.175577 | -0.571 |
| 205.228828 | -0.629 |
| 205.236011 | -0.62 |
| 205.25568 | -0.581 |
| 205.282936 | -0.59 |
| 205.294947 | -0.591 |
| 205.314927 | -0.658 |
| 205.335365 | -0.62 |
| 205.366441 | -0.533 |
| 205.375614 | -0.571 |
| 205.397055 | -0.572 |
| 205.414953 | -0.571 |
| 205.443487 | -0.465 |
| 205.455987 | -0.485 |
| 205.475605 | -0.446 |
| 205.49553 | -0.456 |
| 205.524205 | -0.494 |
| 205.535918 | -0.543 |
| 205.555243 | -0.543 |
| 205.575576 | -0.562 |
| 205.607168 | -0.494 |
| 205.635527 | -0.533 |
| 205.655383 | -0.572 |
| 205.687053 | -0.504 |
| 205.694772 | -0.523 |
| 205.714752 | -0.475 |
| 205.735219 | -0.504 |
| 205.766488 | -0.504 |
| 205.775778 | -0.484 |
| 205.796261 | -0.668 |
| 205.81503 | -0.552 |
| 205.845137 | -0.494 |
| 205.855487 | -0.562 |
| 205.875367 | -0.601 |
| 205.894851 | -0.63 |
| 205.92476 | -0.591 |
| 205.935541 | -0.61 |
| 205.955384 | -0.475 |
| 205.975565 | -0.446 |
| 206.008581 | -0.359 |
| 206.015036 | -0.446 |
| 206.035234 | -0.359 |
| 206.055552 | -0.359 |
| 206.089171 | -0.398 |
| 206.094728 | -0.359 |
| 206.114742 | -0.465 |
| 206.134795 | -0.408 |
| 206.168291 | -0.35 |
| 206.197241 | -0.379 |
| 206.214662 | -0.427 |
| 206.248492 | -0.418 |
| 206.275754 | -0.533 |
| 206.295254 | -0.533 |
| 206.34213 | -0.408 |
| 206.355938 | -0.379 |
| 206.37558 | -0.389 |
| 206.403686 | -0.224 |
| 206.415238 | -0.099 |
| 206.43508 | -0.079 |
| 206.455371 | -0.196 |
| 206.482162 | -0.331 |
| 206.494917 | -0.34 |
| 206.515121 | -0.263 |
| 206.5353 | -0.36 |
| 206.563661 | -0.476 |
| 206.575647 | -0.466 |
| 206.597021 | -0.465 |
| 206.614955 | -0.514 |
| 206.641876 | -0.534 |
| 206.655657 | -0.476 |
| 206.675575 | -0.292 |
| 206.698807 | -0.215 |
| 206.724449 | -0.196 |
| 206.735774 | -0.196 |
| 206.755144 | -0.021 |
| 206.799406 | -0.031 |
| 206.825048 | -0.157 |
| 206.835511 | -0.215 |
| 206.855376 | -0.109 |
| 206.875897 | 0.007 |
| 206.906022 | -0.041 |
| 206.915364 | -0.147 |
| 206.935115 | -0.302 |
| 206.955363 | -0.379 |
| 206.986351 | -0.379 |
| 206.994783 | -0.273 |
| 207.014946 | -0.293 |
| 207.035453 | -0.234 |
| 207.065549 | -0.128 |
| 207.075572 | -0.108 |
| 207.097607 | -0.099 |
| 207.11477 | -0.099 |
| 207.14558 | -0.051 |
| 207.155465 | -0.051 |
| 207.175597 | 0.026 |
| 207.195069 | 0.065 |
| 207.223559 | 0.143 |
| 207.235479 | 0.094 |
| 207.255688 | -0.147 |
| 207.275569 | -0.138 |
| 207.307542 | -0.176 |
| 207.314784 | -0.167 |
| 207.335525 | -0.089 |
| 207.355404 | -0.099 |
| 207.40475 | -0.022 |
| 207.414722 | 0.007 |
| 207.435217 | 0.055 |
| 207.464738 | 0.171 |
| 207.475561 | 0.055 |
| 207.496724 | 0.104 |
| 207.514891 | 0.152 |
| 207.540796 | 0.152 |
| 207.555479 | 0.104 |
| 207.575257 | 0.026 |
| 207.595779 | 0.056 |
| 207.621171 | 0.2 |
| 207.63543 | 0.239 |
| 207.655353 | 0.258 |
| 207.675573 | 0.258 |
| 207.705198 | 0.142 |
| 207.714801 | 0.065 |
| 207.735076 | 0.046 |
| 207.755379 | 0.201 |
| 207.782768 | 0.239 |
| 207.794811 | 0.21 |
| 207.815066 | 0.258 |
| 207.835327 | 0.23 |
| 207.864555 | 0.258 |
| 207.875628 | 0.229 |
| 207.89654 | 0.21 |
| 207.914699 | 0.258 |
| 207.942839 | 0.345 |
| 207.95554 | 0.307 |
| 207.975572 | 0.297 |
| 207.998922 | 0.258 |
| 208.026968 | 0.355 |
| 208.035432 | 0.326 |
| 208.055399 | 0.345 |
| 208.075156 | 0.345 |
| 208.104999 | 0.364 |
| 208.115133 | 0.422 |
| 208.135454 | 0.374 |
| 208.155441 | 0.403 |
| 208.186164 | 0.365 |
| 208.196053 | 0.384 |
| 208.214798 | 0.384 |
| 208.235475 | 0.336 |
| 208.266663 | 0.403 |
| 208.275532 | 0.374 |
| 208.297529 | 0.355 |
| 208.314886 | 0.316 |
| 208.34342 | 0.413 |
| 208.355587 | 0.394 |
| 208.375608 | 0.326 |
| 208.39625 | 0.278 |
| 208.424987 | 0.452 |
| 208.435888 | 0.5 |
| 208.455409 | 0.316 |
| 208.475581 | 0.307 |
| 208.525912 | 0.442 |
| 208.53573 | 0.461 |
| 208.55535 | 0.423 |
| 208.582096 | 0.461 |
| 208.595356 | 0.481 |
| 208.614924 | 0.5 |
| 208.635347 | 0.5 |
| 208.663654 | 0.529 |
| 208.675557 | 0.587 |
| 208.696596 | 0.471 |
| 208.71488 | 0.394 |
| 208.741009 | 0.433 |
| 208.755466 | 0.413 |
| 208.775597 | 0.394 |
| 208.797057 | 0.365 |
| 208.823004 | 0.307 |
| 208.835559 | 0.278 |
| 208.855362 | 0.336 |
| 208.875659 | 0.481 |
| 208.904381 | 0.529 |
| 208.915284 | 0.548 |
| 208.935565 | 0.529 |
| 208.955328 | 0.51 |
| 208.982811 | 0.587 |
| 208.994806 | 0.51 |
| 209.014776 | 0.616 |
| 209.035536 | 0.616 |
| 209.0645 | 0.607 |
| 209.075569 | 0.558 |
| 209.096873 | 0.52 |
| 209.11496 | 0.443 |
| 209.144003 | 0.597 |
| 209.155491 | 0.558 |
| 209.175677 | 0.51 |
| 209.195112 | 0.51 |
| 209.221552 | 0.52 |
| 209.235484 | 0.549 |
| 209.255374 | 0.471 |
| 209.275635 | 0.529 |
| 209.304565 | 0.587 |
| 209.315304 | 0.577 |
| 209.335664 | 0.5 |
| 209.355129 | 0.568 |
| 209.38541 | 0.49 |
| 209.3949 | 0.519 |
| 209.414866 | 0.491 |
| 209.434914 | 0.636 |
| 209.465843 | 0.809 |
| 209.475561 | 0.838 |
| 209.497004 | 0.693 |
| 209.514978 | 0.587 |
| 209.544072 | 0.539 |
| 209.555734 | 0.529 |
| 209.575573 | 0.577 |
| 209.595232 | 0.597 |
| 209.641681 | 0.694 |
| 209.655413 | 0.626 |
| 209.675577 | 0.394 |
| 209.704024 | 0.53 |
| 209.735153 | 0.472 |
| 209.755384 | 0.491 |
| 209.784605 | 0.481 |
| 209.795717 | 0.462 |
| 209.814951 | 0.443 |
| 209.835418 | 0.423 |
| 209.864253 | 0.413 |
| 209.875374 | 0.433 |
| 209.897164 | 0.549 |
| 209.914874 | 0.645 |
| 209.942261 | 0.809 |
| 209.955515 | 0.626 |
| 209.97557 | 0.597 |
| 209.999302 | 0.519 |
| 210.025865 | 0.481 |
| 210.055565 | 0.539 |
| 210.075115 | 0.5 |
| 210.105356 | 0.684 |
| 210.116392 | 0.665 |
| 210.135698 | 0.635 |
| 210.155616 | 0.606 |
| 210.183591 | 0.741 |
| 210.195364 | 0.79 |
| 210.214959 | 0.694 |
| 210.235368 | 0.568 |
| 210.265047 | 0.597 |
| 210.275566 | 0.519 |
| 210.296969 | 0.375 |
| 210.314749 | 0.327 |
| 210.343519 | 0.143 |
| 210.35556 | 0.124 |
| 210.375675 | 0.163 |
| 210.395625 | 0.202 |
| 210.424892 | 0.326 |
| 210.435474 | 0.297 |
| 210.45546 | 0.549 |
| 210.47556 | 0.539 |
| 210.508123 | 0.384 |
| 210.535436 | 0.326 |
| 210.555774 | 0.413 |
| 210.586918 | 0.616 |
| 210.614776 | 0.597 |
| 210.635345 | 0.51 |
| 210.667753 | 0.442 |
| 210.675449 | 0.472 |
| 210.696484 | 0.249 |
| 210.714741 | 0.153 |
| 210.767058 | 0.385 |
| 210.77547 | 0.404 |
| 210.797136 | 0.423 |
| 210.825993 | 0.269 |
| 210.835568 | 0.22 |
| 210.854838 | 0.326 |
| 210.874922 | 0.239 |
| 210.905735 | 0.104 |
| 210.916162 | 0.163 |
| 210.9352 | 0.095 |
| 210.955382 | 0.182 |
| 210.98607 | 0.047 |
| 211.015103 | 0.327 |
| 211.035407 | 0.347 |
| 211.066545 | 0.432 |
| 211.07618 | 0.181 |
| 211.096467 | -0.485 |
| 211.114596 | -1.189 |
| 211.146286 | -0.31 |
| 211.155538 | 0.037 |
| 211.175758 | -0.291 |
| 211.194917 | -0.146 |
| 211.226522 | 0.558 |
| 211.25538 | 0.356 |
| 211.27564 | 0.337 |
| 211.311562 | 0.655 |
| 211.335502 | 0.587 |
| 211.355357 | 0.5 |
| 211.387234 | 0.317 |
| 211.414632 | 0.481 |
| 211.435468 | 0.471 |
| 211.469359 | 0.298 |
| 211.497614 | 0.491 |
| 211.514787 | 0.5 |
| 211.545928 | 0.375 |
| 211.555336 | 0.278 |
| 211.575623 | 0.249 |
| 211.595042 | 0.23 |
| 211.62532 | 0.211 |
| 211.634849 | 0.192 |
| 211.655374 | 0.172 |
| 211.675563 | 0.153 |
| 211.710384 | 0.211 |
| 211.735122 | 0.221 |
| 211.755421 | 0.124 |
| 211.809266 | 0.337 |
| 211.834992 | 0.317 |
| 211.866066 | 0.298 |
| 211.876084 | 0.327 |
| 211.897303 | 0.404 |
| 211.914607 | 0.423 |
| 211.94604 | 0.452 |
| 211.955331 | 0.394 |
| 211.975564 | 0.346 |
| 211.998779 | 0.24 |
| 212.027523 | 0.066 |
| 212.035526 | 0.008 |
| 212.055532 | -0.011 |
| 212.075564 | 0.153 |
| 212.107914 | 0.114 |
| 212.114783 | 0.105 |
| 212.135034 | 0.269 |
| 212.155297 | 0.317 |
| 212.185539 | 0.22 |
| 212.194911 | 0.239 |
| 212.214752 | 0.105 |
| 212.235346 | 0.191 |
| 212.267754 | 0.24 |
| 212.275385 | 0.201 |
| 212.296544 | 0.211 |
| 212.314663 | 0.346 |
| 212.346556 | 0.249 |
| 212.355233 | 0.211 |
| 212.376359 | 0.192 |
| 212.394989 | 0.163 |
| 212.426222 | 0.066 |
| 212.435042 | 0.008 |
| 212.45537 | 0.066 |
| 212.475762 | 0.027 |
| 212.509894 | 0.066 |
| 212.51491 | 0.124 |
| 212.535109 | 0.182 |
| 212.555479 | 0.124 |
| 212.58976 | 0.191 |
| 212.594585 | 0.249 |
| 212.614772 | 0.152 |
| 212.635381 | 0.201 |
| 212.668498 | 0.24 |
| 212.675389 | 0.23 |
| 212.696913 | 0.153 |
| 212.714795 | 0.239 |
| 212.746492 | 0.153 |
| 212.755338 | 0.095 |
| 212.775565 | 0.085 |
| 212.794897 | 0.163 |
| 212.827944 | 0.076 |
| 212.835586 | 0.076 |
| 212.855355 | 0.008 |
| 212.875564 | -0.021 |
| 212.93106 | 0.114 |
| 212.934962 | 0.105 |
| 212.955343 | 0.047 |
| 212.985054 | 0.133 |
| 213.014912 | 0.182 |
| 213.035377 | 0.124 |
| 213.067348 | 0.076 |
| 213.075435 | 0.085 |
| 213.096487 | 0.143 |
| 213.114932 | 0.095 |
| 213.145871 | 0.105 |
| 213.155422 | 0.056 |
| 213.175571 | 0.105 |
| 213.194953 | 0.085 |
| 213.225163 | 0.066 |
| 213.236039 | 0.066 |
| 213.255332 | 0.066 |
| 213.275632 | 0.133 |
| 213.308721 | 0.172 |
| 213.315653 | 0.172 |
| 213.334914 | 0.134 |
| 213.355248 | 0.066 |
| 213.389311 | 0.075 |
| 213.414841 | 0.056 |
| 213.435421 | 0.018 |
| 213.469331 | -0.04 |
| 213.475146 | -0.002 |
| 213.496634 | -0.089 |
| 213.514786 | -0.098 |
| 213.547411 | 0.133 |
| 213.57566 | 0.211 |
| 213.595951 | 0.124 |
| 213.627364 | 0.124 |
| 213.655509 | 0.037 |
| 213.675562 | -0.011 |
| 213.709818 | 0.027 |
| 213.735193 | 0.027 |
| 213.755484 | 0.056 |
| 213.787168 | 0.056 |
| 213.814772 | -0.012 |
| 213.835469 | 0.142 |
| 213.870686 | 0.249 |
| 213.897288 | 0.259 |
| 213.914768 | 0.297 |
| 213.948666 | 0.24 |
| 213.955261 | 0.182 |
| 213.975021 | 0.056 |
| 213.994961 | 0.124 |
| 214.046215 | 0.056 |
| 214.05483 | 0.143 |
| 214.075701 | 0.104 |
| 214.108543 | 0.056 |
| 214.116302 | 0.046 |
| 214.135152 | 0.123 |
| 214.155347 | 0.123 |
| 214.185949 | 0.075 |
| 214.195117 | 0.085 |
| 214.214754 | 0.162 |
| 214.235352 | 0.095 |
| 214.267272 | 0.278 |
| 214.275434 | 0.23 |
| 214.296498 | 0.162 |
| 214.314789 | 0.211 |
| 214.346935 | 0.181 |
| 214.355467 | 0.172 |
| 214.375397 | 0.172 |
| 214.395201 | 0.056 |
| 214.425274 | 0.143 |
| 214.435562 | 0.211 |
| 214.45546 | 0.182 |
| 214.474807 | 0.162 |
| 214.50807 | 0.085 |
| 214.514998 | 0.066 |
| 214.53519 | 0.085 |
| 214.555389 | 0.085 |
| 214.588872 | 0.104 |
| 214.594615 | 0.133 |
| 214.614654 | 0.104 |
| 214.635436 | 0.143 |
| 214.669557 | 0.143 |
| 214.67517 | 0.143 |
| 214.696524 | 0.104 |
| 214.715312 | 0.104 |
| 214.746931 | 0.114 |
| 214.755226 | 0.171 |
| 214.775563 | 0.2 |
| 214.794859 | 0.113 |
| 214.825879 | 0.201 |
| 214.835565 | 0.21 |
| 214.8554 | 0.143 |
| 214.87565 | 0.201 |
| 214.910525 | 0.239 |
| 214.935454 | 0.104 |
| 214.955485 | 0.104 |
| 214.989837 | 0.143 |
| 215.014825 | 0.066 |
| 215.035383 | 0.075 |
| 215.071416 | -0.031 |
| 215.09737 | 0.085 |
| 215.114887 | 0.066 |
| 215.166574 | 0.143 |
| 215.197295 | 0.114 |
| 215.224622 | 0.191 |
| 215.235693 | 0.249 |
| 215.255426 | 0.307 |
| 215.275632 | 0.211 |
| 215.306101 | 0.326 |
| 215.315119 | 0.297 |
| 215.335047 | 0.22 |
| 215.355209 | 0.23 |
| 215.38586 | 0.22 |
| 215.394793 | 0.143 |
| 215.415287 | 0.114 |
| 215.435365 | 0.162 |
| 215.466122 | 0.085 |
| 215.47556 | 0.123 |
| 215.497652 | 0.075 |
| 215.514957 | 0.133 |
| 215.545021 | 0.259 |
| 215.555523 | 0.297 |
| 215.575478 | 0.23 |
| 215.594774 | 0.211 |
| 215.625562 | 0.374 |
| 215.635605 | 0.345 |
| 215.655362 | 0.288 |
| 215.675699 | 0.22 |
| 215.709086 | 0.162 |
| 215.714964 | 0.152 |
| 215.735462 | 0.162 |
| 215.755365 | 0.152 |
| 215.787677 | 0.095 |
| 215.794797 | 0.114 |
| 215.814796 | 0.056 |
| 215.835897 | 0.056 |
| 215.867186 | 0.094 |
| 215.875435 | 0.114 |
| 215.896965 | 0.181 |
| 215.914744 | 0.22 |
| 215.946623 | 0.249 |
| 215.955277 | 0.259 |
| 215.97557 | 0.259 |
| 215.994783 | 0.307 |
| 216.026738 | 0.307 |
| 216.035566 | 0.278 |
| 216.055725 | 0.297 |
| 216.075556 | 0.22 |
| 216.109804 | 0.22 |
| 216.135134 | 0.21 |
| 216.155348 | 0.23 |
| 216.208618 | 0.085 |
| 216.23512 | 0.182 |
| 216.264138 | 0.278 |
| 216.275506 | 0.336 |
| 216.298211 | 0.21 |
| 216.314831 | 0.297 |
| 216.341702 | 0.5 |
| 216.35532 | 0.481 |
| 216.37544 | 0.423 |
| 216.398837 | 0.345 |
| 216.424702 | 0.268 |
| 216.435577 | 0.268 |
| 216.455279 | 0.278 |
| 216.475594 | 0.259 |
| 216.5089 | 0.172 |
| 216.535282 | 0.133 |
| 216.55537 | 0.239 |
| 216.585999 | 0.162 |
| 216.594823 | 0.23 |
| 216.614776 | 0.21 |
| 216.635381 | 0.201 |
| 216.664872 | 0.288 |
| 216.675563 | 0.336 |
| 216.696984 | 0.336 |
| 216.714606 | 0.375 |
| 216.743668 | 0.365 |
| 216.755452 | 0.346 |
| 216.775698 | 0.307 |
| 216.797302 | 0.287 |
| 216.825268 | 0.365 |
| 216.835669 | 0.288 |
| 216.855414 | 0.336 |
| 216.875691 | 0.307 |
| 216.907037 | 0.22 |
| 216.914772 | 0.191 |
| 216.935199 | 0.288 |
| 216.955374 | 0.259 |
| 216.98527 | 0.297 |
| 216.994721 | 0.201 |
| 217.014558 | 0.172 |
| 217.035368 | 0.307 |
| 217.066957 | 0.384 |
| 217.097233 | 0.442 |
| 217.115739 | 0.452 |
| 217.145979 | 0.394 |
| 217.175688 | 0.404 |
| 217.194868 | 0.317 |
| 217.22393 | 0.258 |
| 217.235474 | 0.287 |
| 217.255364 | 0.316 |
| 217.275611 | 0.481 |
| 217.32896 | 0.278 |
| 217.355368 | 0.374 |
| 217.38499 | 0.423 |
| 217.394972 | 0.394 |
| 217.414912 | 0.287 |
| 217.435356 | 0.307 |
| 217.464063 | 0.471 |
| 217.475662 | 0.471 |
| 217.495384 | 0.365 |
| 217.515202 | 0.336 |
| 217.544182 | 0.316 |
| 217.555492 | 0.258 |
| 217.576135 | 0.394 |
| 217.59709 | 0.403 |
| 217.623832 | 0.355 |
| 217.63621 | 0.335 |
| 217.655222 | 0.316 |
| 217.675505 | 0.365 |
| 217.705053 | 0.336 |
| 217.71541 | 0.481 |
| 217.735617 | 0.461 |
| 217.755287 | 0.441 |
| 217.782845 | 0.374 |
| 217.795597 | 0.336 |
| 217.814838 | 0.229 |
| 217.835195 | 0.258 |
| 217.865841 | 0.336 |
| 217.875562 | 0.335 |
| 217.896651 | 0.297 |
| 217.914962 | 0.336 |
| 217.943434 | 0.393 |
| 217.955611 | 0.451 |
| 217.975386 | 0.413 |
| 217.995704 | 0.384 |
| 218.026884 | 0.432 |
| 218.055542 | 0.452 |
| 218.075557 | 0.316 |
| 218.107517 | 0.288 |
| 218.116029 | 0.316 |
| 218.135168 | 0.345 |
| 218.175608 | 0.287 |
| 218.207906 | 0.259 |
| 218.234708 | 0.268 |
| 218.255395 | 0.268 |
| 218.286025 | 0.297 |
| 218.29596 | 0.336 |
| 218.315095 | 0.364 |
| 218.335104 | 0.297 |
| 218.365392 | 0.249 |
| 218.37558 | 0.211 |
| 218.396947 | 0.297 |
| 218.414581 | 0.277 |
| 218.467054 | 0.268 |
| 218.498086 | 0.423 |
| 218.5235 | 0.568 |
| 218.535557 | 0.529 |
| 218.575564 | 0.268 |
| 218.605478 | 0.298 |
| 218.614849 | 0.259 |
| 218.635003 | 0.258 |
| 218.655337 | 0.21 |
| 218.684692 | 0.21 |
| 218.695074 | 0.21 |
| 218.71485 | 0.22 |
| 218.735488 | 0.258 |
| 218.765146 | 0.307 |
| 218.775555 | 0.346 |
| 218.796785 | 0.346 |
| 218.814855 | 0.384 |
| 218.841118 | 0.287 |
| 218.855399 | 0.374 |
| 218.87564 | 0.346 |
| 218.896346 | 0.259 |
| 218.923127 | 0.23 |
| 218.935363 | 0.249 |
| 218.955356 | 0.191 |
| 218.974795 | 0.239 |
| 219.002436 | 0.191 |
| 219.014691 | 0.201 |
| 219.035302 | 0.152 |
| 219.055624 | 0.191 |
| 219.086662 | 0.162 |
| 219.117001 | 0.162 |
| 219.135366 | 0.336 |
| 219.167289 | 0.365 |
| 219.195866 | 0.23 |
| 219.214772 | 0.268 |
| 219.244179 | 0.22 |
| 219.255434 | 0.182 |
| 219.27555 | 0.201 |
| 219.295606 | 0.172 |
| 219.325149 | 0.192 |
| 219.336545 | 0.201 |
| 219.355459 | 0.269 |
| 219.37565 | 0.307 |
| 219.408865 | 0.211 |
| 219.435108 | 0.249 |
| 219.455383 | 0.259 |
| 219.508943 | 0.288 |
| 219.535303 | 0.326 |
| 219.564356 | 0.278 |
| 219.575567 | 0.278 |
| 219.596963 | 0.288 |
| 219.614746 | 0.239 |
| 219.641392 | 0.172 |
| 219.655339 | 0.239 |
| 219.675555 | 0.249 |
| 219.697578 | 0.317 |
| 219.723531 | 0.172 |
| 219.735532 | 0.211 |
| 219.755357 | 0.24 |
| 219.77556 | 0.317 |
| 219.804864 | 0.259 |
| 219.814795 | 0.278 |
| 219.835126 | 0.22 |
| 219.855324 | 0.191 |
| 219.881772 | 0.182 |
| 219.894974 | 0.201 |
| 219.914713 | 0.143 |
| 219.935307 | 0.133 |
| 219.963421 | 0.172 |
| 219.975552 | 0.22 |
| 219.996433 | 0.249 |
| 220.014642 | 0.259 |
| 220.046222 | 0.269 |
| 220.055471 | 0.259 |
| 220.075668 | 0.25 |
| 220.098714 | 0.25 |
| 220.126887 | 0.288 |
| 220.134846 | 0.259 |
| 220.155362 | 0.22 |
| 220.175553 | 0.133 |
| 220.207451 | 0.172 |
| 220.235332 | 0.201 |
| 220.255307 | 0.192 |
| 220.284831 | 0.249 |
| 220.314874 | 0.288 |
| 220.335219 | 0.22 |
| 220.367697 | 0.201 |
| 220.375379 | 0.23 |
| 220.396627 | 0.239 |
| 220.414698 | 0.192 |
| 220.442162 | 0.173 |
| 220.456138 | 0.172 |
| 220.476089 | 0.259 |
| 220.497921 | 0.259 |
| 220.528226 | 0.172 |
| 220.535296 | 0.172 |
| 220.555322 | 0.162 |
| 220.57517 | 0.153 |
| 220.628258 | 0.201 |
| 220.634633 | 0.191 |
| 220.655538 | 0.182 |
| 220.684561 | 0.22 |
| 220.694901 | 0.259 |
| 220.714936 | 0.211 |
| 220.735369 | 0.259 |
| 220.763612 | 0.143 |
| 220.775812 | 0.133 |
| 220.796762 | 0.221 |
| 220.814872 | 0.172 |
| 220.841646 | 0.153 |
| 220.855497 | 0.143 |
| 220.87594 | 0.085 |
| 220.89917 | 0.133 |
| 220.925815 | 0.133 |
| 220.935554 | 0.133 |
| 220.955346 | 0.182 |
| 220.975468 | 0.143 |
| 221.003941 | 0.191 |
| 221.014657 | 0.153 |
| 221.034717 | 0.172 |
| 221.055385 | 0.143 |
| 221.08479 | 0.172 |
| 221.095657 | 0.191 |
| 221.11478 | 0.124 |
| 221.135578 | 0.066 |
| 221.166347 | 0.192 |
| 221.175474 | 0.163 |
| 221.196529 | 0.201 |
| 221.214754 | 0.172 |
| 221.24493 | 0.133 |
| 221.2554 | 0.066 |
| 221.27556 | 0.095 |
| 221.294691 | 0.085 |
| 221.325207 | 0.047 |
| 221.33543 | 0.066 |
| 221.354541 | 0.075 |
| 221.375554 | 0.124 |
| 221.408616 | 0.076 |
| 221.415118 | 0.076 |
| 221.435159 | 0.114 |
| 221.455351 | 0.143 |
| 221.487294 | 0.172 |
| 221.494788 | 0.172 |
| 221.514685 | 0.143 |
| 221.535447 | 0.144 |
| 221.566788 | 0.134 |
| 221.575537 | 0.144 |
| 221.595641 | 0.066 |
| 221.614727 | 0.095 |
| 221.644891 | 0.018 |
| 221.65549 | -0.011 |
| 221.675622 | -0.04 |
| 221.694871 | 0.027 |
| 221.744022 | 0.153 |
| 221.755699 | 0.114 |
| 221.775544 | 0.124 |
| 221.806566 | 0.143 |
| 221.815488 | 0.114 |
| 221.834717 | 0.056 |
| 221.855357 | 0.114 |
| 221.883056 | 0.162 |
| 221.895021 | 0.24 |
| 221.914911 | 0.201 |
| 221.935338 | 0.095 |
| 221.964979 | 0.047 |
| 221.975548 | 0.047 |
| 221.996625 | 0.018 |
| 222.014718 | 0.018 |
| 222.040104 | 0.008 |
| 222.05545 | -0.001 |
| 222.075655 | 0.009 |
| 222.097764 | 0.037 |
| 222.125372 | 0.018 |
| 222.135537 | -0.011 |
| 222.155452 | -0.031 |
| 222.175872 | -0.069 |
| 222.205759 | -0.05 |
| 222.21475 | -0.06 |
| 222.235141 | -0.088 |
| 222.255332 | -0.117 |
| 222.286068 | -0.108 |
| 222.294603 | -0.088 |
| 222.314772 | -0.06 |
| 222.335363 | -0.05 |
| 222.367303 | -0.031 |
| 222.375434 | 0.008 |
| 222.396252 | 0.018 |
| 222.414752 | 0.037 |
| 222.445247 | 0.018 |
| 222.455521 | -0.02 |
| 222.475489 | -0.049 |
| 222.494596 | -0.088 |
| 222.522637 | -0.136 |
| 222.53546 | -0.185 |
| 222.554846 | -0.204 |
| 222.575477 | -0.214 |
| 222.606352 | -0.089 |
| 222.614971 | -0.089 |
| 222.635261 | -0.118 |
| 222.655742 | -0.186 |
| 222.686352 | -0.272 |
| 222.695896 | -0.186 |
| 222.714748 | -0.07 |
| 222.73535 | -0.06 |
| 222.767335 | -0.002 |
| 222.775425 | -0.002 |
| 222.796668 | 0.007 |
| 222.814747 | -0.002 |
| 222.864524 | 0.008 |
| 222.875647 | 0.037 |
| 222.895963 | 0.027 |
| 222.93552 | 0.037 |
| 222.955273 | 0.017 |
| 222.975546 | -0.079 |
| 223.004742 | -0.05 |
| 223.015874 | -0.002 |
| 223.035148 | -0.031 |
| 223.055354 | -0.031 |
| 223.08386 | -0.07 |
| 223.094814 | -0.041 |
| 223.115045 | -0.041 |
| 223.134927 | -0.031 |
| 223.163905 | -0.06 |
| 223.175589 | -0.012 |
| 223.197039 | -0.06 |
| 223.215094 | -0.002 |
| 223.243636 | -0.061 |
| 223.255496 | -0.099 |
| 223.275636 | -0.138 |
| 223.295923 | -0.147 |
| 223.325491 | -0.021 |
| 223.335562 | -0.05 |
| 223.35525 | -0.079 |
| 223.375531 | -0.089 |
| 223.405848 | -0.185 |
| 223.415159 | -0.185 |
| 223.435125 | -0.156 |
| 223.455403 | -0.243 |
| 223.484672 | -0.311 |
| 223.494805 | -0.272 |
| 223.514879 | -0.272 |
| 223.535337 | -0.214 |
| 223.568062 | -0.137 |
| 223.575291 | -0.156 |
| 223.597618 | -0.282 |
| 223.614755 | -0.166 |
| 223.642566 | -0.079 |
| 223.655388 | -0.04 |
| 223.675027 | -0.147 |
| 223.698947 | -0.156 |
| 223.727002 | -0.185 |
| 223.735579 | -0.098 |
| 223.755314 | -0.06 |
| 223.775542 | -0.098 |
| 223.807446 | -0.166 |
| 223.814673 | -0.166 |
| 223.835029 | -0.185 |
| 223.855386 | -0.205 |
| 223.90563 | -0.311 |
| 223.914491 | -0.282 |
| 223.935057 | -0.098 |
| 223.963434 | -0.137 |
| 223.975484 | -0.233 |
| 223.996985 | -0.398 |
| 224.014562 | -0.292 |
| 224.043314 | -0.147 |
| 224.055528 | -0.156 |
| 224.075622 | -0.262 |
| 224.099888 | -0.262 |
| 224.124834 | -0.233 |
| 224.135685 | -0.205 |
| 224.155339 | -0.272 |
| 224.175281 | -0.272 |
| 224.204206 | -0.205 |
| 224.214694 | -0.195 |
| 224.235398 | -0.175 |
| 224.255329 | -0.214 |
| 224.282926 | -0.185 |
| 224.2951 | -0.127 |
| 224.314734 | -0.195 |
| 224.335319 | -0.253 |
| 224.364583 | -0.311 |
| 224.375601 | -0.272 |
| 224.397149 | -0.272 |
| 224.414628 | -0.311 |
| 224.445542 | -0.282 |
| 224.455542 | -0.282 |
| 224.475591 | -0.176 |
| 224.497521 | -0.224 |
| 224.525498 | -0.233 |
| 224.535582 | -0.243 |
| 224.555427 | -0.195 |
| 224.574986 | -0.098 |
| 224.605755 | -0.185 |
| 224.614834 | -0.233 |
| 224.635137 | -0.253 |
| 224.65535 | -0.176 |
| 224.683832 | -0.234 |
| 224.69517 | -0.176 |
| 224.715046 | -0.262 |
| 224.735359 | -0.301 |
| 224.766719 | -0.253 |
| 224.775474 | -0.205 |
| 224.797056 | -0.079 |
| 224.814739 | 0.008 |
| 224.844708 | -0.031 |
| 224.855465 | -0.021 |
| 224.875549 | -0.089 |
| 224.895113 | -0.156 |
| 224.924749 | -0.166 |
| 224.935775 | -0.166 |
| 224.955297 | -0.214 |
| 224.975551 | -0.292 |
| 225.028962 | -0.176 |
| 225.035404 | -0.166 |
| 225.055331 | -0.146 |
| 225.085336 | -0.117 |
| 225.114943 | -0.205 |
| 225.135338 | -0.195 |
| 225.165637 | -0.195 |
| 225.197009 | -0.214 |
| 225.215133 | -0.186 |
| 225.243864 | -0.263 |
| 225.255488 | -0.176 |
| 225.275556 | -0.195 |
| 225.295605 | -0.214 |
| 225.323592 | -0.205 |
| 225.335479 | -0.166 |
| 225.35568 | -0.156 |
| 225.37558 | -0.195 |
| 225.406864 | -0.214 |
| 225.41514 | -0.224 |
| 225.435557 | -0.186 |
| 225.455323 | -0.205 |
| 225.487534 | -0.253 |
| 225.494775 | -0.166 |
| 225.514772 | -0.06 |
| 225.535653 | -0.021 |
| 225.566477 | -0.06 |
| 225.575509 | -0.108 |
| 225.597387 | -0.186 |
| 225.614809 | -0.099 |
| 225.644734 | -0.099 |
| 225.655365 | -0.06 |
| 225.675561 | 0.046 |
| 225.694871 | 0.007 |
| 225.724324 | -0.128 |
| 225.734831 | -0.099 |
| 225.755518 | -0.08 |
| 225.775602 | -0.118 |
| 225.80774 | -0.118 |
| 225.815816 | -0.07 |
| 225.83528 | -0.07 |
| 225.855404 | -0.108 |
| 225.888608 | 0.046 |
| 225.914939 | 0.017 |
| 225.93534 | -0.031 |
| 225.96866 | -0.089 |
| 225.97531 | -0.079 |
| 225.996587 | -0.05 |
| 226.014908 | -0.128 |
| 226.046775 | -0.137 |
| 226.055371 | -0.147 |
| 226.075603 | -0.137 |
| 226.094854 | -0.157 |
| 226.144409 | -0.108 |
| 226.155546 | -0.07 |
| 226.175535 | -0.176 |
| 226.205982 | -0.234 |
| 226.214933 | -0.138 |
| 226.235008 | -0.08 |
| 226.255431 | -0.06 |
| 226.286396 | 0.007 |
| 226.294509 | 0.037 |
| 226.31515 | -0.05 |
| 226.335391 | -0.079 |
| 226.366525 | -0.128 |
| 226.375553 | -0.195 |
| 226.396517 | -0.156 |
| 226.414904 | -0.108 |
| 226.443966 | -0.205 |
| 226.455453 | -0.282 |
| 226.476278 | -0.214 |
| 226.494908 | -0.205 |
| 226.525295 | -0.224 |
| 226.535461 | -0.253 |
| 226.555307 | -0.253 |
| 226.575611 | -0.215 |
| 226.609488 | -0.205 |
| 226.635209 | -0.156 |
| 226.65561 | -0.137 |
| 226.685159 | -0.127 |
| 226.695265 | -0.108 |
| 226.714951 | -0.146 |
| 226.735466 | -0.166 |
| 226.766582 | -0.156 |
| 226.79742 | -0.176 |
| 226.814988 | -0.243 |
| 226.84406 | -0.301 |
| 226.855463 | -0.137 |
| 226.875532 | -0.147 |
| 226.894993 | -0.156 |
| 226.923877 | -0.176 |
| 226.935682 | -0.224 |
| 226.955327 | -0.176 |
| 226.97553 | -0.157 |
| 227.008399 | -0.051 |
| 227.014913 | -0.089 |
| 227.035118 | -0.166 |
| 227.055305 | -0.224 |
| 227.089471 | -0.263 |
| 227.114772 | -0.214 |
| 227.135255 | -0.205 |
| 227.169186 | -0.282 |
| 227.196815 | -0.35 |
| 227.214746 | -0.272 |
| 227.263975 | -0.098 |
| 227.275533 | -0.118 |
| 227.297039 | -0.156 |
| 227.324028 | -0.243 |
| 227.33559 | -0.272 |
| 227.355463 | -0.205 |
| 227.375529 | -0.292 |
| 227.405757 | -0.35 |
| 227.415309 | -0.253 |
| 227.435054 | -0.282 |
| 227.455335 | -0.253 |
| 227.485476 | -0.34 |
| 227.494896 | -0.301 |
| 227.51489 | -0.253 |
| 227.535324 | -0.099 |
| 227.566104 | -0.128 |
| 227.57554 | -0.215 |
| 227.595789 | -0.282 |
| 227.614894 | -0.214 |
| 227.644091 | -0.06 |
| 227.65548 | -0.079 |
| 227.675532 | -0.205 |
| 227.695533 | -0.311 |
| 227.723971 | -0.292 |
| 227.735508 | -0.263 |
| 227.75532 | -0.321 |
| 227.775542 | -0.263 |
| 227.805989 | -0.205 |
| 227.814927 | -0.195 |
| 227.835212 | -0.157 |
| 227.85548 | -0.157 |
| 227.88311 | -0.07 |
| 227.894914 | -0.07 |
| 227.914828 | -0.137 |
| 227.935398 | -0.215 |
| 227.967187 | -0.205 |
| 227.97541 | -0.195 |
| 227.997301 | -0.205 |
| 228.014795 | -0.272 |
| 228.046619 | -0.253 |
| 228.055463 | -0.272 |
| 228.075192 | -0.35 |
| 228.095248 | -0.282 |
| 228.124641 | -0.302 |
| 228.135575 | -0.224 |
| 228.155328 | -0.224 |
| 228.175644 | -0.127 |
| 228.208211 | -0.176 |
| 228.235137 | -0.118 |
| 228.255267 | -0.137 |
| 228.307201 | -0.234 |
| 228.335332 | -0.292 |
| 228.364431 | -0.176 |
| 228.375526 | -0.109 |
| 228.396884 | -0.138 |
| 228.414771 | -0.196 |
| 228.442363 | -0.118 |
| 228.45547 | -0.108 |
| 228.475541 | -0.118 |
| 228.49955 | -0.166 |
| 228.52606 | -0.098 |
| 228.53567 | -0.166 |
| 228.555454 | -0.186 |
| 228.575528 | -0.166 |
| 228.606607 | -0.147 |
| 228.614491 | -0.186 |
| 228.635116 | -0.128 |
| 228.655377 | -0.099 |
| 228.685131 | -0.282 |
| 228.695618 | -0.214 |
| 228.714891 | -0.205 |
| 228.735323 | -0.263 |
| 228.766578 | -0.34 |
| 228.797133 | -0.253 |
| 228.814721 | -0.224 |
| 228.843582 | -0.215 |
| 228.854972 | -0.224 |
| 228.875522 | -0.263 |
| 228.896249 | -0.224 |
| 228.925093 | -0.321 |
| 228.935958 | -0.301 |
| 228.955349 | -0.34 |
| 228.975581 | -0.33 |
| 229.00728 | -0.04 |
| 229.035204 | -0.166 |
| 229.055349 | -0.05 |
| 229.086525 | -0.32 |
| 229.115307 | -0.513 |
| 229.135409 | -0.542 |
| 229.168115 | -0.996 |
| 229.197301 | -1.918 |
| 229.214693 | -1.085 |
| 229.245754 | 2.591 |
| 229.275541 | 1.385 |
| 229.295521 | 2.032 |
| 229.326447 | 1.094 |
| 229.355311 | 1.421 |
| 229.375398 | 2.166 |
| 229.4287 | 0.503 |
| 229.435808 | 0.599 |
| 229.455339 | 1.218 |
| 229.483266 | 0.791 |
| 229.495735 | 0.781 |
| 229.515048 | 0.52 |
| 229.53538 | 0.782 |
| 229.564985 | -0.009 |
| 229.575555 | 0.165 |
| 229.596898 | 0.926 |
| 229.615019 | 0.926 |
| 229.643639 | 1.194 |
| 229.655523 | 1.27 |
| 229.675687 | 1.453 |
| 229.696529 | 2.031 |
| 229.724729 | 1.981 |
| 229.735575 | 1.555 |
| 229.755367 | 1.315 |
| 229.77553 | 0.756 |
| 229.806618 | 0.734 |
| 229.815401 | 0.771 |
| 229.835398 | 0.637 |
| 229.855653 | 0.27 |
| 229.884121 | 0.465 |
| 229.894835 | 0.388 |
| 229.914759 | -0.056 |
| 229.935225 | 0.204 |
| 229.967475 | 0.396 |
| 229.996552 | 0.116 |
| 230.015542 | -0.183 |
| 230.045939 | -0.695 |
| 230.055195 | -0.579 |
| 230.075568 | -0.086 |
| 230.095027 | -0.405 |
| 230.124742 | 0.407 |
| 230.135619 | 0.455 |
| 230.15491 | 0.262 |
| 230.175619 | -0.365 |
| 230.208277 | -0.413 |
| 230.235334 | -0.374 |
| 230.255354 | -0.365 |
| 230.286919 | -0.153 |
| 230.295472 | -0.115 |
| 230.315096 | -0.095 |
| 230.335349 | -0.056 |
| 230.368104 | 0.079 |
| 230.396906 | -0.143 |
| 230.415185 | -0.307 |
| 230.44706 | 0.079 |
| 230.475418 | 0.157 |
| 230.49497 | 0.128 |
| 230.545758 | -0.259 |
| 230.575756 | -0.056 |
| 230.609509 | -0.132 |
| 230.615117 | -0.054 |
| 230.635138 | -0.122 |
| 230.655313 | -0.489 |
| 230.687053 | -0.46 |
| 230.714768 | -0.151 |
| 230.735482 | -0.067 |
| 230.76581 | -0.222 |